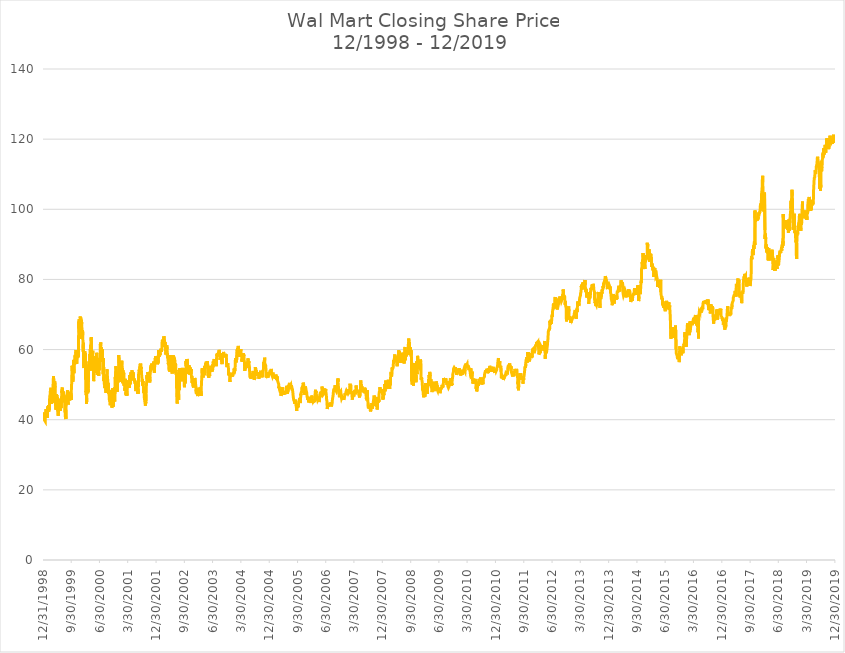
| Category | Close |
|---|---|
| 12/31/98 | 40.719 |
| 1/4/99 | 40.312 |
| 1/5/99 | 40.625 |
| 1/6/99 | 41.312 |
| 1/7/99 | 42.062 |
| 1/8/99 | 41.75 |
| 1/11/99 | 40.812 |
| 1/12/99 | 40.188 |
| 1/13/99 | 40.312 |
| 1/14/99 | 39.875 |
| 1/15/99 | 40.062 |
| 1/19/99 | 40.031 |
| 1/20/99 | 40.125 |
| 1/21/99 | 39.531 |
| 1/22/99 | 41 |
| 1/25/99 | 41 |
| 1/26/99 | 41.781 |
| 1/27/99 | 42.594 |
| 1/28/99 | 42.562 |
| 1/29/99 | 43 |
| 2/1/99 | 42.25 |
| 2/2/99 | 41.812 |
| 2/3/99 | 42.875 |
| 2/4/99 | 41.875 |
| 2/5/99 | 42.125 |
| 2/8/99 | 42.719 |
| 2/9/99 | 41.062 |
| 2/10/99 | 40.469 |
| 2/11/99 | 42.906 |
| 2/12/99 | 42.188 |
| 2/16/99 | 43.781 |
| 2/17/99 | 42.531 |
| 2/18/99 | 42.688 |
| 2/19/99 | 42.375 |
| 2/22/99 | 44.125 |
| 2/23/99 | 43.75 |
| 2/24/99 | 42.281 |
| 2/25/99 | 42.5 |
| 2/26/99 | 43.062 |
| 3/1/99 | 42.938 |
| 3/2/99 | 42.719 |
| 3/3/99 | 43.688 |
| 3/4/99 | 44.688 |
| 3/5/99 | 46.625 |
| 3/8/99 | 46.719 |
| 3/9/99 | 47 |
| 3/10/99 | 46.781 |
| 3/11/99 | 47.656 |
| 3/12/99 | 48.188 |
| 3/15/99 | 48.375 |
| 3/16/99 | 48 |
| 3/17/99 | 48.188 |
| 3/18/99 | 49.094 |
| 3/19/99 | 47.375 |
| 3/22/99 | 46.656 |
| 3/23/99 | 45.25 |
| 3/24/99 | 44.5 |
| 3/25/99 | 45.938 |
| 3/26/99 | 45.781 |
| 3/29/99 | 47.5 |
| 3/30/99 | 47.5 |
| 3/31/99 | 46.094 |
| 4/1/99 | 46.625 |
| 4/5/99 | 47.688 |
| 4/6/99 | 47.844 |
| 4/7/99 | 48.75 |
| 4/8/99 | 51.125 |
| 4/9/99 | 51.375 |
| 4/12/99 | 52.438 |
| 4/13/99 | 52.281 |
| 4/14/99 | 49.312 |
| 4/15/99 | 48.875 |
| 4/16/99 | 47.5 |
| 4/19/99 | 44.875 |
| 4/20/99 | 47.75 |
| 4/21/99 | 48.75 |
| 4/22/99 | 50.062 |
| 4/23/99 | 50.938 |
| 4/26/99 | 50.938 |
| 4/27/99 | 50.75 |
| 4/28/99 | 49.188 |
| 4/29/99 | 46.875 |
| 4/30/99 | 46 |
| 5/3/99 | 46.125 |
| 5/4/99 | 44 |
| 5/5/99 | 45.062 |
| 5/6/99 | 42.875 |
| 5/7/99 | 44.75 |
| 5/10/99 | 45.188 |
| 5/11/99 | 47.312 |
| 5/12/99 | 46.562 |
| 5/13/99 | 47 |
| 5/14/99 | 46.375 |
| 5/17/99 | 45.688 |
| 5/18/99 | 46.438 |
| 5/19/99 | 45.688 |
| 5/20/99 | 44.5 |
| 5/21/99 | 43.25 |
| 5/24/99 | 42.812 |
| 5/25/99 | 42.375 |
| 5/26/99 | 42.938 |
| 5/27/99 | 41.125 |
| 5/28/99 | 42.625 |
| 6/1/99 | 43.438 |
| 6/2/99 | 44.375 |
| 6/3/99 | 45.5 |
| 6/4/99 | 46 |
| 6/7/99 | 45.75 |
| 6/8/99 | 44.375 |
| 6/9/99 | 44.125 |
| 6/10/99 | 43.125 |
| 6/11/99 | 42.688 |
| 6/14/99 | 43.125 |
| 6/15/99 | 42.5 |
| 6/16/99 | 44.375 |
| 6/17/99 | 43.625 |
| 6/18/99 | 43.75 |
| 6/21/99 | 45.062 |
| 6/22/99 | 44.938 |
| 6/23/99 | 44.375 |
| 6/24/99 | 43.312 |
| 6/25/99 | 43.438 |
| 6/28/99 | 45.562 |
| 6/29/99 | 46.812 |
| 6/30/99 | 48.25 |
| 7/1/99 | 47.75 |
| 7/2/99 | 48.75 |
| 7/6/99 | 49.188 |
| 7/7/99 | 48 |
| 7/8/99 | 47 |
| 7/9/99 | 47.938 |
| 7/12/99 | 47.438 |
| 7/13/99 | 47.562 |
| 7/14/99 | 47.625 |
| 7/15/99 | 47.5 |
| 7/16/99 | 48 |
| 7/19/99 | 48.062 |
| 7/20/99 | 46.875 |
| 7/21/99 | 45.438 |
| 7/22/99 | 45.188 |
| 7/23/99 | 44.938 |
| 7/26/99 | 45.625 |
| 7/27/99 | 45.562 |
| 7/28/99 | 45.062 |
| 7/29/99 | 44 |
| 7/30/99 | 42.25 |
| 8/2/99 | 42.375 |
| 8/3/99 | 41.938 |
| 8/4/99 | 40.938 |
| 8/5/99 | 41.375 |
| 8/6/99 | 41.25 |
| 8/9/99 | 40.188 |
| 8/10/99 | 42.875 |
| 8/11/99 | 43.375 |
| 8/12/99 | 44.375 |
| 8/13/99 | 44.812 |
| 8/16/99 | 46 |
| 8/17/99 | 46.938 |
| 8/18/99 | 46.375 |
| 8/19/99 | 46.062 |
| 8/20/99 | 46.688 |
| 8/23/99 | 47.75 |
| 8/24/99 | 47.562 |
| 8/25/99 | 48.375 |
| 8/26/99 | 47.312 |
| 8/27/99 | 46.688 |
| 8/30/99 | 45.5 |
| 8/31/99 | 44.312 |
| 9/1/99 | 45 |
| 9/2/99 | 45.688 |
| 9/3/99 | 47.562 |
| 9/7/99 | 46.25 |
| 9/8/99 | 47.125 |
| 9/9/99 | 47.5 |
| 9/10/99 | 47.688 |
| 9/13/99 | 48 |
| 9/14/99 | 46.938 |
| 9/15/99 | 45.5 |
| 9/16/99 | 45.312 |
| 9/17/99 | 46.625 |
| 9/20/99 | 46.188 |
| 9/21/99 | 45.75 |
| 9/22/99 | 47.25 |
| 9/23/99 | 46.688 |
| 9/24/99 | 46.5 |
| 9/27/99 | 46.312 |
| 9/28/99 | 46.938 |
| 9/29/99 | 45.625 |
| 9/30/99 | 47.562 |
| 10/1/99 | 48.312 |
| 10/4/99 | 50.312 |
| 10/5/99 | 51.25 |
| 10/6/99 | 51.375 |
| 10/7/99 | 51.312 |
| 10/8/99 | 55.375 |
| 10/11/99 | 53.938 |
| 10/12/99 | 53.875 |
| 10/13/99 | 51.312 |
| 10/14/99 | 52.375 |
| 10/15/99 | 50.812 |
| 10/18/99 | 52.125 |
| 10/19/99 | 52.688 |
| 10/20/99 | 54.812 |
| 10/21/99 | 54.875 |
| 10/22/99 | 57.062 |
| 10/25/99 | 55.938 |
| 10/26/99 | 53.25 |
| 10/27/99 | 53 |
| 10/28/99 | 55.75 |
| 10/29/99 | 56.312 |
| 11/1/99 | 56.25 |
| 11/2/99 | 56.125 |
| 11/3/99 | 55.75 |
| 11/4/99 | 56 |
| 11/5/99 | 58.062 |
| 11/8/99 | 58.5 |
| 11/9/99 | 58 |
| 11/10/99 | 57.125 |
| 11/11/99 | 57.438 |
| 11/12/99 | 58.875 |
| 11/15/99 | 58.938 |
| 11/16/99 | 59.875 |
| 11/17/99 | 58.875 |
| 11/18/99 | 59.375 |
| 11/19/99 | 58.125 |
| 11/22/99 | 56.75 |
| 11/23/99 | 55.938 |
| 11/24/99 | 57.938 |
| 11/26/99 | 58.203 |
| 11/29/99 | 59 |
| 11/30/99 | 57.625 |
| 12/1/99 | 58.578 |
| 12/2/99 | 57.672 |
| 12/3/99 | 59.062 |
| 12/6/99 | 59.578 |
| 12/7/99 | 58 |
| 12/8/99 | 58.656 |
| 12/9/99 | 62.25 |
| 12/10/99 | 63.25 |
| 12/13/99 | 68 |
| 12/14/99 | 67.062 |
| 12/15/99 | 66.016 |
| 12/16/99 | 68.625 |
| 12/17/99 | 65 |
| 12/20/99 | 64.281 |
| 12/21/99 | 64.812 |
| 12/22/99 | 65.688 |
| 12/23/99 | 67.375 |
| 12/27/99 | 69.438 |
| 12/28/99 | 69.312 |
| 12/29/99 | 67.375 |
| 12/30/99 | 67.812 |
| 12/31/99 | 69.125 |
| 1/3/00 | 66.812 |
| 1/4/00 | 64.312 |
| 1/5/00 | 63 |
| 1/6/00 | 63.688 |
| 1/7/00 | 68.5 |
| 1/10/00 | 67.25 |
| 1/11/00 | 66.25 |
| 1/12/00 | 65.062 |
| 1/13/00 | 65.125 |
| 1/14/00 | 64.5 |
| 1/18/00 | 65.562 |
| 1/19/00 | 64.062 |
| 1/20/00 | 63.375 |
| 1/21/00 | 62.438 |
| 1/24/00 | 59.375 |
| 1/25/00 | 61.125 |
| 1/26/00 | 61.938 |
| 1/27/00 | 59.125 |
| 1/28/00 | 55.125 |
| 1/31/00 | 54.75 |
| 2/1/00 | 58.688 |
| 2/2/00 | 58.375 |
| 2/3/00 | 58.375 |
| 2/4/00 | 56.312 |
| 2/7/00 | 55.75 |
| 2/8/00 | 59.5 |
| 2/9/00 | 57.812 |
| 2/10/00 | 57 |
| 2/11/00 | 56.062 |
| 2/14/00 | 58.875 |
| 2/15/00 | 58 |
| 2/16/00 | 52.75 |
| 2/17/00 | 48.375 |
| 2/18/00 | 47.75 |
| 2/22/00 | 48.125 |
| 2/23/00 | 47 |
| 2/24/00 | 47.875 |
| 2/25/00 | 44.5 |
| 2/28/00 | 46.188 |
| 2/29/00 | 48.75 |
| 3/1/00 | 49 |
| 3/2/00 | 50.562 |
| 3/3/00 | 52.625 |
| 3/6/00 | 50.5 |
| 3/7/00 | 47.562 |
| 3/8/00 | 48.312 |
| 3/9/00 | 48.938 |
| 3/10/00 | 47.938 |
| 3/13/00 | 47.688 |
| 3/14/00 | 47.75 |
| 3/15/00 | 51.5 |
| 3/16/00 | 54.625 |
| 3/17/00 | 55.75 |
| 3/20/00 | 55.125 |
| 3/21/00 | 56.625 |
| 3/22/00 | 55.375 |
| 3/23/00 | 54 |
| 3/24/00 | 55.5 |
| 3/27/00 | 55.438 |
| 3/28/00 | 54.5 |
| 3/29/00 | 58.75 |
| 3/30/00 | 59 |
| 3/31/00 | 56.5 |
| 4/3/00 | 61.188 |
| 4/4/00 | 60 |
| 4/5/00 | 58.25 |
| 4/6/00 | 61.125 |
| 4/7/00 | 61.5 |
| 4/10/00 | 63.562 |
| 4/11/00 | 63.375 |
| 4/12/00 | 62.438 |
| 4/13/00 | 60.062 |
| 4/14/00 | 55 |
| 4/17/00 | 54 |
| 4/18/00 | 53.875 |
| 4/19/00 | 54.938 |
| 4/20/00 | 57.688 |
| 4/24/00 | 58.875 |
| 4/25/00 | 59.688 |
| 4/26/00 | 58.75 |
| 4/27/00 | 57.688 |
| 4/28/00 | 55.375 |
| 5/1/00 | 57.938 |
| 5/2/00 | 57.625 |
| 5/3/00 | 53.438 |
| 5/4/00 | 51 |
| 5/5/00 | 51.312 |
| 5/8/00 | 52.375 |
| 5/9/00 | 53 |
| 5/10/00 | 56.688 |
| 5/11/00 | 56 |
| 5/12/00 | 56.812 |
| 5/15/00 | 57 |
| 5/16/00 | 58 |
| 5/17/00 | 56.375 |
| 5/18/00 | 57.938 |
| 5/19/00 | 57.062 |
| 5/22/00 | 57.375 |
| 5/23/00 | 57.188 |
| 5/24/00 | 56.875 |
| 5/25/00 | 55 |
| 5/26/00 | 54 |
| 5/30/00 | 53.375 |
| 5/31/00 | 57.625 |
| 6/1/00 | 57 |
| 6/2/00 | 59.062 |
| 6/5/00 | 59.312 |
| 6/6/00 | 58.25 |
| 6/7/00 | 57.875 |
| 6/8/00 | 56.875 |
| 6/9/00 | 54 |
| 6/12/00 | 52.75 |
| 6/13/00 | 55 |
| 6/14/00 | 55.125 |
| 6/15/00 | 55.5 |
| 6/16/00 | 53.875 |
| 6/19/00 | 54.375 |
| 6/20/00 | 54.5 |
| 6/21/00 | 53.938 |
| 6/22/00 | 52.5 |
| 6/23/00 | 53.75 |
| 6/26/00 | 53.75 |
| 6/27/00 | 56.812 |
| 6/28/00 | 55.984 |
| 6/29/00 | 54.125 |
| 6/30/00 | 57.625 |
| 7/3/00 | 56.875 |
| 7/5/00 | 57 |
| 7/6/00 | 57.5 |
| 7/7/00 | 61.562 |
| 7/10/00 | 61.25 |
| 7/11/00 | 62 |
| 7/12/00 | 61 |
| 7/13/00 | 59.125 |
| 7/14/00 | 59.5 |
| 7/17/00 | 60.719 |
| 7/18/00 | 60.062 |
| 7/19/00 | 60 |
| 7/20/00 | 60 |
| 7/21/00 | 59.688 |
| 7/24/00 | 57.438 |
| 7/25/00 | 59.188 |
| 7/26/00 | 58.75 |
| 7/27/00 | 60.062 |
| 7/28/00 | 58.688 |
| 7/31/00 | 55.25 |
| 8/1/00 | 54.5 |
| 8/2/00 | 54.062 |
| 8/3/00 | 53.875 |
| 8/4/00 | 52.938 |
| 8/7/00 | 55.125 |
| 8/8/00 | 57.625 |
| 8/9/00 | 53.625 |
| 8/10/00 | 51 |
| 8/11/00 | 52.125 |
| 8/14/00 | 52.875 |
| 8/15/00 | 51.562 |
| 8/16/00 | 49.938 |
| 8/17/00 | 50 |
| 8/18/00 | 50.875 |
| 8/21/00 | 49 |
| 8/22/00 | 49.125 |
| 8/23/00 | 49.125 |
| 8/24/00 | 49.438 |
| 8/25/00 | 50.5 |
| 8/28/00 | 49.5 |
| 8/29/00 | 49.438 |
| 8/30/00 | 48.438 |
| 8/31/00 | 47.625 |
| 9/1/00 | 48.75 |
| 9/5/00 | 49.75 |
| 9/6/00 | 50 |
| 9/7/00 | 51 |
| 9/8/00 | 52.125 |
| 9/11/00 | 54.375 |
| 9/12/00 | 54 |
| 9/13/00 | 53.875 |
| 9/14/00 | 52.5 |
| 9/15/00 | 52 |
| 9/18/00 | 51.125 |
| 9/19/00 | 49.875 |
| 9/20/00 | 48.5 |
| 9/21/00 | 50 |
| 9/22/00 | 50.5 |
| 9/25/00 | 49 |
| 9/26/00 | 47.375 |
| 9/27/00 | 48.125 |
| 9/28/00 | 48.562 |
| 9/29/00 | 48.125 |
| 10/2/00 | 46.25 |
| 10/3/00 | 45.812 |
| 10/4/00 | 46.125 |
| 10/5/00 | 46.062 |
| 10/6/00 | 45.5 |
| 10/9/00 | 45.125 |
| 10/10/00 | 46.375 |
| 10/11/00 | 45.312 |
| 10/12/00 | 44.125 |
| 10/13/00 | 45 |
| 10/16/00 | 47.312 |
| 10/17/00 | 46 |
| 10/18/00 | 46.75 |
| 10/19/00 | 47.812 |
| 10/20/00 | 46.562 |
| 10/23/00 | 47.312 |
| 10/24/00 | 48.375 |
| 10/25/00 | 45.938 |
| 10/26/00 | 43.438 |
| 10/27/00 | 43.25 |
| 10/30/00 | 43.75 |
| 10/31/00 | 45.375 |
| 11/1/00 | 46.688 |
| 11/2/00 | 48.438 |
| 11/3/00 | 47.375 |
| 11/6/00 | 49 |
| 11/7/00 | 48.938 |
| 11/8/00 | 48.75 |
| 11/9/00 | 47.125 |
| 11/10/00 | 43.688 |
| 11/13/00 | 45.312 |
| 11/14/00 | 46.875 |
| 11/15/00 | 49 |
| 11/16/00 | 48.25 |
| 11/17/00 | 48.562 |
| 11/20/00 | 47.875 |
| 11/21/00 | 47.125 |
| 11/22/00 | 45.875 |
| 11/24/00 | 45.188 |
| 11/27/00 | 49.312 |
| 11/28/00 | 49 |
| 11/29/00 | 51.875 |
| 11/30/00 | 52.188 |
| 12/1/00 | 51.188 |
| 12/4/00 | 53.812 |
| 12/5/00 | 55.25 |
| 12/6/00 | 54.812 |
| 12/7/00 | 55 |
| 12/8/00 | 54.438 |
| 12/11/00 | 51.375 |
| 12/12/00 | 51.875 |
| 12/13/00 | 50.312 |
| 12/14/00 | 51.062 |
| 12/15/00 | 49.875 |
| 12/18/00 | 50.562 |
| 12/19/00 | 48 |
| 12/20/00 | 48.938 |
| 12/21/00 | 51.75 |
| 12/22/00 | 52.5 |
| 12/26/00 | 50.625 |
| 12/27/00 | 52.562 |
| 12/28/00 | 52.938 |
| 12/29/00 | 53.125 |
| 1/2/01 | 53.875 |
| 1/3/01 | 58.438 |
| 1/4/01 | 56.188 |
| 1/5/01 | 53.938 |
| 1/8/01 | 53.938 |
| 1/9/01 | 52.75 |
| 1/10/01 | 51.688 |
| 1/11/01 | 51.938 |
| 1/12/01 | 52.938 |
| 1/16/01 | 54.688 |
| 1/17/01 | 53.938 |
| 1/18/01 | 53.062 |
| 1/19/01 | 50.812 |
| 1/22/01 | 52.562 |
| 1/23/01 | 53.375 |
| 1/24/01 | 53.5 |
| 1/25/01 | 54 |
| 1/26/01 | 53.625 |
| 1/29/01 | 54.2 |
| 1/30/01 | 53.77 |
| 1/31/01 | 56.8 |
| 2/1/01 | 55.7 |
| 2/2/01 | 54.76 |
| 2/5/01 | 53.84 |
| 2/6/01 | 53.2 |
| 2/7/01 | 54.66 |
| 2/8/01 | 52.3 |
| 2/9/01 | 50.4 |
| 2/12/01 | 53.45 |
| 2/13/01 | 54.1 |
| 2/14/01 | 53 |
| 2/15/01 | 52 |
| 2/16/01 | 52.36 |
| 2/20/01 | 53.4 |
| 2/21/01 | 50.21 |
| 2/22/01 | 49.7 |
| 2/23/01 | 50.28 |
| 2/26/01 | 51.07 |
| 2/27/01 | 50.99 |
| 2/28/01 | 50.09 |
| 3/1/01 | 48.34 |
| 3/2/01 | 48.92 |
| 3/5/01 | 48.37 |
| 3/6/01 | 49.55 |
| 3/7/01 | 50.7 |
| 3/8/01 | 51.65 |
| 3/9/01 | 50.78 |
| 3/12/01 | 48.31 |
| 3/13/01 | 48.8 |
| 3/14/01 | 47.2 |
| 3/15/01 | 47.85 |
| 3/16/01 | 46.93 |
| 3/19/01 | 47.38 |
| 3/20/01 | 47.88 |
| 3/21/01 | 48.31 |
| 3/22/01 | 46.91 |
| 3/23/01 | 47.57 |
| 3/26/01 | 49.6 |
| 3/27/01 | 50.29 |
| 3/28/01 | 49.66 |
| 3/29/01 | 50.62 |
| 3/30/01 | 50.5 |
| 4/2/01 | 50.64 |
| 4/3/01 | 49.19 |
| 4/4/01 | 49.87 |
| 4/5/01 | 50.54 |
| 4/6/01 | 51.24 |
| 4/9/01 | 50.3 |
| 4/10/01 | 50.84 |
| 4/11/01 | 50.23 |
| 4/12/01 | 49.7 |
| 4/16/01 | 49.05 |
| 4/17/01 | 49.24 |
| 4/18/01 | 52.73 |
| 4/19/01 | 52.5 |
| 4/20/01 | 51.71 |
| 4/23/01 | 52.04 |
| 4/24/01 | 50.1 |
| 4/25/01 | 50.67 |
| 4/26/01 | 51.24 |
| 4/27/01 | 52.83 |
| 4/30/01 | 51.74 |
| 5/1/01 | 53.5 |
| 5/2/01 | 53.08 |
| 5/3/01 | 53.1 |
| 5/4/01 | 53.02 |
| 5/7/01 | 52.05 |
| 5/8/01 | 51.98 |
| 5/9/01 | 51.59 |
| 5/10/01 | 53.42 |
| 5/11/01 | 54.1 |
| 5/14/01 | 54.35 |
| 5/15/01 | 52 |
| 5/16/01 | 51.65 |
| 5/17/01 | 51.76 |
| 5/18/01 | 52.04 |
| 5/21/01 | 53.2 |
| 5/22/01 | 53.52 |
| 5/23/01 | 52.52 |
| 5/24/01 | 52.89 |
| 5/25/01 | 51.2 |
| 5/29/01 | 51.21 |
| 5/30/01 | 51.47 |
| 5/31/01 | 51.75 |
| 6/1/01 | 51.72 |
| 6/4/01 | 50.99 |
| 6/5/01 | 51.3 |
| 6/6/01 | 50.75 |
| 6/7/01 | 51.1 |
| 6/8/01 | 51.02 |
| 6/11/01 | 50.23 |
| 6/12/01 | 50.57 |
| 6/13/01 | 50.15 |
| 6/14/01 | 49.5 |
| 6/15/01 | 48.15 |
| 6/18/01 | 48.52 |
| 6/19/01 | 48.86 |
| 6/20/01 | 49.8 |
| 6/21/01 | 50.45 |
| 6/22/01 | 49.98 |
| 6/25/01 | 49 |
| 6/26/01 | 49.1 |
| 6/27/01 | 48.5 |
| 6/28/01 | 49.37 |
| 6/29/01 | 48.8 |
| 7/2/01 | 49.75 |
| 7/3/01 | 49.22 |
| 7/5/01 | 48.6 |
| 7/6/01 | 47.34 |
| 7/9/01 | 48.25 |
| 7/10/01 | 47.5 |
| 7/11/01 | 48.85 |
| 7/12/01 | 51.85 |
| 7/13/01 | 52.9 |
| 7/16/01 | 53.48 |
| 7/17/01 | 53.35 |
| 7/18/01 | 53.98 |
| 7/19/01 | 54.23 |
| 7/20/01 | 54.28 |
| 7/23/01 | 53.03 |
| 7/24/01 | 53.1 |
| 7/25/01 | 55.1 |
| 7/26/01 | 55.5 |
| 7/27/01 | 55.41 |
| 7/30/01 | 55.88 |
| 7/31/01 | 55.9 |
| 8/1/01 | 55.01 |
| 8/2/01 | 55.99 |
| 8/3/01 | 55.39 |
| 8/6/01 | 54.5 |
| 8/7/01 | 55.08 |
| 8/8/01 | 54.53 |
| 8/9/01 | 54.17 |
| 8/10/01 | 53.6 |
| 8/13/01 | 52.2 |
| 8/14/01 | 52.36 |
| 8/15/01 | 52 |
| 8/16/01 | 51.69 |
| 8/17/01 | 50.8 |
| 8/20/01 | 51.59 |
| 8/21/01 | 49.94 |
| 8/22/01 | 50.24 |
| 8/23/01 | 49.74 |
| 8/24/01 | 50.95 |
| 8/27/01 | 50.39 |
| 8/28/01 | 50.1 |
| 8/29/01 | 49.15 |
| 8/30/01 | 47.6 |
| 8/31/01 | 48.05 |
| 9/4/01 | 48.45 |
| 9/5/01 | 49.15 |
| 9/6/01 | 47.37 |
| 9/7/01 | 46.22 |
| 9/10/01 | 46.23 |
| 9/17/01 | 44 |
| 9/18/01 | 45.35 |
| 9/19/01 | 45.45 |
| 9/20/01 | 45.31 |
| 9/21/01 | 44.66 |
| 9/24/01 | 47.28 |
| 9/25/01 | 48.4 |
| 9/26/01 | 49.48 |
| 9/27/01 | 49.39 |
| 9/28/01 | 49.5 |
| 10/1/01 | 49.76 |
| 10/2/01 | 51.6 |
| 10/3/01 | 52.73 |
| 10/4/01 | 51.5 |
| 10/5/01 | 52.4 |
| 10/8/01 | 51.11 |
| 10/9/01 | 52.08 |
| 10/10/01 | 53.63 |
| 10/11/01 | 53.49 |
| 10/12/01 | 52.9 |
| 10/15/01 | 53.48 |
| 10/16/01 | 53.14 |
| 10/17/01 | 52.22 |
| 10/18/01 | 51.9 |
| 10/19/01 | 53.01 |
| 10/22/01 | 53.04 |
| 10/23/01 | 52.61 |
| 10/24/01 | 52.48 |
| 10/25/01 | 53.3 |
| 10/26/01 | 53.42 |
| 10/29/01 | 51.9 |
| 10/30/01 | 50.6 |
| 10/31/01 | 51.4 |
| 11/1/01 | 52.24 |
| 11/2/01 | 52.97 |
| 11/5/01 | 53.9 |
| 11/6/01 | 54.94 |
| 11/7/01 | 53.82 |
| 11/8/01 | 54.5 |
| 11/9/01 | 55.1 |
| 11/12/01 | 55.58 |
| 11/13/01 | 54.26 |
| 11/14/01 | 55.28 |
| 11/15/01 | 56 |
| 11/16/01 | 55.1 |
| 11/19/01 | 55.75 |
| 11/20/01 | 55.7 |
| 11/21/01 | 55.12 |
| 11/23/01 | 55.8 |
| 11/26/01 | 55.75 |
| 11/27/01 | 55.08 |
| 11/28/01 | 55 |
| 11/29/01 | 54.65 |
| 11/30/01 | 55.15 |
| 12/3/01 | 54.58 |
| 12/4/01 | 55.17 |
| 12/5/01 | 56.57 |
| 12/6/01 | 55.62 |
| 12/7/01 | 55.34 |
| 12/10/01 | 54.27 |
| 12/11/01 | 54.08 |
| 12/12/01 | 54.33 |
| 12/13/01 | 53.36 |
| 12/14/01 | 54.06 |
| 12/17/01 | 55.85 |
| 12/18/01 | 55.78 |
| 12/19/01 | 56.28 |
| 12/20/01 | 56.26 |
| 12/21/01 | 57.57 |
| 12/24/01 | 57.13 |
| 12/26/01 | 58.15 |
| 12/27/01 | 58.37 |
| 12/28/01 | 58.35 |
| 12/31/01 | 57.55 |
| 1/2/02 | 58.05 |
| 1/3/02 | 57.98 |
| 1/4/02 | 57.6 |
| 1/7/02 | 57.39 |
| 1/8/02 | 57.84 |
| 1/9/02 | 56.4 |
| 1/10/02 | 57 |
| 1/11/02 | 55.8 |
| 1/14/02 | 55.76 |
| 1/15/02 | 56.87 |
| 1/16/02 | 55.99 |
| 1/17/02 | 56.76 |
| 1/18/02 | 56.35 |
| 1/22/02 | 58.01 |
| 1/23/02 | 59.86 |
| 1/24/02 | 59.67 |
| 1/25/02 | 58.4 |
| 1/28/02 | 58.63 |
| 1/29/02 | 57.91 |
| 1/30/02 | 59.75 |
| 1/31/02 | 59.98 |
| 2/1/02 | 59.26 |
| 2/4/02 | 58.9 |
| 2/5/02 | 58.8 |
| 2/6/02 | 58.88 |
| 2/7/02 | 58.39 |
| 2/8/02 | 59.15 |
| 2/11/02 | 60.25 |
| 2/12/02 | 60.1 |
| 2/13/02 | 60.12 |
| 2/14/02 | 60.49 |
| 2/15/02 | 60.03 |
| 2/19/02 | 59.29 |
| 2/20/02 | 60.02 |
| 2/21/02 | 59.55 |
| 2/22/02 | 59.95 |
| 2/25/02 | 60.65 |
| 2/26/02 | 62.1 |
| 2/27/02 | 62.25 |
| 2/28/02 | 62.01 |
| 3/1/02 | 62.81 |
| 3/4/02 | 62.98 |
| 3/5/02 | 60.76 |
| 3/6/02 | 60.9 |
| 3/7/02 | 61.7 |
| 3/8/02 | 62.52 |
| 3/11/02 | 62.53 |
| 3/12/02 | 62.23 |
| 3/13/02 | 61.99 |
| 3/14/02 | 62.27 |
| 3/15/02 | 63.75 |
| 3/18/02 | 63.55 |
| 3/19/02 | 63.46 |
| 3/20/02 | 63.18 |
| 3/21/02 | 62.2 |
| 3/22/02 | 62.05 |
| 3/25/02 | 61.28 |
| 3/26/02 | 62.17 |
| 3/27/02 | 62 |
| 3/28/02 | 61.3 |
| 4/1/02 | 59.56 |
| 4/2/02 | 58.93 |
| 4/3/02 | 58.6 |
| 4/4/02 | 59.28 |
| 4/5/02 | 59.14 |
| 4/8/02 | 59.78 |
| 4/9/02 | 60.1 |
| 4/10/02 | 60.57 |
| 4/11/02 | 60.17 |
| 4/12/02 | 61.23 |
| 4/15/02 | 59.93 |
| 4/16/02 | 60 |
| 4/17/02 | 59.29 |
| 4/18/02 | 58.15 |
| 4/19/02 | 58.93 |
| 4/22/02 | 57.55 |
| 4/23/02 | 58.05 |
| 4/24/02 | 57.45 |
| 4/25/02 | 57 |
| 4/26/02 | 55.8 |
| 4/29/02 | 56.2 |
| 4/30/02 | 55.86 |
| 5/1/02 | 56.8 |
| 5/2/02 | 56.65 |
| 5/3/02 | 55.25 |
| 5/6/02 | 53.99 |
| 5/7/02 | 55.01 |
| 5/8/02 | 56.39 |
| 5/9/02 | 54.99 |
| 5/10/02 | 53.66 |
| 5/13/02 | 55.04 |
| 5/14/02 | 57.39 |
| 5/15/02 | 56.77 |
| 5/16/02 | 58.35 |
| 5/17/02 | 58.33 |
| 5/20/02 | 57.8 |
| 5/21/02 | 56.6 |
| 5/22/02 | 56.8 |
| 5/23/02 | 56.31 |
| 5/24/02 | 55.52 |
| 5/28/02 | 54.79 |
| 5/29/02 | 54.53 |
| 5/30/02 | 53.99 |
| 5/31/02 | 54.1 |
| 6/3/02 | 53.15 |
| 6/4/02 | 54 |
| 6/5/02 | 54.96 |
| 6/6/02 | 54.1 |
| 6/7/02 | 54.43 |
| 6/10/02 | 56.4 |
| 6/11/02 | 56.45 |
| 6/12/02 | 58.3 |
| 6/13/02 | 56.5 |
| 6/14/02 | 56.95 |
| 6/17/02 | 58.31 |
| 6/18/02 | 58.55 |
| 6/19/02 | 57.41 |
| 6/20/02 | 56.5 |
| 6/21/02 | 54.98 |
| 6/24/02 | 55.75 |
| 6/25/02 | 55.1 |
| 6/26/02 | 55.62 |
| 6/27/02 | 57.7 |
| 6/28/02 | 55.01 |
| 7/1/02 | 54.4 |
| 7/2/02 | 53.42 |
| 7/3/02 | 55.04 |
| 7/5/02 | 56 |
| 7/8/02 | 55.6 |
| 7/9/02 | 54.65 |
| 7/10/02 | 53.76 |
| 7/11/02 | 54.18 |
| 7/12/02 | 52.85 |
| 7/15/02 | 53.44 |
| 7/16/02 | 49.88 |
| 7/17/02 | 48.25 |
| 7/18/02 | 47.41 |
| 7/19/02 | 46.5 |
| 7/22/02 | 44.6 |
| 7/23/02 | 45.1 |
| 7/24/02 | 47.94 |
| 7/25/02 | 47 |
| 7/26/02 | 48.18 |
| 7/29/02 | 49.53 |
| 7/30/02 | 49.12 |
| 7/31/02 | 49.18 |
| 8/1/02 | 47.4 |
| 8/2/02 | 46.1 |
| 8/5/02 | 45.6 |
| 8/6/02 | 47.28 |
| 8/7/02 | 48.38 |
| 8/8/02 | 49.19 |
| 8/9/02 | 49.2 |
| 8/12/02 | 48.41 |
| 8/13/02 | 48.71 |
| 8/14/02 | 52.62 |
| 8/15/02 | 54.71 |
| 8/16/02 | 53.79 |
| 8/19/02 | 54.69 |
| 8/20/02 | 53.78 |
| 8/21/02 | 54.09 |
| 8/22/02 | 54.25 |
| 8/23/02 | 53.19 |
| 8/26/02 | 53.4 |
| 8/27/02 | 53.12 |
| 8/28/02 | 53.4 |
| 8/29/02 | 53.2 |
| 8/30/02 | 53.48 |
| 9/3/02 | 51.87 |
| 9/4/02 | 52.34 |
| 9/5/02 | 50.94 |
| 9/6/02 | 52.78 |
| 9/9/02 | 53.28 |
| 9/10/02 | 54.78 |
| 9/11/02 | 54.2 |
| 9/12/02 | 53.12 |
| 9/13/02 | 54.4 |
| 9/16/02 | 54.75 |
| 9/17/02 | 54.26 |
| 9/18/02 | 54.38 |
| 9/19/02 | 53.7 |
| 9/20/02 | 54.7 |
| 9/23/02 | 52.6 |
| 9/24/02 | 51.49 |
| 9/25/02 | 52.04 |
| 9/26/02 | 53.71 |
| 9/27/02 | 51.24 |
| 9/30/02 | 49.24 |
| 10/1/02 | 51.71 |
| 10/2/02 | 51.32 |
| 10/3/02 | 51.1 |
| 10/4/02 | 51.75 |
| 10/7/02 | 50.35 |
| 10/8/02 | 52.6 |
| 10/9/02 | 50.74 |
| 10/10/02 | 51.64 |
| 10/11/02 | 53.83 |
| 10/14/02 | 54.15 |
| 10/15/02 | 56.29 |
| 10/16/02 | 56.76 |
| 10/17/02 | 55.33 |
| 10/18/02 | 56.28 |
| 10/21/02 | 56.4 |
| 10/22/02 | 56.1 |
| 10/23/02 | 57.23 |
| 10/24/02 | 56.47 |
| 10/25/02 | 57.33 |
| 10/28/02 | 56.07 |
| 10/29/02 | 56.47 |
| 10/30/02 | 53.8 |
| 10/31/02 | 53.55 |
| 11/1/02 | 54.55 |
| 11/4/02 | 53.45 |
| 11/5/02 | 54.42 |
| 11/6/02 | 54.34 |
| 11/7/02 | 54 |
| 11/8/02 | 54.03 |
| 11/11/02 | 53 |
| 11/12/02 | 53.85 |
| 11/13/02 | 54.98 |
| 11/14/02 | 55.57 |
| 11/15/02 | 55.49 |
| 11/18/02 | 53.68 |
| 11/19/02 | 52.92 |
| 11/20/02 | 54.4 |
| 11/21/02 | 53.95 |
| 11/22/02 | 53.76 |
| 11/25/02 | 53.82 |
| 11/26/02 | 53.24 |
| 11/27/02 | 54.84 |
| 11/29/02 | 53.9 |
| 12/2/02 | 54.38 |
| 12/3/02 | 53.93 |
| 12/4/02 | 54.44 |
| 12/5/02 | 53.02 |
| 12/6/02 | 53.04 |
| 12/9/02 | 51.85 |
| 12/10/02 | 52.49 |
| 12/11/02 | 52 |
| 12/12/02 | 51.38 |
| 12/13/02 | 50.54 |
| 12/16/02 | 51.94 |
| 12/17/02 | 50.94 |
| 12/18/02 | 50.38 |
| 12/19/02 | 50.16 |
| 12/20/02 | 50.79 |
| 12/23/02 | 49.59 |
| 12/24/02 | 49.7 |
| 12/26/02 | 49.76 |
| 12/27/02 | 49.16 |
| 12/30/02 | 50.64 |
| 12/31/02 | 50.51 |
| 1/2/03 | 51.6 |
| 1/3/03 | 50 |
| 1/6/03 | 50.19 |
| 1/7/03 | 50.46 |
| 1/8/03 | 49.99 |
| 1/9/03 | 51.92 |
| 1/10/03 | 51.62 |
| 1/13/03 | 51.28 |
| 1/14/03 | 51.41 |
| 1/15/03 | 50.59 |
| 1/16/03 | 50.3 |
| 1/17/03 | 49.97 |
| 1/21/03 | 49.01 |
| 1/22/03 | 48.07 |
| 1/23/03 | 48.57 |
| 1/24/03 | 47.3 |
| 1/27/03 | 47.1 |
| 1/28/03 | 48.18 |
| 1/29/03 | 48.1 |
| 1/30/03 | 47.57 |
| 1/31/03 | 47.8 |
| 2/3/03 | 48.07 |
| 2/4/03 | 47.15 |
| 2/5/03 | 46.74 |
| 2/6/03 | 46.79 |
| 2/7/03 | 46.79 |
| 2/10/03 | 47.02 |
| 2/11/03 | 47.25 |
| 2/12/03 | 47.85 |
| 2/13/03 | 47.64 |
| 2/14/03 | 49.15 |
| 2/18/03 | 49.08 |
| 2/19/03 | 48.77 |
| 2/20/03 | 48.08 |
| 2/21/03 | 48.9 |
| 2/24/03 | 47.64 |
| 2/25/03 | 48.43 |
| 2/26/03 | 47.83 |
| 2/27/03 | 48.16 |
| 2/28/03 | 48.06 |
| 3/3/03 | 47.79 |
| 3/4/03 | 46.9 |
| 3/5/03 | 47.88 |
| 3/6/03 | 47.4 |
| 3/7/03 | 48.12 |
| 3/10/03 | 47.13 |
| 3/11/03 | 46.8 |
| 3/12/03 | 47.5 |
| 3/13/03 | 49.55 |
| 3/14/03 | 49.36 |
| 3/17/03 | 51.97 |
| 3/18/03 | 52.25 |
| 3/19/03 | 53.05 |
| 3/20/03 | 53.11 |
| 3/21/03 | 54.67 |
| 3/24/03 | 52.52 |
| 3/25/03 | 53.47 |
| 3/26/03 | 53.33 |
| 3/27/03 | 53.54 |
| 3/28/03 | 53.13 |
| 3/31/03 | 52.03 |
| 4/1/03 | 52.42 |
| 4/2/03 | 54.07 |
| 4/3/03 | 54.05 |
| 4/4/03 | 54.6 |
| 4/7/03 | 54.32 |
| 4/8/03 | 54.56 |
| 4/9/03 | 53.7 |
| 4/10/03 | 54.58 |
| 4/11/03 | 52.98 |
| 4/14/03 | 52.65 |
| 4/15/03 | 55.29 |
| 4/16/03 | 54.54 |
| 4/17/03 | 55.41 |
| 4/21/03 | 54.98 |
| 4/22/03 | 55.99 |
| 4/23/03 | 55.98 |
| 4/24/03 | 55.11 |
| 4/25/03 | 55 |
| 4/28/03 | 56.09 |
| 4/29/03 | 56.58 |
| 4/30/03 | 56.32 |
| 5/1/03 | 55.94 |
| 5/2/03 | 56.15 |
| 5/5/03 | 55.58 |
| 5/6/03 | 55.91 |
| 5/7/03 | 55.08 |
| 5/8/03 | 55.01 |
| 5/9/03 | 55.8 |
| 5/12/03 | 56.7 |
| 5/13/03 | 55.49 |
| 5/14/03 | 53.9 |
| 5/15/03 | 53.76 |
| 5/16/03 | 52.92 |
| 5/19/03 | 52.47 |
| 5/20/03 | 52.81 |
| 5/21/03 | 52.59 |
| 5/22/03 | 52.9 |
| 5/23/03 | 52 |
| 5/27/03 | 52.5 |
| 5/28/03 | 53.35 |
| 5/29/03 | 52.81 |
| 5/30/03 | 52.61 |
| 6/2/03 | 52.46 |
| 6/3/03 | 52.85 |
| 6/4/03 | 53.86 |
| 6/5/03 | 54.62 |
| 6/6/03 | 53.62 |
| 6/9/03 | 53.79 |
| 6/10/03 | 54.76 |
| 6/11/03 | 55.39 |
| 6/12/03 | 55.03 |
| 6/13/03 | 54.08 |
| 6/16/03 | 55.25 |
| 6/17/03 | 55.06 |
| 6/18/03 | 55.24 |
| 6/19/03 | 54.49 |
| 6/20/03 | 54.26 |
| 6/23/03 | 53.74 |
| 6/24/03 | 54.6 |
| 6/25/03 | 54.18 |
| 6/26/03 | 54.39 |
| 6/27/03 | 53.8 |
| 6/30/03 | 53.67 |
| 7/1/03 | 54.35 |
| 7/2/03 | 55.73 |
| 7/3/03 | 54.96 |
| 7/7/03 | 56.55 |
| 7/8/03 | 56.7 |
| 7/9/03 | 55.76 |
| 7/10/03 | 55.63 |
| 7/11/03 | 56.53 |
| 7/14/03 | 56.65 |
| 7/15/03 | 57.32 |
| 7/16/03 | 56.65 |
| 7/17/03 | 55.8 |
| 7/18/03 | 57 |
| 7/21/03 | 55.96 |
| 7/22/03 | 56.9 |
| 7/23/03 | 56.5 |
| 7/24/03 | 55.63 |
| 7/25/03 | 56.19 |
| 7/28/03 | 56.16 |
| 7/29/03 | 55.49 |
| 7/30/03 | 55.9 |
| 7/31/03 | 55.91 |
| 8/1/03 | 55.27 |
| 8/4/03 | 55.83 |
| 8/5/03 | 55.3 |
| 8/6/03 | 55.74 |
| 8/7/03 | 57 |
| 8/8/03 | 57.77 |
| 8/11/03 | 57.7 |
| 8/12/03 | 58.8 |
| 8/13/03 | 58.07 |
| 8/14/03 | 57.93 |
| 8/15/03 | 58.1 |
| 8/18/03 | 58.92 |
| 8/19/03 | 58.88 |
| 8/20/03 | 58.78 |
| 8/21/03 | 59.19 |
| 8/22/03 | 58.4 |
| 8/25/03 | 59.1 |
| 8/26/03 | 59.1 |
| 8/27/03 | 59.11 |
| 8/28/03 | 59.3 |
| 8/29/03 | 59.17 |
| 9/2/03 | 59.92 |
| 9/3/03 | 59.98 |
| 9/4/03 | 60.08 |
| 9/5/03 | 58.89 |
| 9/8/03 | 58.59 |
| 9/9/03 | 57.06 |
| 9/10/03 | 56.85 |
| 9/11/03 | 57.5 |
| 9/12/03 | 57.48 |
| 9/15/03 | 57.75 |
| 9/16/03 | 58.42 |
| 9/17/03 | 57.59 |
| 9/18/03 | 58.49 |
| 9/19/03 | 58.14 |
| 9/22/03 | 57.07 |
| 9/23/03 | 57.62 |
| 9/24/03 | 56.62 |
| 9/25/03 | 56.89 |
| 9/26/03 | 56.8 |
| 9/29/03 | 57.23 |
| 9/30/03 | 55.85 |
| 10/1/03 | 57.06 |
| 10/2/03 | 57.06 |
| 10/3/03 | 57.48 |
| 10/6/03 | 57.99 |
| 10/7/03 | 58.9 |
| 10/8/03 | 58.52 |
| 10/9/03 | 58.96 |
| 10/10/03 | 58.42 |
| 10/13/03 | 58.95 |
| 10/14/03 | 59.33 |
| 10/15/03 | 59.07 |
| 10/16/03 | 59.39 |
| 10/17/03 | 58.84 |
| 10/20/03 | 59 |
| 10/21/03 | 58.97 |
| 10/22/03 | 58.24 |
| 10/23/03 | 58.7 |
| 10/24/03 | 58.11 |
| 10/27/03 | 57.79 |
| 10/28/03 | 58.76 |
| 10/29/03 | 58.85 |
| 10/30/03 | 58.8 |
| 10/31/03 | 58.95 |
| 11/3/03 | 59.04 |
| 11/4/03 | 58.66 |
| 11/5/03 | 57.92 |
| 11/6/03 | 58.61 |
| 11/7/03 | 58.42 |
| 11/10/03 | 58.12 |
| 11/11/03 | 58.28 |
| 11/12/03 | 57.96 |
| 11/13/03 | 55.52 |
| 11/14/03 | 55 |
| 11/17/03 | 55 |
| 11/18/03 | 54.72 |
| 11/19/03 | 55.21 |
| 11/20/03 | 55.07 |
| 11/21/03 | 54.81 |
| 11/24/03 | 56.08 |
| 11/25/03 | 56.04 |
| 11/26/03 | 55.7 |
| 11/28/03 | 55.64 |
| 12/1/03 | 54.5 |
| 12/2/03 | 53.02 |
| 12/3/03 | 52.69 |
| 12/4/03 | 53.02 |
| 12/5/03 | 53.48 |
| 12/8/03 | 53.4 |
| 12/9/03 | 52.61 |
| 12/10/03 | 52.95 |
| 12/11/03 | 52.81 |
| 12/12/03 | 52.5 |
| 12/15/03 | 50.74 |
| 12/16/03 | 51.39 |
| 12/17/03 | 51.9 |
| 12/18/03 | 52.6 |
| 12/19/03 | 52.35 |
| 12/22/03 | 53.07 |
| 12/23/03 | 52.77 |
| 12/24/03 | 52.44 |
| 12/26/03 | 52.52 |
| 12/29/03 | 52.9 |
| 12/30/03 | 52.78 |
| 12/31/03 | 53.05 |
| 1/2/04 | 52.3 |
| 1/5/04 | 52.12 |
| 1/6/04 | 53.34 |
| 1/7/04 | 53.48 |
| 1/8/04 | 53.26 |
| 1/9/04 | 52.4 |
| 1/12/04 | 52.51 |
| 1/13/04 | 52.76 |
| 1/14/04 | 53.14 |
| 1/15/04 | 53.49 |
| 1/16/04 | 53.48 |
| 1/20/04 | 52.95 |
| 1/21/04 | 53.45 |
| 1/22/04 | 53.18 |
| 1/23/04 | 54.21 |
| 1/26/04 | 54.61 |
| 1/27/04 | 54.43 |
| 1/28/04 | 53.27 |
| 1/29/04 | 54.48 |
| 1/30/04 | 53.85 |
| 2/2/04 | 54.69 |
| 2/3/04 | 55.01 |
| 2/4/04 | 55.39 |
| 2/5/04 | 56.25 |
| 2/6/04 | 57.58 |
| 2/9/04 | 57.32 |
| 2/10/04 | 57.53 |
| 2/11/04 | 57.07 |
| 2/12/04 | 56.98 |
| 2/13/04 | 56.32 |
| 2/17/04 | 57.52 |
| 2/18/04 | 57.2 |
| 2/19/04 | 58.38 |
| 2/20/04 | 59.43 |
| 2/23/04 | 60.05 |
| 2/24/04 | 59.95 |
| 2/25/04 | 59.88 |
| 2/26/04 | 59.4 |
| 2/27/04 | 59.56 |
| 3/1/04 | 60.45 |
| 3/2/04 | 59.55 |
| 3/3/04 | 60.36 |
| 3/4/04 | 61.05 |
| 3/5/04 | 60.24 |
| 3/8/04 | 60.46 |
| 3/9/04 | 60.28 |
| 3/10/04 | 58.76 |
| 3/11/04 | 57.9 |
| 3/12/04 | 58.48 |
| 3/15/04 | 57.9 |
| 3/16/04 | 57.97 |
| 3/17/04 | 58.35 |
| 3/18/04 | 58.94 |
| 3/19/04 | 58.6 |
| 3/22/04 | 58.1 |
| 3/23/04 | 58.21 |
| 3/24/04 | 58.58 |
| 3/25/04 | 59.82 |
| 3/26/04 | 59.41 |
| 3/29/04 | 60.13 |
| 3/30/04 | 60 |
| 3/31/04 | 59.69 |
| 4/1/04 | 58.35 |
| 4/2/04 | 58.6 |
| 4/5/04 | 58.64 |
| 4/6/04 | 59.02 |
| 4/7/04 | 57.98 |
| 4/8/04 | 56.69 |
| 4/12/04 | 57.34 |
| 4/13/04 | 56.47 |
| 4/14/04 | 57.42 |
| 4/15/04 | 57.79 |
| 4/16/04 | 58.44 |
| 4/19/04 | 58.37 |
| 4/20/04 | 58.1 |
| 4/21/04 | 58.35 |
| 4/22/04 | 58.6 |
| 4/23/04 | 58.97 |
| 4/26/04 | 58.14 |
| 4/27/04 | 58.6 |
| 4/28/04 | 57.98 |
| 4/29/04 | 57.57 |
| 4/30/04 | 57 |
| 5/3/04 | 56.54 |
| 5/4/04 | 56 |
| 5/5/04 | 55.86 |
| 5/6/04 | 54.58 |
| 5/7/04 | 53.9 |
| 5/10/04 | 55.22 |
| 5/11/04 | 54.53 |
| 5/12/04 | 55.06 |
| 5/13/04 | 55.25 |
| 5/14/04 | 55.06 |
| 5/17/04 | 54.7 |
| 5/18/04 | 55.21 |
| 5/19/04 | 54.78 |
| 5/20/04 | 54.84 |
| 5/21/04 | 55.09 |
| 5/24/04 | 54.99 |
| 5/25/04 | 55.49 |
| 5/26/04 | 55.28 |
| 5/27/04 | 55.97 |
| 5/28/04 | 55.73 |
| 6/1/04 | 55.44 |
| 6/2/04 | 56.35 |
| 6/3/04 | 56.6 |
| 6/4/04 | 56.59 |
| 6/7/04 | 57.5 |
| 6/8/04 | 57.68 |
| 6/9/04 | 57.03 |
| 6/10/04 | 57.2 |
| 6/14/04 | 56.38 |
| 6/15/04 | 56.71 |
| 6/16/04 | 56.12 |
| 6/17/04 | 55.85 |
| 6/18/04 | 55.62 |
| 6/21/04 | 54.93 |
| 6/22/04 | 54.06 |
| 6/23/04 | 53.55 |
| 6/24/04 | 53.15 |
| 6/25/04 | 52.51 |
| 6/28/04 | 52.46 |
| 6/29/04 | 51.98 |
| 6/30/04 | 52.5 |
| 7/1/04 | 51.76 |
| 7/2/04 | 51.93 |
| 7/6/04 | 52.08 |
| 7/7/04 | 52.32 |
| 7/8/04 | 52.18 |
| 7/9/04 | 51.76 |
| 7/12/04 | 52.21 |
| 7/13/04 | 53.01 |
| 7/14/04 | 52.58 |
| 7/15/04 | 52.33 |
| 7/16/04 | 52.65 |
| 7/19/04 | 52.86 |
| 7/20/04 | 53.25 |
| 7/21/04 | 53.12 |
| 7/22/04 | 52.91 |
| 7/23/04 | 53.16 |
| 7/26/04 | 52.65 |
| 7/27/04 | 53.9 |
| 7/28/04 | 53.91 |
| 7/29/04 | 53.48 |
| 7/30/04 | 53.01 |
| 8/2/04 | 53.18 |
| 8/3/04 | 52.87 |
| 8/4/04 | 53.2 |
| 8/5/04 | 52.05 |
| 8/6/04 | 51.33 |
| 8/9/04 | 51.37 |
| 8/10/04 | 52.11 |
| 8/11/04 | 51.63 |
| 8/12/04 | 52.65 |
| 8/13/04 | 53.4 |
| 8/16/04 | 54.3 |
| 8/17/04 | 54.97 |
| 8/18/04 | 54.46 |
| 8/19/04 | 54.86 |
| 8/20/04 | 54.65 |
| 8/23/04 | 53.8 |
| 8/24/04 | 53.86 |
| 8/25/04 | 54.1 |
| 8/26/04 | 53.88 |
| 8/27/04 | 53.56 |
| 8/30/04 | 53.2 |
| 8/31/04 | 52.67 |
| 9/1/04 | 52.63 |
| 9/2/04 | 53.12 |
| 9/3/04 | 53.25 |
| 9/7/04 | 53.29 |
| 9/8/04 | 53.08 |
| 9/9/04 | 52.57 |
| 9/10/04 | 53.45 |
| 9/13/04 | 53.35 |
| 9/14/04 | 53.22 |
| 9/15/04 | 52.91 |
| 9/16/04 | 52.77 |
| 9/17/04 | 52.48 |
| 9/20/04 | 52.2 |
| 9/21/04 | 52.26 |
| 9/22/04 | 51.67 |
| 9/23/04 | 52.54 |
| 9/24/04 | 52.81 |
| 9/27/04 | 52.52 |
| 9/28/04 | 52.78 |
| 9/29/04 | 53 |
| 9/30/04 | 53.2 |
| 10/1/04 | 53.13 |
| 10/4/04 | 53.31 |
| 10/5/04 | 53.41 |
| 10/6/04 | 53.98 |
| 10/7/04 | 53.55 |
| 10/8/04 | 52.85 |
| 10/11/04 | 52.9 |
| 10/12/04 | 52.92 |
| 10/13/04 | 52.55 |
| 10/14/04 | 52.1 |
| 10/15/04 | 52.53 |
| 10/18/04 | 52.92 |
| 10/19/04 | 52.68 |
| 10/20/04 | 52.48 |
| 10/21/04 | 52.11 |
| 10/22/04 | 51.99 |
| 10/25/04 | 52.3 |
| 10/26/04 | 52.82 |
| 10/27/04 | 53.72 |
| 10/28/04 | 53.99 |
| 10/29/04 | 53.92 |
| 11/1/04 | 53.85 |
| 11/2/04 | 54.15 |
| 11/3/04 | 54.48 |
| 11/4/04 | 56.26 |
| 11/5/04 | 56.47 |
| 11/8/04 | 56.53 |
| 11/9/04 | 56.32 |
| 11/10/04 | 56.05 |
| 11/11/04 | 56.62 |
| 11/12/04 | 56.85 |
| 11/15/04 | 57.7 |
| 11/16/04 | 56.89 |
| 11/17/04 | 56.24 |
| 11/18/04 | 55.8 |
| 11/19/04 | 55.25 |
| 11/22/04 | 55.68 |
| 11/23/04 | 55.65 |
| 11/24/04 | 55.5 |
| 11/26/04 | 55.32 |
| 11/29/04 | 53.15 |
| 11/30/04 | 52.06 |
| 12/1/04 | 52.82 |
| 12/2/04 | 53 |
| 12/3/04 | 52.93 |
| 12/6/04 | 52.52 |
| 12/7/04 | 52.5 |
| 12/8/04 | 52.51 |
| 12/9/04 | 52.77 |
| 12/10/04 | 52.71 |
| 12/13/04 | 52.95 |
| 12/14/04 | 53.51 |
| 12/15/04 | 53.03 |
| 12/16/04 | 52.75 |
| 12/17/04 | 52.02 |
| 12/20/04 | 52.2 |
| 12/21/04 | 52.6 |
| 12/22/04 | 52.97 |
| 12/23/04 | 52.55 |
| 12/27/04 | 52.79 |
| 12/28/04 | 53.23 |
| 12/29/04 | 53.44 |
| 12/30/04 | 53.06 |
| 12/31/04 | 52.82 |
| 1/3/05 | 53.35 |
| 1/4/05 | 53.22 |
| 1/5/05 | 53.29 |
| 1/6/05 | 54.05 |
| 1/7/05 | 53.99 |
| 1/10/05 | 53.72 |
| 1/11/05 | 53.59 |
| 1/12/05 | 54.08 |
| 1/13/05 | 53.64 |
| 1/14/05 | 53.99 |
| 1/18/05 | 54.49 |
| 1/19/05 | 53.78 |
| 1/20/05 | 53.37 |
| 1/21/05 | 53.01 |
| 1/24/05 | 53.07 |
| 1/25/05 | 53.28 |
| 1/26/05 | 53.28 |
| 1/27/05 | 53.08 |
| 1/28/05 | 52.43 |
| 1/31/05 | 52.4 |
| 2/1/05 | 52.61 |
| 2/2/05 | 53.06 |
| 2/3/05 | 53.42 |
| 2/4/05 | 53.46 |
| 2/7/05 | 53.51 |
| 2/8/05 | 53.2 |
| 2/9/05 | 52.52 |
| 2/10/05 | 52.26 |
| 2/11/05 | 52.1 |
| 2/14/05 | 52.15 |
| 2/15/05 | 52.7 |
| 2/16/05 | 52.6 |
| 2/17/05 | 52.7 |
| 2/18/05 | 52.72 |
| 2/22/05 | 52 |
| 2/23/05 | 51.6 |
| 2/24/05 | 51.46 |
| 2/25/05 | 51.49 |
| 2/28/05 | 51.61 |
| 3/1/05 | 52.04 |
| 3/2/05 | 51.95 |
| 3/3/05 | 52.86 |
| 3/4/05 | 53.1 |
| 3/7/05 | 52.78 |
| 3/8/05 | 52.42 |
| 3/9/05 | 52.45 |
| 3/10/05 | 52.15 |
| 3/11/05 | 51.6 |
| 3/14/05 | 51.3 |
| 3/15/05 | 51.03 |
| 3/16/05 | 51.33 |
| 3/17/05 | 52.33 |
| 3/18/05 | 51.45 |
| 3/21/05 | 51.17 |
| 3/22/05 | 50.9 |
| 3/23/05 | 50.65 |
| 3/24/05 | 50.66 |
| 3/28/05 | 50.99 |
| 3/29/05 | 50.77 |
| 3/30/05 | 50.84 |
| 3/31/05 | 50.11 |
| 4/1/05 | 48.99 |
| 4/4/05 | 49.41 |
| 4/5/05 | 49.67 |
| 4/6/05 | 49.5 |
| 4/7/05 | 48.9 |
| 4/8/05 | 48.57 |
| 4/11/05 | 48.51 |
| 4/12/05 | 48.63 |
| 4/13/05 | 48.57 |
| 4/14/05 | 47.96 |
| 4/15/05 | 47.7 |
| 4/18/05 | 47.88 |
| 4/19/05 | 47.6 |
| 4/20/05 | 47.35 |
| 4/21/05 | 47.78 |
| 4/22/05 | 46.81 |
| 4/25/05 | 47.02 |
| 4/26/05 | 47 |
| 4/27/05 | 47.29 |
| 4/28/05 | 47.05 |
| 4/29/05 | 47.14 |
| 5/2/05 | 47.8 |
| 5/3/05 | 48.4 |
| 5/4/05 | 48.45 |
| 5/5/05 | 48.57 |
| 5/6/05 | 48.96 |
| 5/9/05 | 49.25 |
| 5/10/05 | 48.72 |
| 5/11/05 | 48.6 |
| 5/12/05 | 47.65 |
| 5/13/05 | 47.13 |
| 5/16/05 | 47.22 |
| 5/17/05 | 47 |
| 5/18/05 | 47.58 |
| 5/19/05 | 47.51 |
| 5/20/05 | 47.18 |
| 5/23/05 | 47.85 |
| 5/24/05 | 47.65 |
| 5/25/05 | 47.3 |
| 5/26/05 | 47.31 |
| 5/27/05 | 47.27 |
| 5/31/05 | 47.23 |
| 6/1/05 | 47.92 |
| 6/2/05 | 48.22 |
| 6/3/05 | 47.35 |
| 6/6/05 | 47.73 |
| 6/7/05 | 47.76 |
| 6/8/05 | 47.57 |
| 6/9/05 | 47.82 |
| 6/10/05 | 47.98 |
| 6/13/05 | 48.28 |
| 6/14/05 | 49.68 |
| 6/15/05 | 49.85 |
| 6/16/05 | 49.35 |
| 6/17/05 | 48.93 |
| 6/20/05 | 48.86 |
| 6/21/05 | 48.53 |
| 6/22/05 | 48.79 |
| 6/23/05 | 47.88 |
| 6/24/05 | 47.37 |
| 6/27/05 | 47.52 |
| 6/28/05 | 48.43 |
| 6/29/05 | 48.54 |
| 6/30/05 | 48.2 |
| 7/1/05 | 48.28 |
| 7/5/05 | 49.8 |
| 7/6/05 | 49.38 |
| 7/7/05 | 49.51 |
| 7/8/05 | 49.9 |
| 7/11/05 | 49.8 |
| 7/12/05 | 50.09 |
| 7/13/05 | 50.14 |
| 7/14/05 | 50.51 |
| 7/15/05 | 50.25 |
| 7/18/05 | 49.99 |
| 7/19/05 | 49.76 |
| 7/20/05 | 50 |
| 7/21/05 | 49.39 |
| 7/22/05 | 49.54 |
| 7/25/05 | 49.45 |
| 7/26/05 | 49.53 |
| 7/27/05 | 49.8 |
| 7/28/05 | 49.82 |
| 7/29/05 | 49.35 |
| 8/1/05 | 49.53 |
| 8/2/05 | 49.8 |
| 8/3/05 | 49.68 |
| 8/4/05 | 49.29 |
| 8/5/05 | 49.32 |
| 8/8/05 | 49.15 |
| 8/9/05 | 49.22 |
| 8/10/05 | 48.84 |
| 8/11/05 | 48.95 |
| 8/12/05 | 48.7 |
| 8/15/05 | 49.1 |
| 8/16/05 | 47.57 |
| 8/17/05 | 47.11 |
| 8/18/05 | 47.24 |
| 8/19/05 | 46.58 |
| 8/22/05 | 46.67 |
| 8/23/05 | 46.34 |
| 8/24/05 | 45.55 |
| 8/25/05 | 45.29 |
| 8/26/05 | 45.7 |
| 8/29/05 | 45.65 |
| 8/30/05 | 45.19 |
| 8/31/05 | 44.96 |
| 9/1/05 | 45 |
| 9/2/05 | 44.55 |
| 9/6/05 | 45.69 |
| 9/7/05 | 45.86 |
| 9/8/05 | 45.86 |
| 9/9/05 | 45.89 |
| 9/12/05 | 45.89 |
| 9/13/05 | 45.07 |
| 9/14/05 | 44.7 |
| 9/15/05 | 44.32 |
| 9/16/05 | 43.87 |
| 9/19/05 | 44.01 |
| 9/20/05 | 43.21 |
| 9/21/05 | 42.49 |
| 9/22/05 | 43.19 |
| 9/23/05 | 43.2 |
| 9/26/05 | 43.11 |
| 9/27/05 | 43.1 |
| 9/28/05 | 43.13 |
| 9/29/05 | 43.54 |
| 9/30/05 | 43.82 |
| 10/3/05 | 43.76 |
| 10/4/05 | 43.85 |
| 10/5/05 | 43.5 |
| 10/6/05 | 43.93 |
| 10/7/05 | 44.03 |
| 10/10/05 | 44.54 |
| 10/11/05 | 45.02 |
| 10/12/05 | 44.94 |
| 10/13/05 | 44.76 |
| 10/14/05 | 45.04 |
| 10/17/05 | 45.24 |
| 10/18/05 | 45.13 |
| 10/19/05 | 45.99 |
| 10/20/05 | 45.6 |
| 10/21/05 | 45.72 |
| 10/24/05 | 46.21 |
| 10/25/05 | 45.39 |
| 10/26/05 | 45.58 |
| 10/27/05 | 44.74 |
| 10/28/05 | 45.5 |
| 10/31/05 | 47.31 |
| 11/1/05 | 46.99 |
| 11/2/05 | 47.56 |
| 11/3/05 | 47.45 |
| 11/4/05 | 47.69 |
| 11/7/05 | 48.05 |
| 11/8/05 | 47.61 |
| 11/9/05 | 48.2 |
| 11/10/05 | 49.04 |
| 11/11/05 | 49 |
| 11/14/05 | 49.3 |
| 11/15/05 | 48.78 |
| 11/16/05 | 48.88 |
| 11/17/05 | 49.24 |
| 11/18/05 | 49.5 |
| 11/21/05 | 49.62 |
| 11/22/05 | 50.2 |
| 11/23/05 | 50.57 |
| 11/25/05 | 50.49 |
| 11/28/05 | 50 |
| 11/29/05 | 49.01 |
| 11/30/05 | 48.56 |
| 12/1/05 | 48.03 |
| 12/2/05 | 47.97 |
| 12/5/05 | 47.14 |
| 12/6/05 | 47.62 |
| 12/7/05 | 47.75 |
| 12/8/05 | 47.7 |
| 12/9/05 | 48.08 |
| 12/12/05 | 48.68 |
| 12/13/05 | 49.47 |
| 12/14/05 | 49.51 |
| 12/15/05 | 49.26 |
| 12/16/05 | 49.27 |
| 12/19/05 | 48.96 |
| 12/20/05 | 48.6 |
| 12/21/05 | 48.65 |
| 12/22/05 | 48.6 |
| 12/23/05 | 48.34 |
| 12/27/05 | 47.73 |
| 12/28/05 | 47.84 |
| 12/29/05 | 47.48 |
| 12/30/05 | 46.8 |
| 1/3/06 | 46.23 |
| 1/4/06 | 46.32 |
| 1/5/06 | 45.69 |
| 1/6/06 | 45.88 |
| 1/9/06 | 45.71 |
| 1/10/06 | 45.86 |
| 1/11/06 | 46.57 |
| 1/12/06 | 45.74 |
| 1/13/06 | 45.4 |
| 1/17/06 | 44.95 |
| 1/18/06 | 45.18 |
| 1/19/06 | 45.8 |
| 1/20/06 | 45 |
| 1/23/06 | 45.25 |
| 1/24/06 | 45.72 |
| 1/25/06 | 45.97 |
| 1/26/06 | 46.32 |
| 1/27/06 | 45.84 |
| 1/30/06 | 46.41 |
| 1/31/06 | 46.11 |
| 2/1/06 | 46.14 |
| 2/2/06 | 46.28 |
| 2/3/06 | 45.49 |
| 2/6/06 | 45.08 |
| 2/7/06 | 44.74 |
| 2/8/06 | 45.4 |
| 2/9/06 | 45.7 |
| 2/10/06 | 45.75 |
| 2/13/06 | 45.51 |
| 2/14/06 | 46.45 |
| 2/15/06 | 46.89 |
| 2/16/06 | 46.63 |
| 2/17/06 | 46.1 |
| 2/21/06 | 45.74 |
| 2/22/06 | 45.48 |
| 2/23/06 | 45.7 |
| 2/24/06 | 45.45 |
| 2/27/06 | 45.76 |
| 2/28/06 | 45.36 |
| 3/1/06 | 45.15 |
| 3/2/06 | 45.06 |
| 3/3/06 | 45.33 |
| 3/6/06 | 45.12 |
| 3/7/06 | 45.27 |
| 3/8/06 | 45.27 |
| 3/9/06 | 45.24 |
| 3/10/06 | 45.33 |
| 3/13/06 | 45.27 |
| 3/14/06 | 45.54 |
| 3/15/06 | 45.32 |
| 3/16/06 | 46.36 |
| 3/17/06 | 46.69 |
| 3/20/06 | 47.76 |
| 3/21/06 | 48.11 |
| 3/22/06 | 48.1 |
| 3/23/06 | 48.54 |
| 3/24/06 | 48.19 |
| 3/27/06 | 47.95 |
| 3/28/06 | 47.75 |
| 3/29/06 | 48.05 |
| 3/30/06 | 47.66 |
| 3/31/06 | 47.24 |
| 4/3/06 | 46.77 |
| 4/4/06 | 46.5 |
| 4/5/06 | 46.87 |
| 4/6/06 | 46.56 |
| 4/7/06 | 46.02 |
| 4/10/06 | 45.7 |
| 4/11/06 | 45.5 |
| 4/12/06 | 45.9 |
| 4/13/06 | 45.77 |
| 4/17/06 | 45.82 |
| 4/18/06 | 46.4 |
| 4/19/06 | 46.47 |
| 4/20/06 | 46.4 |
| 4/21/06 | 45.82 |
| 4/24/06 | 45.54 |
| 4/25/06 | 45.63 |
| 4/26/06 | 45.98 |
| 4/27/06 | 45.64 |
| 4/28/06 | 45.03 |
| 5/1/06 | 45.93 |
| 5/2/06 | 46.16 |
| 5/3/06 | 46.69 |
| 5/4/06 | 46.4 |
| 5/5/06 | 47.25 |
| 5/8/06 | 47.57 |
| 5/9/06 | 47.87 |
| 5/10/06 | 47.78 |
| 5/11/06 | 47.25 |
| 5/12/06 | 46.54 |
| 5/15/06 | 47.43 |
| 5/16/06 | 48.07 |
| 5/17/06 | 46.84 |
| 5/18/06 | 47.22 |
| 5/19/06 | 47.32 |
| 5/22/06 | 47.35 |
| 5/23/06 | 47.52 |
| 5/24/06 | 48.03 |
| 5/25/06 | 49.45 |
| 5/26/06 | 49.65 |
| 5/30/06 | 48.3 |
| 5/31/06 | 48.45 |
| 6/1/06 | 48.39 |
| 6/2/06 | 47.83 |
| 6/5/06 | 47.19 |
| 6/6/06 | 47.03 |
| 6/7/06 | 47.04 |
| 6/8/06 | 47.3 |
| 6/9/06 | 47.13 |
| 6/12/06 | 46.99 |
| 6/13/06 | 47.53 |
| 6/14/06 | 47.71 |
| 6/15/06 | 48.66 |
| 6/16/06 | 48.31 |
| 6/19/06 | 48.27 |
| 6/20/06 | 48.43 |
| 6/21/06 | 48.9 |
| 6/22/06 | 48.48 |
| 6/23/06 | 47.94 |
| 6/26/06 | 48.07 |
| 6/27/06 | 47.63 |
| 6/28/06 | 47.92 |
| 6/29/06 | 48.71 |
| 6/30/06 | 48.17 |
| 7/3/06 | 47.57 |
| 7/5/06 | 47.02 |
| 7/6/06 | 46.72 |
| 7/7/06 | 46 |
| 7/10/06 | 46.18 |
| 7/11/06 | 46.13 |
| 7/12/06 | 45.15 |
| 7/13/06 | 44.16 |
| 7/14/06 | 43.05 |
| 7/17/06 | 43.02 |
| 7/18/06 | 43.17 |
| 7/19/06 | 44.2 |
| 7/20/06 | 44.29 |
| 7/21/06 | 43.72 |
| 7/24/06 | 44.43 |
| 7/25/06 | 44.67 |
| 7/26/06 | 43.67 |
| 7/27/06 | 43.53 |
| 7/28/06 | 44.46 |
| 7/31/06 | 44.5 |
| 8/1/06 | 44.09 |
| 8/2/06 | 44.37 |
| 8/3/06 | 44.73 |
| 8/4/06 | 44.87 |
| 8/7/06 | 44.82 |
| 8/8/06 | 44.46 |
| 8/9/06 | 43.9 |
| 8/10/06 | 44.89 |
| 8/11/06 | 44.69 |
| 8/14/06 | 45.1 |
| 8/15/06 | 44.55 |
| 8/16/06 | 44.43 |
| 8/17/06 | 44.63 |
| 8/18/06 | 44.49 |
| 8/21/06 | 44.09 |
| 8/22/06 | 44.07 |
| 8/23/06 | 43.76 |
| 8/24/06 | 43.7 |
| 8/25/06 | 43.88 |
| 8/28/06 | 44.43 |
| 8/29/06 | 44.49 |
| 8/30/06 | 44.62 |
| 8/31/06 | 44.72 |
| 9/1/06 | 45.45 |
| 9/5/06 | 45.57 |
| 9/6/06 | 45.4 |
| 9/7/06 | 45.54 |
| 9/8/06 | 46.72 |
| 9/11/06 | 47.49 |
| 9/12/06 | 48.07 |
| 9/13/06 | 48.08 |
| 9/14/06 | 48.37 |
| 9/15/06 | 48.22 |
| 9/18/06 | 48.1 |
| 9/19/06 | 48.5 |
| 9/20/06 | 48.87 |
| 9/21/06 | 48.46 |
| 9/22/06 | 48.29 |
| 9/25/06 | 48.82 |
| 9/26/06 | 49.25 |
| 9/27/06 | 49.5 |
| 9/28/06 | 49.81 |
| 9/29/06 | 49.32 |
| 10/2/06 | 48.44 |
| 10/3/06 | 49.46 |
| 10/4/06 | 49.55 |
| 10/5/06 | 48.41 |
| 10/6/06 | 48.32 |
| 10/9/06 | 48.22 |
| 10/10/06 | 48.12 |
| 10/11/06 | 48.31 |
| 10/12/06 | 48.32 |
| 10/13/06 | 48.46 |
| 10/16/06 | 48.32 |
| 10/17/06 | 48.28 |
| 10/18/06 | 48.35 |
| 10/19/06 | 48.49 |
| 10/20/06 | 49.37 |
| 10/23/06 | 51.28 |
| 10/24/06 | 51.3 |
| 10/25/06 | 50.85 |
| 10/26/06 | 51.75 |
| 10/27/06 | 50.73 |
| 10/30/06 | 49.53 |
| 10/31/06 | 49.28 |
| 11/1/06 | 48.85 |
| 11/2/06 | 48.29 |
| 11/3/06 | 47.53 |
| 11/6/06 | 47.49 |
| 11/7/06 | 47.65 |
| 11/8/06 | 47.03 |
| 11/9/06 | 46.39 |
| 11/10/06 | 46.47 |
| 11/13/06 | 46.32 |
| 11/14/06 | 47.66 |
| 11/15/06 | 47.68 |
| 11/16/06 | 47.91 |
| 11/17/06 | 47.5 |
| 11/20/06 | 47.72 |
| 11/21/06 | 47.81 |
| 11/22/06 | 48.03 |
| 11/24/06 | 47.9 |
| 11/27/06 | 46.61 |
| 11/28/06 | 46.71 |
| 11/29/06 | 46.89 |
| 11/30/06 | 46.1 |
| 12/1/06 | 45.87 |
| 12/4/06 | 46.29 |
| 12/5/06 | 46.48 |
| 12/6/06 | 46.54 |
| 12/7/06 | 46.37 |
| 12/8/06 | 46.35 |
| 12/11/06 | 46 |
| 12/12/06 | 45.65 |
| 12/13/06 | 45.9 |
| 12/14/06 | 46.52 |
| 12/15/06 | 46.45 |
| 12/18/06 | 46.37 |
| 12/19/06 | 46.09 |
| 12/20/06 | 45.87 |
| 12/21/06 | 45.71 |
| 12/22/06 | 45.54 |
| 12/26/06 | 46.11 |
| 12/27/06 | 46.16 |
| 12/28/06 | 46.01 |
| 12/29/06 | 46.18 |
| 1/3/07 | 47.55 |
| 1/4/07 | 47.78 |
| 1/5/07 | 47.39 |
| 1/8/07 | 47 |
| 1/9/07 | 47.39 |
| 1/10/07 | 47.28 |
| 1/11/07 | 47.6 |
| 1/12/07 | 47.98 |
| 1/16/07 | 48.31 |
| 1/17/07 | 48.2 |
| 1/18/07 | 48.39 |
| 1/19/07 | 48.31 |
| 1/22/07 | 47.96 |
| 1/23/07 | 47.81 |
| 1/24/07 | 48.61 |
| 1/25/07 | 48.15 |
| 1/26/07 | 47.67 |
| 1/29/07 | 47.63 |
| 1/30/07 | 47.28 |
| 1/31/07 | 47.69 |
| 2/1/07 | 47.78 |
| 2/2/07 | 48.08 |
| 2/5/07 | 48.52 |
| 2/6/07 | 48.58 |
| 2/7/07 | 48.58 |
| 2/8/07 | 48.31 |
| 2/9/07 | 47.97 |
| 2/12/07 | 47.74 |
| 2/13/07 | 47.98 |
| 2/14/07 | 47.87 |
| 2/15/07 | 48.36 |
| 2/16/07 | 48.48 |
| 2/20/07 | 50.26 |
| 2/21/07 | 49.97 |
| 2/22/07 | 49.69 |
| 2/23/07 | 49.57 |
| 2/26/07 | 49.98 |
| 2/27/07 | 48.2 |
| 2/28/07 | 48.31 |
| 3/1/07 | 47.89 |
| 3/2/07 | 47.81 |
| 3/5/07 | 47.47 |
| 3/6/07 | 48.04 |
| 3/7/07 | 47.93 |
| 3/8/07 | 47.88 |
| 3/9/07 | 47.42 |
| 3/12/07 | 47.26 |
| 3/13/07 | 46.18 |
| 3/14/07 | 45.73 |
| 3/15/07 | 46 |
| 3/16/07 | 46.21 |
| 3/19/07 | 46.59 |
| 3/20/07 | 47.3 |
| 3/21/07 | 47.77 |
| 3/22/07 | 48.01 |
| 3/23/07 | 47.91 |
| 3/26/07 | 47.84 |
| 3/27/07 | 47.49 |
| 3/28/07 | 46.64 |
| 3/29/07 | 46.72 |
| 3/30/07 | 46.95 |
| 4/2/07 | 47.4 |
| 4/3/07 | 48.1 |
| 4/4/07 | 48.05 |
| 4/5/07 | 48.27 |
| 4/9/07 | 48.47 |
| 4/10/07 | 47.94 |
| 4/11/07 | 47.27 |
| 4/12/07 | 47.26 |
| 4/13/07 | 47.41 |
| 4/16/07 | 48.07 |
| 4/17/07 | 48.17 |
| 4/18/07 | 47.97 |
| 4/19/07 | 48.34 |
| 4/20/07 | 49.76 |
| 4/23/07 | 48.93 |
| 4/24/07 | 48.69 |
| 4/25/07 | 48.81 |
| 4/26/07 | 48.7 |
| 4/27/07 | 48.34 |
| 4/30/07 | 47.92 |
| 5/1/07 | 48.33 |
| 5/2/07 | 48.28 |
| 5/3/07 | 48.36 |
| 5/4/07 | 48.27 |
| 5/7/07 | 48.61 |
| 5/8/07 | 48.1 |
| 5/9/07 | 47.93 |
| 5/10/07 | 47.75 |
| 5/11/07 | 47.78 |
| 5/14/07 | 47.84 |
| 5/15/07 | 47.62 |
| 5/16/07 | 47.18 |
| 5/17/07 | 47.11 |
| 5/18/07 | 47.27 |
| 5/21/07 | 46.62 |
| 5/22/07 | 46.54 |
| 5/23/07 | 46.33 |
| 5/24/07 | 46.65 |
| 5/25/07 | 46.91 |
| 5/29/07 | 46.94 |
| 5/30/07 | 47.12 |
| 5/31/07 | 47.6 |
| 6/1/07 | 49.47 |
| 6/4/07 | 51.21 |
| 6/5/07 | 50.52 |
| 6/6/07 | 50.75 |
| 6/7/07 | 49.76 |
| 6/8/07 | 50.08 |
| 6/11/07 | 49.81 |
| 6/12/07 | 48.91 |
| 6/13/07 | 49.5 |
| 6/14/07 | 49.28 |
| 6/15/07 | 49.34 |
| 6/18/07 | 49.11 |
| 6/19/07 | 48.81 |
| 6/20/07 | 48.59 |
| 6/21/07 | 48.39 |
| 6/22/07 | 47.83 |
| 6/25/07 | 47.82 |
| 6/26/07 | 47.97 |
| 6/27/07 | 48.46 |
| 6/28/07 | 48.21 |
| 6/29/07 | 48.11 |
| 7/2/07 | 48.33 |
| 7/3/07 | 48.47 |
| 7/5/07 | 48.09 |
| 7/6/07 | 48.39 |
| 7/9/07 | 48.5 |
| 7/10/07 | 47.58 |
| 7/11/07 | 47.68 |
| 7/12/07 | 48.83 |
| 7/13/07 | 49.15 |
| 7/16/07 | 48.94 |
| 7/17/07 | 48.35 |
| 7/18/07 | 48.04 |
| 7/19/07 | 48.79 |
| 7/20/07 | 48.06 |
| 7/23/07 | 48.11 |
| 7/24/07 | 48.02 |
| 7/25/07 | 47.87 |
| 7/26/07 | 46.82 |
| 7/27/07 | 45.94 |
| 7/30/07 | 46.21 |
| 7/31/07 | 45.95 |
| 8/1/07 | 46.22 |
| 8/2/07 | 46.73 |
| 8/3/07 | 45.52 |
| 8/6/07 | 47.02 |
| 8/7/07 | 47.06 |
| 8/8/07 | 48.42 |
| 8/9/07 | 46.45 |
| 8/10/07 | 46.07 |
| 8/13/07 | 46.17 |
| 8/14/07 | 43.82 |
| 8/15/07 | 43.28 |
| 8/16/07 | 43.5 |
| 8/17/07 | 43.49 |
| 8/20/07 | 43.59 |
| 8/21/07 | 43.7 |
| 8/22/07 | 43.75 |
| 8/23/07 | 43.17 |
| 8/24/07 | 43.74 |
| 8/27/07 | 43.82 |
| 8/28/07 | 43.4 |
| 8/29/07 | 44.19 |
| 8/30/07 | 43.32 |
| 8/31/07 | 43.63 |
| 9/4/07 | 43.3 |
| 9/5/07 | 42.45 |
| 9/6/07 | 42.76 |
| 9/7/07 | 42.39 |
| 9/10/07 | 42.27 |
| 9/11/07 | 42.94 |
| 9/12/07 | 42.71 |
| 9/13/07 | 43.06 |
| 9/14/07 | 43.32 |
| 9/17/07 | 43.32 |
| 9/18/07 | 44.44 |
| 9/19/07 | 44.75 |
| 9/20/07 | 44.32 |
| 9/21/07 | 44.23 |
| 9/24/07 | 43.97 |
| 9/25/07 | 43.16 |
| 9/26/07 | 43.3 |
| 9/27/07 | 43.61 |
| 9/28/07 | 43.65 |
| 10/1/07 | 44.47 |
| 10/2/07 | 44.87 |
| 10/3/07 | 45.13 |
| 10/4/07 | 45 |
| 10/5/07 | 45.37 |
| 10/8/07 | 45.27 |
| 10/9/07 | 45.21 |
| 10/10/07 | 45.59 |
| 10/11/07 | 46.9 |
| 10/12/07 | 47.06 |
| 10/15/07 | 46.45 |
| 10/16/07 | 45.86 |
| 10/17/07 | 45.99 |
| 10/18/07 | 45.89 |
| 10/19/07 | 44.98 |
| 10/22/07 | 45.25 |
| 10/23/07 | 43.93 |
| 10/24/07 | 43.87 |
| 10/25/07 | 43.88 |
| 10/26/07 | 44.64 |
| 10/29/07 | 45.01 |
| 10/30/07 | 45.37 |
| 10/31/07 | 45.21 |
| 11/1/07 | 44.03 |
| 11/2/07 | 44.19 |
| 11/5/07 | 44.03 |
| 11/6/07 | 44.29 |
| 11/7/07 | 43.93 |
| 11/8/07 | 43.62 |
| 11/9/07 | 42.9 |
| 11/12/07 | 43.32 |
| 11/13/07 | 45.97 |
| 11/14/07 | 46.51 |
| 11/15/07 | 46.2 |
| 11/16/07 | 46.34 |
| 11/19/07 | 45.47 |
| 11/20/07 | 45.5 |
| 11/21/07 | 44.86 |
| 11/23/07 | 45.73 |
| 11/26/07 | 45.03 |
| 11/27/07 | 45.83 |
| 11/28/07 | 47.23 |
| 11/29/07 | 47.54 |
| 11/30/07 | 47.9 |
| 12/3/07 | 47.87 |
| 12/4/07 | 48.19 |
| 12/5/07 | 48.9 |
| 12/6/07 | 49.27 |
| 12/7/07 | 49.02 |
| 12/10/07 | 49.43 |
| 12/11/07 | 49.03 |
| 12/12/07 | 48.23 |
| 12/13/07 | 48.33 |
| 12/14/07 | 47.63 |
| 12/17/07 | 47.83 |
| 12/18/07 | 48.24 |
| 12/19/07 | 48.08 |
| 12/20/07 | 47.85 |
| 12/21/07 | 48.21 |
| 12/24/07 | 48.74 |
| 12/26/07 | 48.38 |
| 12/27/07 | 47.77 |
| 12/28/07 | 48.08 |
| 12/31/07 | 47.53 |
| 1/2/08 | 46.9 |
| 1/3/08 | 46.38 |
| 1/4/08 | 45.72 |
| 1/7/08 | 46.56 |
| 1/8/08 | 45.97 |
| 1/9/08 | 46.9 |
| 1/10/08 | 48.4 |
| 1/11/08 | 47.72 |
| 1/14/08 | 47.67 |
| 1/15/08 | 46.99 |
| 1/16/08 | 47.49 |
| 1/17/08 | 47.48 |
| 1/18/08 | 47.58 |
| 1/22/08 | 49.2 |
| 1/23/08 | 50.16 |
| 1/24/08 | 48.91 |
| 1/25/08 | 48.09 |
| 1/28/08 | 48.71 |
| 1/29/08 | 49.01 |
| 1/30/08 | 49.16 |
| 1/31/08 | 50.74 |
| 2/1/08 | 51.18 |
| 2/4/08 | 50.07 |
| 2/5/08 | 49.56 |
| 2/6/08 | 48.83 |
| 2/7/08 | 49.84 |
| 2/8/08 | 48.76 |
| 2/11/08 | 49.6 |
| 2/12/08 | 50.25 |
| 2/13/08 | 50.66 |
| 2/14/08 | 49.97 |
| 2/15/08 | 49.44 |
| 2/19/08 | 49.66 |
| 2/20/08 | 49.7 |
| 2/21/08 | 49.79 |
| 2/22/08 | 49.97 |
| 2/25/08 | 50.33 |
| 2/26/08 | 51.4 |
| 2/27/08 | 51.43 |
| 2/28/08 | 50.7 |
| 2/29/08 | 49.59 |
| 3/3/08 | 49.89 |
| 3/4/08 | 49.87 |
| 3/5/08 | 49.55 |
| 3/6/08 | 49.98 |
| 3/7/08 | 49.9 |
| 3/10/08 | 48.85 |
| 3/11/08 | 50.25 |
| 3/12/08 | 50.29 |
| 3/13/08 | 50.6 |
| 3/14/08 | 49.82 |
| 3/17/08 | 49.95 |
| 3/18/08 | 50.98 |
| 3/19/08 | 50.78 |
| 3/20/08 | 53.23 |
| 3/24/08 | 53.63 |
| 3/25/08 | 53.05 |
| 3/26/08 | 52.9 |
| 3/27/08 | 52.37 |
| 3/28/08 | 52.12 |
| 3/31/08 | 52.68 |
| 4/1/08 | 54.08 |
| 4/2/08 | 54.46 |
| 4/3/08 | 54.93 |
| 4/4/08 | 54.4 |
| 4/7/08 | 54.23 |
| 4/8/08 | 54.45 |
| 4/9/08 | 54.14 |
| 4/10/08 | 54.66 |
| 4/11/08 | 54.8 |
| 4/14/08 | 55.15 |
| 4/15/08 | 56.27 |
| 4/16/08 | 57.07 |
| 4/17/08 | 56.67 |
| 4/18/08 | 56.31 |
| 4/21/08 | 56.38 |
| 4/22/08 | 56.55 |
| 4/23/08 | 56.92 |
| 4/24/08 | 57.45 |
| 4/25/08 | 57.65 |
| 4/28/08 | 57.35 |
| 4/29/08 | 58.61 |
| 4/30/08 | 57.98 |
| 5/1/08 | 58.07 |
| 5/2/08 | 57.5 |
| 5/5/08 | 56.97 |
| 5/6/08 | 56.35 |
| 5/7/08 | 56.83 |
| 5/8/08 | 57.16 |
| 5/9/08 | 57.18 |
| 5/12/08 | 58.02 |
| 5/13/08 | 56.65 |
| 5/14/08 | 57.45 |
| 5/15/08 | 57.12 |
| 5/16/08 | 57.04 |
| 5/19/08 | 56.4 |
| 5/20/08 | 55.95 |
| 5/21/08 | 55.23 |
| 5/22/08 | 56.05 |
| 5/23/08 | 55.75 |
| 5/27/08 | 56.4 |
| 5/28/08 | 57.09 |
| 5/29/08 | 57.94 |
| 5/30/08 | 57.74 |
| 6/2/08 | 57.2 |
| 6/3/08 | 57.77 |
| 6/4/08 | 57.68 |
| 6/5/08 | 59.8 |
| 6/6/08 | 58.37 |
| 6/9/08 | 59.57 |
| 6/10/08 | 59.78 |
| 6/11/08 | 58.52 |
| 6/12/08 | 59.11 |
| 6/13/08 | 59.18 |
| 6/16/08 | 59.31 |
| 6/17/08 | 58.69 |
| 6/18/08 | 57.67 |
| 6/19/08 | 57.69 |
| 6/20/08 | 56.26 |
| 6/23/08 | 56.64 |
| 6/24/08 | 57.32 |
| 6/25/08 | 58.12 |
| 6/26/08 | 56.83 |
| 6/27/08 | 56.3 |
| 6/30/08 | 56.2 |
| 7/1/08 | 57.03 |
| 7/2/08 | 56.5 |
| 7/3/08 | 56.6 |
| 7/7/08 | 56.91 |
| 7/8/08 | 59.11 |
| 7/9/08 | 57.67 |
| 7/10/08 | 57.21 |
| 7/11/08 | 56.29 |
| 7/14/08 | 56.31 |
| 7/15/08 | 56.24 |
| 7/16/08 | 56.96 |
| 7/17/08 | 57.68 |
| 7/18/08 | 57.92 |
| 7/21/08 | 57.31 |
| 7/22/08 | 59.06 |
| 7/23/08 | 58.09 |
| 7/24/08 | 56.97 |
| 7/25/08 | 56.83 |
| 7/28/08 | 56.02 |
| 7/29/08 | 57.45 |
| 7/30/08 | 58.56 |
| 7/31/08 | 58.62 |
| 8/1/08 | 57.75 |
| 8/4/08 | 58.43 |
| 8/5/08 | 60.34 |
| 8/6/08 | 60.76 |
| 8/7/08 | 56.96 |
| 8/8/08 | 57.86 |
| 8/11/08 | 58.56 |
| 8/12/08 | 59.25 |
| 8/13/08 | 57.88 |
| 8/14/08 | 58.1 |
| 8/15/08 | 59.37 |
| 8/18/08 | 58.83 |
| 8/19/08 | 58.2 |
| 8/20/08 | 58.36 |
| 8/21/08 | 58.5 |
| 8/22/08 | 59.44 |
| 8/25/08 | 58.55 |
| 8/26/08 | 59 |
| 8/27/08 | 59.29 |
| 8/28/08 | 59.88 |
| 8/29/08 | 59.07 |
| 9/2/08 | 59.65 |
| 9/3/08 | 59.79 |
| 9/4/08 | 59.78 |
| 9/5/08 | 60.74 |
| 9/8/08 | 62 |
| 9/9/08 | 61.13 |
| 9/10/08 | 62.02 |
| 9/11/08 | 63.17 |
| 9/12/08 | 62.41 |
| 9/15/08 | 61.63 |
| 9/16/08 | 62.14 |
| 9/17/08 | 59.64 |
| 9/18/08 | 61.48 |
| 9/19/08 | 59.7 |
| 9/22/08 | 58.89 |
| 9/23/08 | 58.4 |
| 9/24/08 | 58.92 |
| 9/25/08 | 60.12 |
| 9/26/08 | 60.71 |
| 9/29/08 | 58.45 |
| 9/30/08 | 59.89 |
| 10/1/08 | 59.66 |
| 10/2/08 | 58.85 |
| 10/3/08 | 59.73 |
| 10/6/08 | 57.9 |
| 10/7/08 | 54.84 |
| 10/8/08 | 54.55 |
| 10/9/08 | 51.39 |
| 10/10/08 | 50.95 |
| 10/13/08 | 54.5 |
| 10/14/08 | 54.44 |
| 10/15/08 | 50.05 |
| 10/16/08 | 54.62 |
| 10/17/08 | 53.77 |
| 10/20/08 | 54.43 |
| 10/21/08 | 53.67 |
| 10/22/08 | 52.27 |
| 10/23/08 | 52.76 |
| 10/24/08 | 51.4 |
| 10/27/08 | 49.67 |
| 10/28/08 | 55.17 |
| 10/29/08 | 55.02 |
| 10/30/08 | 54.75 |
| 10/31/08 | 55.81 |
| 11/3/08 | 55.97 |
| 11/4/08 | 56.13 |
| 11/5/08 | 54.13 |
| 11/6/08 | 53.49 |
| 11/7/08 | 54.39 |
| 11/10/08 | 55.18 |
| 11/11/08 | 54.75 |
| 11/12/08 | 52.62 |
| 11/13/08 | 54.93 |
| 11/14/08 | 52.71 |
| 11/17/08 | 51.81 |
| 11/18/08 | 52.72 |
| 11/19/08 | 51 |
| 11/20/08 | 50.66 |
| 11/21/08 | 52.92 |
| 11/24/08 | 52.77 |
| 11/25/08 | 54.68 |
| 11/26/08 | 56.69 |
| 11/28/08 | 55.88 |
| 12/1/08 | 53.01 |
| 12/2/08 | 53.45 |
| 12/3/08 | 54.38 |
| 12/4/08 | 55.11 |
| 12/5/08 | 58.21 |
| 12/8/08 | 57.56 |
| 12/9/08 | 55.81 |
| 12/10/08 | 55.25 |
| 12/11/08 | 54.79 |
| 12/12/08 | 54.63 |
| 12/15/08 | 54.71 |
| 12/16/08 | 55.24 |
| 12/17/08 | 55.19 |
| 12/18/08 | 55.41 |
| 12/19/08 | 55.74 |
| 12/22/08 | 55.99 |
| 12/23/08 | 55.29 |
| 12/24/08 | 55.44 |
| 12/26/08 | 55.35 |
| 12/29/08 | 55.11 |
| 12/30/08 | 55.05 |
| 12/31/08 | 56.06 |
| 1/2/09 | 57.18 |
| 1/5/09 | 56.52 |
| 1/6/09 | 56.02 |
| 1/7/09 | 55.54 |
| 1/8/09 | 51.38 |
| 1/9/09 | 51.58 |
| 1/12/09 | 51.39 |
| 1/13/09 | 52.12 |
| 1/14/09 | 51.56 |
| 1/15/09 | 51.35 |
| 1/16/09 | 51.56 |
| 1/20/09 | 50.56 |
| 1/21/09 | 49.14 |
| 1/22/09 | 48.87 |
| 1/23/09 | 48.35 |
| 1/26/09 | 48.6 |
| 1/27/09 | 48.79 |
| 1/28/09 | 48.73 |
| 1/29/09 | 47.86 |
| 1/30/09 | 47.12 |
| 2/2/09 | 46.57 |
| 2/3/09 | 47.81 |
| 2/4/09 | 46.42 |
| 2/5/09 | 48.56 |
| 2/6/09 | 49.63 |
| 2/9/09 | 49.28 |
| 2/10/09 | 47.72 |
| 2/11/09 | 48.23 |
| 2/12/09 | 48.13 |
| 2/13/09 | 46.53 |
| 2/17/09 | 48.24 |
| 2/18/09 | 50 |
| 2/19/09 | 50.45 |
| 2/20/09 | 50.02 |
| 2/23/09 | 48.88 |
| 2/24/09 | 50.01 |
| 2/25/09 | 49.21 |
| 2/26/09 | 48.25 |
| 2/27/09 | 49.24 |
| 3/2/09 | 48.04 |
| 3/3/09 | 47.38 |
| 3/4/09 | 48.49 |
| 3/5/09 | 49.75 |
| 3/6/09 | 48.91 |
| 3/9/09 | 47.51 |
| 3/10/09 | 48.67 |
| 3/11/09 | 47.46 |
| 3/12/09 | 48.94 |
| 3/13/09 | 49.19 |
| 3/16/09 | 48.8 |
| 3/17/09 | 50 |
| 3/18/09 | 50.44 |
| 3/19/09 | 49.95 |
| 3/20/09 | 49.59 |
| 3/23/09 | 51.48 |
| 3/24/09 | 51.08 |
| 3/25/09 | 51.68 |
| 3/26/09 | 52.76 |
| 3/27/09 | 52.57 |
| 3/30/09 | 51.76 |
| 3/31/09 | 52.1 |
| 4/1/09 | 52.82 |
| 4/2/09 | 53.64 |
| 4/3/09 | 53.8 |
| 4/6/09 | 53.43 |
| 4/7/09 | 52.39 |
| 4/8/09 | 52.61 |
| 4/9/09 | 50.66 |
| 4/13/09 | 51.53 |
| 4/14/09 | 51.12 |
| 4/15/09 | 51.29 |
| 4/16/09 | 50.78 |
| 4/17/09 | 50.2 |
| 4/20/09 | 49.27 |
| 4/21/09 | 49.83 |
| 4/22/09 | 48.96 |
| 4/23/09 | 48.86 |
| 4/24/09 | 47.87 |
| 4/27/09 | 48.51 |
| 4/28/09 | 48.47 |
| 4/29/09 | 50.45 |
| 4/30/09 | 50.4 |
| 5/1/09 | 50.05 |
| 5/4/09 | 50.84 |
| 5/5/09 | 50.46 |
| 5/6/09 | 49.51 |
| 5/7/09 | 49.89 |
| 5/8/09 | 50.14 |
| 5/11/09 | 50.63 |
| 5/12/09 | 50.9 |
| 5/13/09 | 50.03 |
| 5/14/09 | 49.1 |
| 5/15/09 | 48.15 |
| 5/18/09 | 49.92 |
| 5/19/09 | 49.36 |
| 5/20/09 | 48.94 |
| 5/21/09 | 49.11 |
| 5/22/09 | 49.25 |
| 5/26/09 | 50 |
| 5/27/09 | 49.32 |
| 5/28/09 | 49.55 |
| 5/29/09 | 49.74 |
| 6/1/09 | 50.59 |
| 6/2/09 | 49.93 |
| 6/3/09 | 50.88 |
| 6/4/09 | 50.87 |
| 6/5/09 | 51.07 |
| 6/8/09 | 50.81 |
| 6/9/09 | 50.61 |
| 6/10/09 | 50.06 |
| 6/11/09 | 49.32 |
| 6/12/09 | 49.84 |
| 6/15/09 | 48.46 |
| 6/16/09 | 48.25 |
| 6/17/09 | 48.56 |
| 6/18/09 | 48.68 |
| 6/19/09 | 48.17 |
| 6/22/09 | 48.59 |
| 6/23/09 | 48.35 |
| 6/24/09 | 48.51 |
| 6/25/09 | 49.15 |
| 6/26/09 | 48.63 |
| 6/29/09 | 48.76 |
| 6/30/09 | 48.44 |
| 7/1/09 | 48.37 |
| 7/2/09 | 47.79 |
| 7/6/09 | 47.73 |
| 7/7/09 | 47.84 |
| 7/8/09 | 48.37 |
| 7/9/09 | 48.08 |
| 7/10/09 | 47.57 |
| 7/13/09 | 47.83 |
| 7/14/09 | 48.13 |
| 7/15/09 | 48.55 |
| 7/16/09 | 48.51 |
| 7/17/09 | 48.49 |
| 7/20/09 | 48.82 |
| 7/21/09 | 48.86 |
| 7/22/09 | 49.17 |
| 7/23/09 | 48.76 |
| 7/24/09 | 48.94 |
| 7/27/09 | 48.97 |
| 7/28/09 | 48.92 |
| 7/29/09 | 49.37 |
| 7/30/09 | 49.98 |
| 7/31/09 | 49.88 |
| 8/3/09 | 49.84 |
| 8/4/09 | 49.85 |
| 8/5/09 | 49.2 |
| 8/6/09 | 48.98 |
| 8/7/09 | 49.29 |
| 8/10/09 | 49.72 |
| 8/11/09 | 50.04 |
| 8/12/09 | 50.51 |
| 8/13/09 | 51.88 |
| 8/14/09 | 51.79 |
| 8/17/09 | 51.57 |
| 8/18/09 | 51.36 |
| 8/19/09 | 51.67 |
| 8/20/09 | 51.71 |
| 8/21/09 | 51.36 |
| 8/24/09 | 51.55 |
| 8/25/09 | 51.67 |
| 8/26/09 | 51.8 |
| 8/27/09 | 51.24 |
| 8/28/09 | 51.13 |
| 8/31/09 | 50.87 |
| 9/1/09 | 50.97 |
| 9/2/09 | 50.92 |
| 9/3/09 | 51.74 |
| 9/4/09 | 51.68 |
| 9/8/09 | 51.4 |
| 9/9/09 | 51.11 |
| 9/10/09 | 51.03 |
| 9/11/09 | 50.72 |
| 9/14/09 | 50.38 |
| 9/15/09 | 49.93 |
| 9/16/09 | 50.04 |
| 9/17/09 | 49.96 |
| 9/18/09 | 50.11 |
| 9/21/09 | 50.91 |
| 9/22/09 | 50.99 |
| 9/23/09 | 50.4 |
| 9/24/09 | 50.7 |
| 9/25/09 | 49.47 |
| 9/28/09 | 49.5 |
| 9/29/09 | 49.23 |
| 9/30/09 | 49.09 |
| 10/1/09 | 49 |
| 10/2/09 | 49.08 |
| 10/5/09 | 49.06 |
| 10/6/09 | 49.48 |
| 10/7/09 | 49.49 |
| 10/8/09 | 49.74 |
| 10/9/09 | 49.97 |
| 10/12/09 | 49.61 |
| 10/13/09 | 50.34 |
| 10/14/09 | 50.19 |
| 10/15/09 | 50.95 |
| 10/16/09 | 51.22 |
| 10/19/09 | 51.89 |
| 10/20/09 | 51.7 |
| 10/21/09 | 50.63 |
| 10/22/09 | 50.48 |
| 10/23/09 | 50.44 |
| 10/26/09 | 49.84 |
| 10/27/09 | 49.87 |
| 10/28/09 | 49.9 |
| 10/29/09 | 50.4 |
| 10/30/09 | 49.68 |
| 11/2/09 | 50.28 |
| 11/3/09 | 49.9 |
| 11/4/09 | 50.38 |
| 11/5/09 | 51.28 |
| 11/6/09 | 51.25 |
| 11/9/09 | 52 |
| 11/10/09 | 52.31 |
| 11/11/09 | 52.97 |
| 11/12/09 | 53.24 |
| 11/13/09 | 53.2 |
| 11/16/09 | 53.16 |
| 11/17/09 | 53.66 |
| 11/18/09 | 54.15 |
| 11/19/09 | 54.54 |
| 11/20/09 | 54.28 |
| 11/23/09 | 54.68 |
| 11/24/09 | 54.85 |
| 11/25/09 | 54.96 |
| 11/27/09 | 54.63 |
| 11/30/09 | 54.55 |
| 12/1/09 | 54.75 |
| 12/2/09 | 54.57 |
| 12/3/09 | 54.44 |
| 12/4/09 | 54.24 |
| 12/7/09 | 54.93 |
| 12/8/09 | 54.41 |
| 12/9/09 | 54.07 |
| 12/10/09 | 54.69 |
| 12/11/09 | 54.65 |
| 12/14/09 | 54.07 |
| 12/15/09 | 53.98 |
| 12/16/09 | 53.32 |
| 12/17/09 | 52.76 |
| 12/18/09 | 52.85 |
| 12/21/09 | 53.4 |
| 12/22/09 | 53.34 |
| 12/23/09 | 53.32 |
| 12/24/09 | 53.6 |
| 12/28/09 | 53.98 |
| 12/29/09 | 54.11 |
| 12/30/09 | 54.3 |
| 12/31/09 | 53.45 |
| 1/4/10 | 54.23 |
| 1/5/10 | 53.69 |
| 1/6/10 | 53.57 |
| 1/7/10 | 53.6 |
| 1/8/10 | 53.33 |
| 1/11/10 | 54.21 |
| 1/12/10 | 54.73 |
| 1/13/10 | 55.01 |
| 1/14/10 | 54.21 |
| 1/15/10 | 53.68 |
| 1/19/10 | 54.03 |
| 1/20/10 | 53.86 |
| 1/21/10 | 52.92 |
| 1/22/10 | 52.94 |
| 1/25/10 | 52.88 |
| 1/26/10 | 53.61 |
| 1/27/10 | 53.4 |
| 1/28/10 | 52.61 |
| 1/29/10 | 53.43 |
| 2/1/10 | 53.48 |
| 2/2/10 | 53.49 |
| 2/3/10 | 54.27 |
| 2/4/10 | 52.97 |
| 2/5/10 | 53.45 |
| 2/8/10 | 52.93 |
| 2/9/10 | 53.25 |
| 2/10/10 | 53.24 |
| 2/11/10 | 53.08 |
| 2/12/10 | 52.9 |
| 2/16/10 | 53.56 |
| 2/17/10 | 54.06 |
| 2/18/10 | 53.47 |
| 2/19/10 | 53.49 |
| 2/22/10 | 53.83 |
| 2/23/10 | 53.62 |
| 2/24/10 | 53.92 |
| 2/25/10 | 54.15 |
| 2/26/10 | 54.07 |
| 3/1/10 | 53.9 |
| 3/2/10 | 53.59 |
| 3/3/10 | 53.66 |
| 3/4/10 | 53.96 |
| 3/5/10 | 54.14 |
| 3/8/10 | 54.15 |
| 3/9/10 | 54.06 |
| 3/10/10 | 53.63 |
| 3/11/10 | 53.97 |
| 3/12/10 | 53.9 |
| 3/15/10 | 55.42 |
| 3/16/10 | 55.99 |
| 3/17/10 | 55.92 |
| 3/18/10 | 55.94 |
| 3/19/10 | 55.34 |
| 3/22/10 | 55.62 |
| 3/23/10 | 55.89 |
| 3/24/10 | 55.58 |
| 3/25/10 | 55.61 |
| 3/26/10 | 55.51 |
| 3/29/10 | 55.74 |
| 3/30/10 | 55.91 |
| 3/31/10 | 55.6 |
| 4/1/10 | 55.49 |
| 4/5/10 | 55.49 |
| 4/6/10 | 55.53 |
| 4/7/10 | 55.28 |
| 4/8/10 | 55.38 |
| 4/9/10 | 55.07 |
| 4/12/10 | 55.02 |
| 4/13/10 | 54.72 |
| 4/14/10 | 54.64 |
| 4/15/10 | 54.13 |
| 4/16/10 | 54.11 |
| 4/19/10 | 54.39 |
| 4/20/10 | 54.52 |
| 4/21/10 | 54.47 |
| 4/22/10 | 54.49 |
| 4/23/10 | 54.53 |
| 4/26/10 | 54.04 |
| 4/27/10 | 54.04 |
| 4/28/10 | 53.61 |
| 4/29/10 | 53.7 |
| 4/30/10 | 53.64 |
| 5/3/10 | 53.74 |
| 5/4/10 | 54.02 |
| 5/5/10 | 54.77 |
| 5/6/10 | 53.23 |
| 5/7/10 | 52.4 |
| 5/10/10 | 52.58 |
| 5/11/10 | 52.46 |
| 5/12/10 | 52.48 |
| 5/13/10 | 52.4 |
| 5/14/10 | 52.12 |
| 5/17/10 | 52.73 |
| 5/18/10 | 53.71 |
| 5/19/10 | 53.04 |
| 5/20/10 | 51.3 |
| 5/21/10 | 51.37 |
| 5/24/10 | 51 |
| 5/25/10 | 50.28 |
| 5/26/10 | 50.02 |
| 5/27/10 | 50.7 |
| 5/28/10 | 50.56 |
| 6/1/10 | 50.92 |
| 6/2/10 | 51.72 |
| 6/3/10 | 51.72 |
| 6/4/10 | 50.4 |
| 6/7/10 | 50.74 |
| 6/8/10 | 50.78 |
| 6/9/10 | 50.99 |
| 6/10/10 | 51.22 |
| 6/11/10 | 50.86 |
| 6/14/10 | 51.24 |
| 6/15/10 | 51.64 |
| 6/16/10 | 50.98 |
| 6/17/10 | 51.41 |
| 6/18/10 | 51.55 |
| 6/21/10 | 51.02 |
| 6/22/10 | 50.68 |
| 6/23/10 | 50.81 |
| 6/24/10 | 50.03 |
| 6/25/10 | 48.8 |
| 6/28/10 | 49.57 |
| 6/29/10 | 48.9 |
| 6/30/10 | 48.07 |
| 7/1/10 | 48.34 |
| 7/2/10 | 48 |
| 7/6/10 | 48.57 |
| 7/7/10 | 48.92 |
| 7/8/10 | 49.18 |
| 7/9/10 | 49.43 |
| 7/12/10 | 50.12 |
| 7/13/10 | 50.54 |
| 7/14/10 | 50.35 |
| 7/15/10 | 50.41 |
| 7/16/10 | 49.67 |
| 7/19/10 | 49.52 |
| 7/20/10 | 50.88 |
| 7/21/10 | 50.35 |
| 7/22/10 | 50.86 |
| 7/23/10 | 51.67 |
| 7/26/10 | 51.13 |
| 7/27/10 | 50.96 |
| 7/28/10 | 51.13 |
| 7/29/10 | 51.06 |
| 7/30/10 | 51.19 |
| 8/2/10 | 51.41 |
| 8/3/10 | 51.29 |
| 8/4/10 | 51.6 |
| 8/5/10 | 51.62 |
| 8/6/10 | 51.79 |
| 8/9/10 | 52.06 |
| 8/10/10 | 52.22 |
| 8/11/10 | 51.02 |
| 8/12/10 | 50.43 |
| 8/13/10 | 50.4 |
| 8/16/10 | 50.41 |
| 8/17/10 | 51.02 |
| 8/18/10 | 50.86 |
| 8/19/10 | 50.06 |
| 8/20/10 | 50.22 |
| 8/23/10 | 51.14 |
| 8/24/10 | 51.3 |
| 8/25/10 | 51.55 |
| 8/26/10 | 50.97 |
| 8/27/10 | 51 |
| 8/30/10 | 50.55 |
| 8/31/10 | 50.14 |
| 9/1/10 | 51.2 |
| 9/2/10 | 51.76 |
| 9/3/10 | 52.04 |
| 9/7/10 | 51.86 |
| 9/8/10 | 51.83 |
| 9/9/10 | 51.91 |
| 9/10/10 | 51.97 |
| 9/13/10 | 52.21 |
| 9/14/10 | 52.66 |
| 9/15/10 | 52.86 |
| 9/16/10 | 53.15 |
| 9/17/10 | 53.01 |
| 9/20/10 | 53.54 |
| 9/21/10 | 53.57 |
| 9/22/10 | 53.82 |
| 9/23/10 | 53.65 |
| 9/24/10 | 54.08 |
| 9/27/10 | 53.48 |
| 9/28/10 | 53.82 |
| 9/29/10 | 53.35 |
| 9/30/10 | 53.52 |
| 10/1/10 | 53.36 |
| 10/4/10 | 53.57 |
| 10/5/10 | 54 |
| 10/6/10 | 54.56 |
| 10/7/10 | 54.36 |
| 10/8/10 | 54.41 |
| 10/11/10 | 54.61 |
| 10/12/10 | 53.92 |
| 10/13/10 | 53.82 |
| 10/14/10 | 53.25 |
| 10/15/10 | 53.35 |
| 10/18/10 | 53.76 |
| 10/19/10 | 53.32 |
| 10/20/10 | 53.47 |
| 10/21/10 | 54.03 |
| 10/22/10 | 54.06 |
| 10/25/10 | 53.95 |
| 10/26/10 | 54.56 |
| 10/27/10 | 53.87 |
| 10/28/10 | 54.08 |
| 10/29/10 | 54.17 |
| 11/1/10 | 54.31 |
| 11/2/10 | 54.79 |
| 11/3/10 | 54.91 |
| 11/4/10 | 55.36 |
| 11/5/10 | 55.2 |
| 11/8/10 | 54.91 |
| 11/9/10 | 55.05 |
| 11/10/10 | 54.51 |
| 11/11/10 | 54.34 |
| 11/12/10 | 54.13 |
| 11/15/10 | 53.95 |
| 11/16/10 | 54.26 |
| 11/17/10 | 53.77 |
| 11/18/10 | 53.98 |
| 11/19/10 | 54.39 |
| 11/22/10 | 54.38 |
| 11/23/10 | 53.67 |
| 11/24/10 | 54.01 |
| 11/26/10 | 53.74 |
| 11/29/10 | 53.85 |
| 11/30/10 | 54.09 |
| 12/1/10 | 54.7 |
| 12/2/10 | 54.75 |
| 12/3/10 | 54.62 |
| 12/6/10 | 54.49 |
| 12/7/10 | 55.09 |
| 12/8/10 | 54.49 |
| 12/9/10 | 54.34 |
| 12/10/10 | 54.28 |
| 12/13/10 | 54.21 |
| 12/14/10 | 54.45 |
| 12/15/10 | 54.23 |
| 12/16/10 | 54.63 |
| 12/17/10 | 54.41 |
| 12/20/10 | 53.77 |
| 12/21/10 | 53.65 |
| 12/22/10 | 53.31 |
| 12/23/10 | 53.6 |
| 12/27/10 | 53.57 |
| 12/28/10 | 53.74 |
| 12/29/10 | 54.08 |
| 12/30/10 | 54.07 |
| 12/31/10 | 53.93 |
| 1/3/11 | 54.56 |
| 1/4/11 | 54.77 |
| 1/5/11 | 54.41 |
| 1/6/11 | 53.96 |
| 1/7/11 | 54.08 |
| 1/10/11 | 53.73 |
| 1/11/11 | 54.29 |
| 1/12/11 | 54.85 |
| 1/13/11 | 54.79 |
| 1/14/11 | 54.81 |
| 1/18/11 | 55.14 |
| 1/19/11 | 55.03 |
| 1/20/11 | 55.99 |
| 1/21/11 | 55.73 |
| 1/24/11 | 56.05 |
| 1/25/11 | 57.26 |
| 1/26/11 | 57.32 |
| 1/27/11 | 57.57 |
| 1/28/11 | 56.7 |
| 1/31/11 | 56.07 |
| 2/1/11 | 56.33 |
| 2/2/11 | 55.86 |
| 2/3/11 | 55.92 |
| 2/4/11 | 56.03 |
| 2/7/11 | 56.07 |
| 2/8/11 | 56.38 |
| 2/9/11 | 56.73 |
| 2/10/11 | 55.59 |
| 2/11/11 | 55.69 |
| 2/14/11 | 54.8 |
| 2/15/11 | 54.95 |
| 2/16/11 | 54.55 |
| 2/17/11 | 54.75 |
| 2/18/11 | 55.38 |
| 2/22/11 | 53.67 |
| 2/23/11 | 53.03 |
| 2/24/11 | 52.09 |
| 2/25/11 | 51.75 |
| 2/28/11 | 51.98 |
| 3/1/11 | 52.07 |
| 3/2/11 | 51.97 |
| 3/3/11 | 52.01 |
| 3/4/11 | 52.07 |
| 3/7/11 | 52.02 |
| 3/8/11 | 52.44 |
| 3/9/11 | 52.67 |
| 3/10/11 | 52.65 |
| 3/11/11 | 52.59 |
| 3/14/11 | 52.32 |
| 3/15/11 | 52.06 |
| 3/16/11 | 51.38 |
| 3/17/11 | 51.37 |
| 3/18/11 | 51.52 |
| 3/21/11 | 51.92 |
| 3/22/11 | 52 |
| 3/23/11 | 51.64 |
| 3/24/11 | 52.59 |
| 3/25/11 | 52.35 |
| 3/28/11 | 52.19 |
| 3/29/11 | 52.26 |
| 3/30/11 | 52.36 |
| 3/31/11 | 52.05 |
| 4/1/11 | 52.13 |
| 4/4/11 | 52.65 |
| 4/5/11 | 52.74 |
| 4/6/11 | 52.98 |
| 4/7/11 | 53 |
| 4/8/11 | 52.54 |
| 4/11/11 | 52.82 |
| 4/12/11 | 53.52 |
| 4/13/11 | 53.63 |
| 4/14/11 | 53.5 |
| 4/15/11 | 53.55 |
| 4/18/11 | 53.31 |
| 4/19/11 | 53.35 |
| 4/20/11 | 53.69 |
| 4/21/11 | 53.58 |
| 4/25/11 | 53.37 |
| 4/26/11 | 53.91 |
| 4/27/11 | 54.42 |
| 4/28/11 | 54.69 |
| 4/29/11 | 54.98 |
| 5/2/11 | 55.04 |
| 5/3/11 | 55.46 |
| 5/4/11 | 55.37 |
| 5/5/11 | 55.07 |
| 5/6/11 | 55.02 |
| 5/9/11 | 55.1 |
| 5/10/11 | 55.53 |
| 5/11/11 | 55.17 |
| 5/12/11 | 55.72 |
| 5/13/11 | 55.72 |
| 5/16/11 | 56.06 |
| 5/17/11 | 55.54 |
| 5/18/11 | 55.18 |
| 5/19/11 | 55.48 |
| 5/20/11 | 55.29 |
| 5/23/11 | 55.22 |
| 5/24/11 | 54.78 |
| 5/25/11 | 54.56 |
| 5/26/11 | 54.62 |
| 5/27/11 | 54.7 |
| 5/31/11 | 55.22 |
| 6/1/11 | 54.3 |
| 6/2/11 | 53.55 |
| 6/3/11 | 53.66 |
| 6/6/11 | 53.76 |
| 6/7/11 | 53.83 |
| 6/8/11 | 53.69 |
| 6/9/11 | 53.62 |
| 6/10/11 | 52.72 |
| 6/13/11 | 52.62 |
| 6/14/11 | 52.91 |
| 6/15/11 | 52.32 |
| 6/16/11 | 52.83 |
| 6/17/11 | 52.82 |
| 6/20/11 | 53.04 |
| 6/21/11 | 53.29 |
| 6/22/11 | 53.01 |
| 6/23/11 | 53.29 |
| 6/24/11 | 52.41 |
| 6/27/11 | 52.29 |
| 6/28/11 | 52.53 |
| 6/29/11 | 52.64 |
| 6/30/11 | 53.14 |
| 7/1/11 | 53.51 |
| 7/5/11 | 53.39 |
| 7/6/11 | 53.72 |
| 7/7/11 | 54.49 |
| 7/8/11 | 54.08 |
| 7/11/11 | 53.87 |
| 7/12/11 | 53.94 |
| 7/13/11 | 54.02 |
| 7/14/11 | 53.63 |
| 7/15/11 | 53.63 |
| 7/18/11 | 53.32 |
| 7/19/11 | 53.97 |
| 7/20/11 | 53.89 |
| 7/21/11 | 54.47 |
| 7/22/11 | 54.52 |
| 7/25/11 | 53.97 |
| 7/26/11 | 53.59 |
| 7/27/11 | 53.25 |
| 7/28/11 | 52.99 |
| 7/29/11 | 52.71 |
| 8/1/11 | 52.62 |
| 8/2/11 | 51.68 |
| 8/3/11 | 51.28 |
| 8/4/11 | 50.1 |
| 8/5/11 | 50.85 |
| 8/8/11 | 48.92 |
| 8/9/11 | 50.82 |
| 8/10/11 | 48.41 |
| 8/11/11 | 49.73 |
| 8/12/11 | 49.75 |
| 8/15/11 | 49.98 |
| 8/16/11 | 51.92 |
| 8/17/11 | 51.55 |
| 8/18/11 | 51.79 |
| 8/19/11 | 52.3 |
| 8/22/11 | 52.19 |
| 8/23/11 | 53.21 |
| 8/24/11 | 53.37 |
| 8/25/11 | 52.7 |
| 8/26/11 | 52.9 |
| 8/29/11 | 53.19 |
| 8/30/11 | 52.82 |
| 8/31/11 | 53.19 |
| 9/1/11 | 52.65 |
| 9/2/11 | 52.03 |
| 9/6/11 | 51.68 |
| 9/7/11 | 52.42 |
| 9/8/11 | 52.21 |
| 9/9/11 | 51.36 |
| 9/12/11 | 51.82 |
| 9/13/11 | 51.59 |
| 9/14/11 | 52.2 |
| 9/15/11 | 52.51 |
| 9/16/11 | 52.65 |
| 9/19/11 | 52.45 |
| 9/20/11 | 52.29 |
| 9/21/11 | 51.32 |
| 9/22/11 | 50.28 |
| 9/23/11 | 50.8 |
| 9/26/11 | 51.83 |
| 9/27/11 | 52.03 |
| 9/28/11 | 51.31 |
| 9/29/11 | 51.93 |
| 9/30/11 | 51.9 |
| 10/3/11 | 51.96 |
| 10/4/11 | 52.88 |
| 10/5/11 | 52.65 |
| 10/6/11 | 52.75 |
| 10/7/11 | 53.7 |
| 10/10/11 | 54.81 |
| 10/11/11 | 54.72 |
| 10/12/11 | 55.2 |
| 10/13/11 | 55.02 |
| 10/14/11 | 55.46 |
| 10/17/11 | 54.78 |
| 10/18/11 | 55.89 |
| 10/19/11 | 56.25 |
| 10/20/11 | 56.37 |
| 10/21/11 | 56.92 |
| 10/24/11 | 56.78 |
| 10/25/11 | 56.71 |
| 10/26/11 | 57.37 |
| 10/27/11 | 57.81 |
| 10/28/11 | 57.15 |
| 10/31/11 | 56.72 |
| 11/1/11 | 56.23 |
| 11/2/11 | 56.86 |
| 11/3/11 | 57.42 |
| 11/4/11 | 57.5 |
| 11/7/11 | 57.94 |
| 11/8/11 | 59.32 |
| 11/9/11 | 58.05 |
| 11/10/11 | 58.13 |
| 11/11/11 | 59.2 |
| 11/14/11 | 58.89 |
| 11/15/11 | 57.46 |
| 11/16/11 | 56.68 |
| 11/17/11 | 56.73 |
| 11/18/11 | 57.23 |
| 11/21/11 | 56.66 |
| 11/22/11 | 56.85 |
| 11/23/11 | 56.64 |
| 11/25/11 | 56.89 |
| 11/28/11 | 57.25 |
| 11/29/11 | 58.17 |
| 11/30/11 | 58.9 |
| 12/1/11 | 58.61 |
| 12/2/11 | 58.09 |
| 12/5/11 | 58.34 |
| 12/6/11 | 58.78 |
| 12/7/11 | 58.51 |
| 12/8/11 | 57.98 |
| 12/9/11 | 58.32 |
| 12/12/11 | 58.09 |
| 12/13/11 | 57.6 |
| 12/14/11 | 57.65 |
| 12/15/11 | 57.95 |
| 12/16/11 | 58.27 |
| 12/19/11 | 57.78 |
| 12/20/11 | 59.19 |
| 12/21/11 | 59.39 |
| 12/22/11 | 59.19 |
| 12/23/11 | 59.99 |
| 12/27/11 | 59.83 |
| 12/28/11 | 59.73 |
| 12/29/11 | 59.99 |
| 12/30/11 | 59.76 |
| 1/3/12 | 60.33 |
| 1/4/12 | 59.71 |
| 1/5/12 | 59.42 |
| 1/6/12 | 59 |
| 1/9/12 | 59.18 |
| 1/10/12 | 59.04 |
| 1/11/12 | 59.4 |
| 1/12/12 | 59.5 |
| 1/13/12 | 59.54 |
| 1/17/12 | 59.85 |
| 1/18/12 | 60.01 |
| 1/19/12 | 60.61 |
| 1/20/12 | 61.01 |
| 1/23/12 | 60.91 |
| 1/24/12 | 61.39 |
| 1/25/12 | 61.47 |
| 1/26/12 | 60.97 |
| 1/27/12 | 60.71 |
| 1/30/12 | 61.3 |
| 1/31/12 | 61.36 |
| 2/1/12 | 62.18 |
| 2/2/12 | 61.94 |
| 2/3/12 | 62.03 |
| 2/6/12 | 61.88 |
| 2/7/12 | 61.69 |
| 2/8/12 | 61.62 |
| 2/9/12 | 61.96 |
| 2/10/12 | 61.9 |
| 2/13/12 | 61.79 |
| 2/14/12 | 62.22 |
| 2/15/12 | 61.76 |
| 2/16/12 | 62.04 |
| 2/17/12 | 62.48 |
| 2/21/12 | 60.07 |
| 2/22/12 | 58.6 |
| 2/23/12 | 58.54 |
| 2/24/12 | 58.79 |
| 2/27/12 | 58.46 |
| 2/28/12 | 58.93 |
| 2/29/12 | 59.08 |
| 3/1/12 | 58.82 |
| 3/2/12 | 59.01 |
| 3/5/12 | 59.4 |
| 3/6/12 | 58.97 |
| 3/7/12 | 59.86 |
| 3/8/12 | 59.77 |
| 3/9/12 | 60.08 |
| 3/12/12 | 60.68 |
| 3/13/12 | 61 |
| 3/14/12 | 61.08 |
| 3/15/12 | 61.23 |
| 3/16/12 | 60.84 |
| 3/19/12 | 60.74 |
| 3/20/12 | 60.6 |
| 3/21/12 | 60.56 |
| 3/22/12 | 60.65 |
| 3/23/12 | 60.75 |
| 3/26/12 | 61.2 |
| 3/27/12 | 61.09 |
| 3/28/12 | 61.19 |
| 3/29/12 | 60.82 |
| 3/30/12 | 61.2 |
| 4/2/12 | 61.36 |
| 4/3/12 | 60.65 |
| 4/4/12 | 60.26 |
| 4/5/12 | 60.67 |
| 4/9/12 | 60.13 |
| 4/10/12 | 59.93 |
| 4/11/12 | 59.8 |
| 4/12/12 | 60.14 |
| 4/13/12 | 59.77 |
| 4/16/12 | 60.58 |
| 4/17/12 | 61.87 |
| 4/18/12 | 62.06 |
| 4/19/12 | 61.75 |
| 4/20/12 | 62.45 |
| 4/23/12 | 59.54 |
| 4/24/12 | 57.77 |
| 4/25/12 | 57.36 |
| 4/26/12 | 58.95 |
| 4/27/12 | 59.03 |
| 4/30/12 | 58.91 |
| 5/1/12 | 59.07 |
| 5/2/12 | 59.01 |
| 5/3/12 | 58.99 |
| 5/4/12 | 58.7 |
| 5/7/12 | 59.19 |
| 5/8/12 | 59.05 |
| 5/9/12 | 59.03 |
| 5/10/12 | 59.19 |
| 5/11/12 | 59.42 |
| 5/14/12 | 59.07 |
| 5/15/12 | 59.35 |
| 5/16/12 | 59.19 |
| 5/17/12 | 61.68 |
| 5/18/12 | 62.43 |
| 5/21/12 | 63.04 |
| 5/22/12 | 63.73 |
| 5/23/12 | 64.58 |
| 5/24/12 | 65.07 |
| 5/25/12 | 65.31 |
| 5/29/12 | 65.68 |
| 5/30/12 | 65.44 |
| 5/31/12 | 65.82 |
| 6/1/12 | 65.55 |
| 6/4/12 | 65.99 |
| 6/5/12 | 65.5 |
| 6/6/12 | 65.93 |
| 6/7/12 | 65.87 |
| 6/8/12 | 68.22 |
| 6/11/12 | 67.53 |
| 6/12/12 | 67.72 |
| 6/13/12 | 67.07 |
| 6/14/12 | 67.63 |
| 6/15/12 | 67.75 |
| 6/18/12 | 68.12 |
| 6/19/12 | 67.81 |
| 6/20/12 | 68.52 |
| 6/21/12 | 67.7 |
| 6/22/12 | 67.3 |
| 6/25/12 | 68.18 |
| 6/26/12 | 68.58 |
| 6/27/12 | 68.59 |
| 6/28/12 | 68.3 |
| 6/29/12 | 69.72 |
| 7/2/12 | 69.35 |
| 7/3/12 | 70.75 |
| 7/5/12 | 71.08 |
| 7/6/12 | 71.36 |
| 7/9/12 | 71.76 |
| 7/10/12 | 72.11 |
| 7/11/12 | 72.26 |
| 7/12/12 | 72.31 |
| 7/13/12 | 73.18 |
| 7/16/12 | 72.98 |
| 7/17/12 | 73.1 |
| 7/18/12 | 72.85 |
| 7/19/12 | 71.53 |
| 7/20/12 | 72.25 |
| 7/23/12 | 71.85 |
| 7/24/12 | 72.14 |
| 7/25/12 | 72.08 |
| 7/26/12 | 73.67 |
| 7/27/12 | 74.52 |
| 7/30/12 | 74.98 |
| 7/31/12 | 74.43 |
| 8/1/12 | 73.62 |
| 8/2/12 | 74.05 |
| 8/3/12 | 74.55 |
| 8/6/12 | 74.28 |
| 8/7/12 | 73.99 |
| 8/8/12 | 74.31 |
| 8/9/12 | 73.85 |
| 8/10/12 | 73.68 |
| 8/13/12 | 73.4 |
| 8/14/12 | 74.01 |
| 8/15/12 | 74.45 |
| 8/16/12 | 72.15 |
| 8/17/12 | 71.99 |
| 8/20/12 | 72.3 |
| 8/21/12 | 71.43 |
| 8/22/12 | 71.77 |
| 8/23/12 | 71.56 |
| 8/24/12 | 72.11 |
| 8/27/12 | 72.5 |
| 8/28/12 | 72.41 |
| 8/29/12 | 72.77 |
| 8/30/12 | 72.25 |
| 8/31/12 | 72.6 |
| 9/4/12 | 73.51 |
| 9/5/12 | 73.55 |
| 9/6/12 | 74.81 |
| 9/7/12 | 73.82 |
| 9/10/12 | 73.51 |
| 9/11/12 | 74.06 |
| 9/12/12 | 74.07 |
| 9/13/12 | 75.14 |
| 9/14/12 | 74.5 |
| 9/17/12 | 73.99 |
| 9/18/12 | 73.95 |
| 9/19/12 | 74.37 |
| 9/20/12 | 74.75 |
| 9/21/12 | 74.45 |
| 9/24/12 | 74.74 |
| 9/25/12 | 74.26 |
| 9/26/12 | 74.19 |
| 9/27/12 | 73.98 |
| 9/28/12 | 73.8 |
| 10/1/12 | 74.05 |
| 10/2/12 | 73.75 |
| 10/3/12 | 74.2 |
| 10/4/12 | 74.72 |
| 10/5/12 | 75.13 |
| 10/8/12 | 75.25 |
| 10/9/12 | 74.14 |
| 10/10/12 | 75.42 |
| 10/11/12 | 75.01 |
| 10/12/12 | 75.81 |
| 10/15/12 | 77.15 |
| 10/16/12 | 76.91 |
| 10/17/12 | 77.03 |
| 10/18/12 | 76.56 |
| 10/19/12 | 75.62 |
| 10/22/12 | 75.65 |
| 10/23/12 | 74.76 |
| 10/24/12 | 74.82 |
| 10/25/12 | 75.32 |
| 10/26/12 | 75.11 |
| 10/31/12 | 75.02 |
| 11/1/12 | 73.45 |
| 11/2/12 | 72.77 |
| 11/5/12 | 73.14 |
| 11/6/12 | 73.76 |
| 11/7/12 | 73.11 |
| 11/8/12 | 72.48 |
| 11/9/12 | 72.31 |
| 11/12/12 | 72.48 |
| 11/13/12 | 71.81 |
| 11/14/12 | 71.31 |
| 11/15/12 | 68.72 |
| 11/16/12 | 68.03 |
| 11/19/12 | 69.02 |
| 11/20/12 | 69 |
| 11/21/12 | 68.89 |
| 11/23/12 | 70.2 |
| 11/26/12 | 69.91 |
| 11/27/12 | 69.5 |
| 11/28/12 | 70.56 |
| 11/29/12 | 70.83 |
| 11/30/12 | 72.02 |
| 12/3/12 | 71.34 |
| 12/4/12 | 72.12 |
| 12/5/12 | 71.65 |
| 12/6/12 | 71.59 |
| 12/7/12 | 72.29 |
| 12/10/12 | 72.15 |
| 12/11/12 | 70.89 |
| 12/12/12 | 68.94 |
| 12/13/12 | 69.04 |
| 12/14/12 | 68.75 |
| 12/17/12 | 69.2 |
| 12/18/12 | 69.5 |
| 12/19/12 | 68.52 |
| 12/20/12 | 69 |
| 12/21/12 | 68.65 |
| 12/24/12 | 68.57 |
| 12/26/12 | 67.99 |
| 12/27/12 | 68.19 |
| 12/28/12 | 67.61 |
| 12/31/12 | 68.23 |
| 1/2/13 | 69.24 |
| 1/3/13 | 68.8 |
| 1/4/13 | 69.06 |
| 1/7/13 | 68.4 |
| 1/8/13 | 68.59 |
| 1/9/13 | 68.57 |
| 1/10/13 | 68.36 |
| 1/11/13 | 68.63 |
| 1/14/13 | 68.3 |
| 1/15/13 | 68.98 |
| 1/16/13 | 69.21 |
| 1/17/13 | 68.85 |
| 1/18/13 | 69.2 |
| 1/22/13 | 69.58 |
| 1/23/13 | 69.49 |
| 1/24/13 | 69.79 |
| 1/25/13 | 69 |
| 1/28/13 | 69.35 |
| 1/29/13 | 69.89 |
| 1/30/13 | 69.75 |
| 1/31/13 | 69.95 |
| 2/1/13 | 70.49 |
| 2/4/13 | 69.63 |
| 2/5/13 | 70.77 |
| 2/6/13 | 71.31 |
| 2/7/13 | 71.23 |
| 2/8/13 | 71.48 |
| 2/11/13 | 71.4 |
| 2/12/13 | 71.4 |
| 2/13/13 | 71.39 |
| 2/14/13 | 70.82 |
| 2/15/13 | 69.3 |
| 2/19/13 | 68.76 |
| 2/20/13 | 69.21 |
| 2/21/13 | 70.26 |
| 2/22/13 | 70.4 |
| 2/25/13 | 70.44 |
| 2/26/13 | 71.11 |
| 2/27/13 | 71.66 |
| 2/28/13 | 70.78 |
| 3/1/13 | 71.74 |
| 3/4/13 | 73.26 |
| 3/5/13 | 73.72 |
| 3/6/13 | 73.38 |
| 3/7/13 | 73.32 |
| 3/8/13 | 73.03 |
| 3/11/13 | 72.98 |
| 3/12/13 | 73.6 |
| 3/13/13 | 73.65 |
| 3/14/13 | 73.22 |
| 3/15/13 | 72.5 |
| 3/18/13 | 72.25 |
| 3/19/13 | 72.45 |
| 3/20/13 | 72.99 |
| 3/21/13 | 73.13 |
| 3/22/13 | 74.28 |
| 3/25/13 | 74.85 |
| 3/26/13 | 74.77 |
| 3/27/13 | 74.78 |
| 3/28/13 | 74.83 |
| 4/1/13 | 75.43 |
| 4/2/13 | 76.02 |
| 4/3/13 | 76 |
| 4/4/13 | 76.2 |
| 4/5/13 | 76.39 |
| 4/8/13 | 77.29 |
| 4/9/13 | 78.12 |
| 4/10/13 | 77.37 |
| 4/11/13 | 77.79 |
| 4/12/13 | 78.56 |
| 4/15/13 | 78.47 |
| 4/16/13 | 78.68 |
| 4/17/13 | 78.51 |
| 4/18/13 | 77.16 |
| 4/19/13 | 78.29 |
| 4/22/13 | 77.97 |
| 4/23/13 | 79.09 |
| 4/24/13 | 78.03 |
| 4/25/13 | 78.65 |
| 4/26/13 | 79.04 |
| 4/29/13 | 78.39 |
| 4/30/13 | 77.72 |
| 5/1/13 | 78.06 |
| 5/2/13 | 78.46 |
| 5/3/13 | 79.25 |
| 5/6/13 | 78.83 |
| 5/7/13 | 78.83 |
| 5/8/13 | 78.25 |
| 5/9/13 | 78.4 |
| 5/10/13 | 78.89 |
| 5/13/13 | 78.5 |
| 5/14/13 | 78.78 |
| 5/15/13 | 79.86 |
| 5/16/13 | 78.5 |
| 5/17/13 | 77.87 |
| 5/20/13 | 77.4 |
| 5/21/13 | 77.39 |
| 5/22/13 | 77.03 |
| 5/23/13 | 76.33 |
| 5/24/13 | 77.31 |
| 5/28/13 | 77.32 |
| 5/29/13 | 76.23 |
| 5/30/13 | 75.63 |
| 5/31/13 | 74.84 |
| 6/3/13 | 75.69 |
| 6/4/13 | 75.94 |
| 6/5/13 | 75.25 |
| 6/6/13 | 75.63 |
| 6/7/13 | 76.33 |
| 6/10/13 | 75.75 |
| 6/11/13 | 75.25 |
| 6/12/13 | 74.84 |
| 6/13/13 | 75 |
| 6/14/13 | 74.87 |
| 6/17/13 | 74.95 |
| 6/18/13 | 75.73 |
| 6/19/13 | 74.46 |
| 6/20/13 | 73.03 |
| 6/21/13 | 73.51 |
| 6/24/13 | 74.2 |
| 6/25/13 | 74.37 |
| 6/26/13 | 75.01 |
| 6/27/13 | 75.26 |
| 6/28/13 | 74.49 |
| 7/1/13 | 74.59 |
| 7/2/13 | 74.71 |
| 7/3/13 | 74.76 |
| 7/5/13 | 75.21 |
| 7/8/13 | 76.71 |
| 7/9/13 | 77.03 |
| 7/10/13 | 76.77 |
| 7/11/13 | 77.63 |
| 7/12/13 | 77.63 |
| 7/15/13 | 77.03 |
| 7/16/13 | 77.37 |
| 7/17/13 | 77.2 |
| 7/18/13 | 77.34 |
| 7/19/13 | 78.08 |
| 7/22/13 | 77.87 |
| 7/23/13 | 78.55 |
| 7/24/13 | 78.23 |
| 7/25/13 | 78.01 |
| 7/26/13 | 78 |
| 7/29/13 | 77.99 |
| 7/30/13 | 77.89 |
| 7/31/13 | 77.94 |
| 8/1/13 | 78.22 |
| 8/2/13 | 78.75 |
| 8/5/13 | 78.77 |
| 8/6/13 | 77.87 |
| 8/7/13 | 77.37 |
| 8/8/13 | 77.25 |
| 8/9/13 | 76.9 |
| 8/12/13 | 77.08 |
| 8/13/13 | 76.86 |
| 8/14/13 | 76.4 |
| 8/15/13 | 74.41 |
| 8/16/13 | 74.11 |
| 8/19/13 | 73.58 |
| 8/20/13 | 73.23 |
| 8/21/13 | 73.55 |
| 8/22/13 | 73.46 |
| 8/23/13 | 73.44 |
| 8/26/13 | 73.03 |
| 8/27/13 | 72.86 |
| 8/28/13 | 72.38 |
| 8/29/13 | 72.43 |
| 8/30/13 | 72.98 |
| 9/3/13 | 72.68 |
| 9/4/13 | 72.91 |
| 9/5/13 | 72.67 |
| 9/6/13 | 72.59 |
| 9/9/13 | 73.51 |
| 9/10/13 | 73.96 |
| 9/11/13 | 74.05 |
| 9/12/13 | 73.91 |
| 9/13/13 | 74.36 |
| 9/16/13 | 74.78 |
| 9/17/13 | 75.15 |
| 9/18/13 | 76.42 |
| 9/19/13 | 76.21 |
| 9/20/13 | 75.83 |
| 9/23/13 | 76.42 |
| 9/24/13 | 75.75 |
| 9/25/13 | 74.65 |
| 9/26/13 | 74.62 |
| 9/27/13 | 74.36 |
| 9/30/13 | 73.96 |
| 10/1/13 | 73.59 |
| 10/2/13 | 73.72 |
| 10/3/13 | 73.16 |
| 10/4/13 | 72.8 |
| 10/7/13 | 71.87 |
| 10/8/13 | 72.9 |
| 10/9/13 | 73 |
| 10/10/13 | 74.79 |
| 10/11/13 | 74.82 |
| 10/14/13 | 74.68 |
| 10/15/13 | 74.37 |
| 10/16/13 | 75.6 |
| 10/17/13 | 75.78 |
| 10/18/13 | 75.71 |
| 10/21/13 | 75.15 |
| 10/22/13 | 76.32 |
| 10/23/13 | 75.9 |
| 10/24/13 | 76.42 |
| 10/25/13 | 76.08 |
| 10/28/13 | 77.14 |
| 10/29/13 | 77.06 |
| 10/30/13 | 76.91 |
| 10/31/13 | 76.75 |
| 11/1/13 | 77.07 |
| 11/4/13 | 77.33 |
| 11/5/13 | 77.42 |
| 11/6/13 | 78.16 |
| 11/7/13 | 77.51 |
| 11/8/13 | 77.96 |
| 11/11/13 | 79.01 |
| 11/12/13 | 78.71 |
| 11/13/13 | 78.9 |
| 11/14/13 | 79.08 |
| 11/15/13 | 79.22 |
| 11/18/13 | 79.22 |
| 11/19/13 | 79.25 |
| 11/20/13 | 78.9 |
| 11/21/13 | 78.86 |
| 11/22/13 | 79.81 |
| 11/25/13 | 80.43 |
| 11/26/13 | 80.68 |
| 11/27/13 | 80.93 |
| 11/29/13 | 81.01 |
| 12/2/13 | 81.11 |
| 12/3/13 | 81.21 |
| 12/4/13 | 80.22 |
| 12/5/13 | 79.44 |
| 12/6/13 | 79.94 |
| 12/9/13 | 79.95 |
| 12/10/13 | 79.08 |
| 12/11/13 | 79.09 |
| 12/12/13 | 78.5 |
| 12/13/13 | 78.08 |
| 12/16/13 | 77.74 |
| 12/17/13 | 77.25 |
| 12/18/13 | 77.94 |
| 12/19/13 | 77.24 |
| 12/20/13 | 77.43 |
| 12/23/13 | 77.87 |
| 12/24/13 | 78.01 |
| 12/26/13 | 78.39 |
| 12/27/13 | 78.47 |
| 12/30/13 | 78.63 |
| 12/31/13 | 78.69 |
| 1/2/14 | 78.91 |
| 1/3/14 | 78.65 |
| 1/6/14 | 78.21 |
| 1/7/14 | 78.45 |
| 1/8/14 | 77.83 |
| 1/9/14 | 78.09 |
| 1/10/14 | 78.04 |
| 1/13/14 | 77.49 |
| 1/14/14 | 77.96 |
| 1/15/14 | 77.66 |
| 1/16/14 | 76.76 |
| 1/17/14 | 76.19 |
| 1/21/14 | 75.84 |
| 1/22/14 | 75.35 |
| 1/23/14 | 74.96 |
| 1/24/14 | 74.42 |
| 1/27/14 | 74.15 |
| 1/28/14 | 74.67 |
| 1/29/14 | 74.1 |
| 1/30/14 | 74.75 |
| 1/31/14 | 74.68 |
| 2/3/14 | 72.66 |
| 2/4/14 | 72.73 |
| 2/5/14 | 72.87 |
| 2/6/14 | 72.82 |
| 2/7/14 | 73.75 |
| 2/10/14 | 73.76 |
| 2/11/14 | 74.8 |
| 2/12/14 | 74.96 |
| 2/13/14 | 75.36 |
| 2/14/14 | 75.79 |
| 2/18/14 | 75.33 |
| 2/19/14 | 74.85 |
| 2/20/14 | 73.52 |
| 2/21/14 | 73.12 |
| 2/24/14 | 73.35 |
| 2/25/14 | 73.35 |
| 2/26/14 | 74.78 |
| 2/27/14 | 74.56 |
| 2/28/14 | 74.7 |
| 3/3/14 | 74.12 |
| 3/4/14 | 75.13 |
| 3/5/14 | 74.8 |
| 3/6/14 | 74.88 |
| 3/7/14 | 74.58 |
| 3/10/14 | 74.43 |
| 3/11/14 | 74.92 |
| 3/12/14 | 75.53 |
| 3/13/14 | 74.93 |
| 3/14/14 | 74.28 |
| 3/17/14 | 74.68 |
| 3/18/14 | 74.77 |
| 3/19/14 | 74.38 |
| 3/20/14 | 75.38 |
| 3/21/14 | 76.1 |
| 3/24/14 | 76.76 |
| 3/25/14 | 76.87 |
| 3/26/14 | 76.23 |
| 3/27/14 | 76.14 |
| 3/28/14 | 76.01 |
| 3/31/14 | 76.43 |
| 4/1/14 | 76.77 |
| 4/2/14 | 77.18 |
| 4/3/14 | 77.46 |
| 4/4/14 | 77.31 |
| 4/7/14 | 77.31 |
| 4/8/14 | 78.18 |
| 4/9/14 | 77.97 |
| 4/10/14 | 76.89 |
| 4/11/14 | 76.5 |
| 4/14/14 | 77.38 |
| 4/15/14 | 76.88 |
| 4/16/14 | 77.22 |
| 4/17/14 | 77.66 |
| 4/21/14 | 77.6 |
| 4/22/14 | 77.56 |
| 4/23/14 | 78.04 |
| 4/24/14 | 78.31 |
| 4/25/14 | 78.62 |
| 4/28/14 | 79.76 |
| 4/29/14 | 79.67 |
| 4/30/14 | 79.71 |
| 5/1/14 | 79.7 |
| 5/2/14 | 79.12 |
| 5/5/14 | 78.62 |
| 5/6/14 | 78.01 |
| 5/7/14 | 77.96 |
| 5/8/14 | 78.69 |
| 5/9/14 | 79.2 |
| 5/12/14 | 79.15 |
| 5/13/14 | 79.14 |
| 5/14/14 | 78.74 |
| 5/15/14 | 76.83 |
| 5/16/14 | 77.01 |
| 5/19/14 | 76.61 |
| 5/20/14 | 75.69 |
| 5/21/14 | 75.66 |
| 5/22/14 | 75.39 |
| 5/23/14 | 75.61 |
| 5/27/14 | 75.59 |
| 5/28/14 | 75.53 |
| 5/29/14 | 75.98 |
| 5/30/14 | 76.77 |
| 6/2/14 | 76.76 |
| 6/3/14 | 76.71 |
| 6/4/14 | 77.13 |
| 6/5/14 | 77.32 |
| 6/6/14 | 77.21 |
| 6/9/14 | 77.01 |
| 6/10/14 | 76.62 |
| 6/11/14 | 76.16 |
| 6/12/14 | 75.73 |
| 6/13/14 | 75.28 |
| 6/16/14 | 75.34 |
| 6/17/14 | 74.99 |
| 6/18/14 | 75.7 |
| 6/19/14 | 75.87 |
| 6/20/14 | 75.68 |
| 6/23/14 | 75.79 |
| 6/24/14 | 75.97 |
| 6/25/14 | 75.62 |
| 6/26/14 | 74.91 |
| 6/27/14 | 75.34 |
| 6/30/14 | 75.07 |
| 7/1/14 | 75.28 |
| 7/2/14 | 75.62 |
| 7/3/14 | 75.75 |
| 7/7/14 | 76.07 |
| 7/8/14 | 76.65 |
| 7/9/14 | 77.21 |
| 7/10/14 | 77.06 |
| 7/11/14 | 76.82 |
| 7/14/14 | 76.55 |
| 7/15/14 | 76.84 |
| 7/16/14 | 76.86 |
| 7/17/14 | 76.61 |
| 7/18/14 | 77.09 |
| 7/21/14 | 76.77 |
| 7/22/14 | 76.64 |
| 7/23/14 | 76.99 |
| 7/24/14 | 76.35 |
| 7/25/14 | 75.97 |
| 7/28/14 | 75.71 |
| 7/29/14 | 75.44 |
| 7/30/14 | 74.78 |
| 7/31/14 | 73.58 |
| 8/1/14 | 73.54 |
| 8/4/14 | 73.54 |
| 8/5/14 | 73.34 |
| 8/6/14 | 74.2 |
| 8/7/14 | 73.95 |
| 8/8/14 | 74.67 |
| 8/11/14 | 74.36 |
| 8/12/14 | 74.22 |
| 8/13/14 | 74.03 |
| 8/14/14 | 74.39 |
| 8/15/14 | 73.9 |
| 8/18/14 | 74.49 |
| 8/19/14 | 74.88 |
| 8/20/14 | 74.96 |
| 8/21/14 | 75.55 |
| 8/22/14 | 75.73 |
| 8/25/14 | 75.69 |
| 8/26/14 | 75.52 |
| 8/27/14 | 75.85 |
| 8/28/14 | 75.9 |
| 8/29/14 | 75.5 |
| 9/2/14 | 75.75 |
| 9/3/14 | 76.01 |
| 9/4/14 | 76.56 |
| 9/5/14 | 77.51 |
| 9/8/14 | 76.53 |
| 9/9/14 | 76.74 |
| 9/10/14 | 76.51 |
| 9/11/14 | 76.1 |
| 9/12/14 | 75.77 |
| 9/15/14 | 75.81 |
| 9/16/14 | 76.32 |
| 9/17/14 | 76.24 |
| 9/18/14 | 76.22 |
| 9/19/14 | 76.84 |
| 9/22/14 | 76.31 |
| 9/23/14 | 75.6 |
| 9/24/14 | 77.08 |
| 9/25/14 | 76.12 |
| 9/26/14 | 76.49 |
| 9/29/14 | 76.08 |
| 9/30/14 | 76.47 |
| 10/1/14 | 76.12 |
| 10/2/14 | 76.23 |
| 10/3/14 | 77.32 |
| 10/6/14 | 77.35 |
| 10/7/14 | 77.3 |
| 10/8/14 | 78.24 |
| 10/9/14 | 77.86 |
| 10/10/14 | 78.29 |
| 10/13/14 | 77.56 |
| 10/14/14 | 77.98 |
| 10/15/14 | 75.2 |
| 10/16/14 | 73.82 |
| 10/17/14 | 74.1 |
| 10/20/14 | 75.14 |
| 10/21/14 | 76.02 |
| 10/22/14 | 76.03 |
| 10/23/14 | 76.25 |
| 10/24/14 | 76.38 |
| 10/27/14 | 76.59 |
| 10/28/14 | 76.35 |
| 10/29/14 | 76.39 |
| 10/30/14 | 76.45 |
| 10/31/14 | 76.27 |
| 11/3/14 | 76.28 |
| 11/4/14 | 77.26 |
| 11/5/14 | 77.7 |
| 11/6/14 | 77.81 |
| 11/7/14 | 78.77 |
| 11/10/14 | 79.44 |
| 11/11/14 | 79.01 |
| 11/12/14 | 79.2 |
| 11/13/14 | 82.94 |
| 11/14/14 | 82.96 |
| 11/17/14 | 83.57 |
| 11/18/14 | 83.79 |
| 11/19/14 | 84.99 |
| 11/20/14 | 84.58 |
| 11/21/14 | 84.65 |
| 11/24/14 | 85.4 |
| 11/25/14 | 84.95 |
| 11/26/14 | 84.98 |
| 11/28/14 | 87.54 |
| 12/1/14 | 86.22 |
| 12/2/14 | 86.4 |
| 12/3/14 | 84.94 |
| 12/4/14 | 84.76 |
| 12/5/14 | 84.12 |
| 12/8/14 | 84.23 |
| 12/9/14 | 83.56 |
| 12/10/14 | 82.98 |
| 12/11/14 | 83.83 |
| 12/12/14 | 83.81 |
| 12/15/14 | 83.94 |
| 12/16/14 | 82.96 |
| 12/17/14 | 84.23 |
| 12/18/14 | 85.94 |
| 12/19/14 | 85.16 |
| 12/22/14 | 86.38 |
| 12/23/14 | 86.66 |
| 12/24/14 | 86.43 |
| 12/26/14 | 86.91 |
| 12/29/14 | 86.64 |
| 12/30/14 | 86.79 |
| 12/31/14 | 85.88 |
| 1/2/15 | 85.9 |
| 1/5/15 | 85.65 |
| 1/6/15 | 86.31 |
| 1/7/15 | 88.6 |
| 1/8/15 | 90.47 |
| 1/9/15 | 89.35 |
| 1/12/15 | 90.02 |
| 1/13/15 | 89.31 |
| 1/14/15 | 86.61 |
| 1/15/15 | 87.38 |
| 1/16/15 | 86.77 |
| 1/20/15 | 86.69 |
| 1/21/15 | 86.64 |
| 1/22/15 | 88.3 |
| 1/23/15 | 88.51 |
| 1/26/15 | 88.63 |
| 1/27/15 | 87.53 |
| 1/28/15 | 86.82 |
| 1/29/15 | 87.72 |
| 1/30/15 | 84.98 |
| 2/2/15 | 85.71 |
| 2/3/15 | 86.19 |
| 2/4/15 | 86.65 |
| 2/5/15 | 87.28 |
| 2/6/15 | 87.33 |
| 2/9/15 | 85.91 |
| 2/10/15 | 87.29 |
| 2/11/15 | 86.34 |
| 2/12/15 | 85.89 |
| 2/13/15 | 85.81 |
| 2/17/15 | 85.96 |
| 2/18/15 | 86.29 |
| 2/19/15 | 83.52 |
| 2/20/15 | 84.3 |
| 2/23/15 | 84.6 |
| 2/24/15 | 84.57 |
| 2/25/15 | 83.57 |
| 2/26/15 | 83.8 |
| 2/27/15 | 83.93 |
| 3/2/15 | 83.96 |
| 3/3/15 | 83.37 |
| 3/4/15 | 82.58 |
| 3/5/15 | 83.57 |
| 3/6/15 | 82.59 |
| 3/9/15 | 82.88 |
| 3/10/15 | 82.07 |
| 3/11/15 | 80.69 |
| 3/12/15 | 81.9 |
| 3/13/15 | 81.9 |
| 3/16/15 | 83.29 |
| 3/17/15 | 82.62 |
| 3/18/15 | 82.53 |
| 3/19/15 | 81.52 |
| 3/20/15 | 83.24 |
| 3/23/15 | 83.31 |
| 3/24/15 | 83.05 |
| 3/25/15 | 81.32 |
| 3/26/15 | 81.89 |
| 3/27/15 | 81.35 |
| 3/30/15 | 82.53 |
| 3/31/15 | 82.25 |
| 4/1/15 | 80.71 |
| 4/2/15 | 80.73 |
| 4/6/15 | 80.99 |
| 4/7/15 | 80.5 |
| 4/8/15 | 81.03 |
| 4/9/15 | 80.84 |
| 4/10/15 | 80.65 |
| 4/13/15 | 80.29 |
| 4/14/15 | 80.15 |
| 4/15/15 | 79.74 |
| 4/16/15 | 79.24 |
| 4/17/15 | 77.88 |
| 4/20/15 | 78.14 |
| 4/21/15 | 78.03 |
| 4/22/15 | 78.43 |
| 4/23/15 | 79.18 |
| 4/24/15 | 79.84 |
| 4/27/15 | 79.37 |
| 4/28/15 | 79.1 |
| 4/29/15 | 77.88 |
| 4/30/15 | 78.05 |
| 5/1/15 | 78.6 |
| 5/4/15 | 79.18 |
| 5/5/15 | 78.13 |
| 5/6/15 | 77.65 |
| 5/7/15 | 78.03 |
| 5/8/15 | 78.53 |
| 5/11/15 | 78.1 |
| 5/12/15 | 78.96 |
| 5/13/15 | 78.16 |
| 5/14/15 | 78.72 |
| 5/15/15 | 79.24 |
| 5/18/15 | 79.92 |
| 5/19/15 | 76.43 |
| 5/20/15 | 75.9 |
| 5/21/15 | 76.11 |
| 5/22/15 | 75.86 |
| 5/26/15 | 74.9 |
| 5/27/15 | 75.19 |
| 5/28/15 | 74.84 |
| 5/29/15 | 74.27 |
| 6/1/15 | 74.73 |
| 6/2/15 | 74.53 |
| 6/3/15 | 74.89 |
| 6/4/15 | 74.15 |
| 6/5/15 | 73.06 |
| 6/8/15 | 72.61 |
| 6/9/15 | 72.47 |
| 6/10/15 | 72.93 |
| 6/11/15 | 72.94 |
| 6/12/15 | 72.43 |
| 6/15/15 | 71.93 |
| 6/16/15 | 72.35 |
| 6/17/15 | 72.73 |
| 6/18/15 | 72.98 |
| 6/19/15 | 72.74 |
| 6/22/15 | 72.79 |
| 6/23/15 | 72.57 |
| 6/24/15 | 72.38 |
| 6/25/15 | 71.86 |
| 6/26/15 | 72.12 |
| 6/29/15 | 71.42 |
| 6/30/15 | 70.93 |
| 7/1/15 | 71.88 |
| 7/2/15 | 71.86 |
| 7/6/15 | 72.53 |
| 7/7/15 | 73.79 |
| 7/8/15 | 73.06 |
| 7/9/15 | 72.78 |
| 7/10/15 | 73.12 |
| 7/13/15 | 73.88 |
| 7/14/15 | 73.79 |
| 7/15/15 | 73.65 |
| 7/16/15 | 73.83 |
| 7/17/15 | 73.39 |
| 7/20/15 | 73.1 |
| 7/21/15 | 72.74 |
| 7/22/15 | 73.16 |
| 7/23/15 | 72.51 |
| 7/24/15 | 71.58 |
| 7/27/15 | 71.38 |
| 7/28/15 | 72.1 |
| 7/29/15 | 72.23 |
| 7/30/15 | 72.16 |
| 7/31/15 | 71.98 |
| 8/3/15 | 72.18 |
| 8/4/15 | 72.25 |
| 8/5/15 | 73.51 |
| 8/6/15 | 72.79 |
| 8/7/15 | 71.25 |
| 8/10/15 | 71.48 |
| 8/11/15 | 71.93 |
| 8/12/15 | 72.58 |
| 8/13/15 | 72.11 |
| 8/14/15 | 72.38 |
| 8/17/15 | 71.91 |
| 8/18/15 | 69.48 |
| 8/19/15 | 68.57 |
| 8/20/15 | 68.43 |
| 8/21/15 | 66.54 |
| 8/24/15 | 63.95 |
| 8/25/15 | 63.1 |
| 8/26/15 | 64.83 |
| 8/27/15 | 66.08 |
| 8/28/15 | 64.94 |
| 8/31/15 | 64.73 |
| 9/1/15 | 63.82 |
| 9/2/15 | 64.44 |
| 9/3/15 | 64.86 |
| 9/4/15 | 63.89 |
| 9/8/15 | 66.38 |
| 9/9/15 | 65.12 |
| 9/10/15 | 64.12 |
| 9/11/15 | 64.65 |
| 9/14/15 | 64.28 |
| 9/15/15 | 64.32 |
| 9/16/15 | 64.69 |
| 9/17/15 | 64.47 |
| 9/18/15 | 63.34 |
| 9/21/15 | 63.72 |
| 9/22/15 | 63.59 |
| 9/23/15 | 63.72 |
| 9/24/15 | 63.83 |
| 9/25/15 | 63.78 |
| 9/28/15 | 63.66 |
| 9/29/15 | 63.78 |
| 9/30/15 | 64.84 |
| 10/1/15 | 64.27 |
| 10/2/15 | 64.98 |
| 10/5/15 | 65.87 |
| 10/6/15 | 65.68 |
| 10/7/15 | 66.36 |
| 10/8/15 | 66.88 |
| 10/9/15 | 66.69 |
| 10/12/15 | 66.93 |
| 10/13/15 | 66.73 |
| 10/14/15 | 60.03 |
| 10/15/15 | 59.33 |
| 10/16/15 | 58.89 |
| 10/19/15 | 58.85 |
| 10/20/15 | 58.75 |
| 10/21/15 | 58.64 |
| 10/22/15 | 58.9 |
| 10/23/15 | 58.3 |
| 10/26/15 | 58.02 |
| 10/27/15 | 57.48 |
| 10/28/15 | 57.64 |
| 10/29/15 | 57.96 |
| 10/30/15 | 57.24 |
| 11/2/15 | 57.61 |
| 11/3/15 | 58.11 |
| 11/4/15 | 58.37 |
| 11/5/15 | 58.61 |
| 11/6/15 | 58.78 |
| 11/9/15 | 58.49 |
| 11/10/15 | 58.68 |
| 11/11/15 | 57.58 |
| 11/12/15 | 56.95 |
| 11/13/15 | 56.42 |
| 11/16/15 | 57.87 |
| 11/17/15 | 59.92 |
| 11/18/15 | 60.93 |
| 11/19/15 | 60.7 |
| 11/20/15 | 60.07 |
| 11/23/15 | 60.26 |
| 11/24/15 | 59.92 |
| 11/25/15 | 60.24 |
| 11/27/15 | 59.89 |
| 11/30/15 | 58.84 |
| 12/1/15 | 58.99 |
| 12/2/15 | 58.35 |
| 12/3/15 | 59.04 |
| 12/4/15 | 59.66 |
| 12/7/15 | 60.5 |
| 12/8/15 | 59.61 |
| 12/9/15 | 59.13 |
| 12/10/15 | 59.56 |
| 12/11/15 | 59.36 |
| 12/14/15 | 60.39 |
| 12/15/15 | 59.64 |
| 12/16/15 | 60.3 |
| 12/17/15 | 58.98 |
| 12/18/15 | 58.85 |
| 12/21/15 | 59.55 |
| 12/22/15 | 60.54 |
| 12/23/15 | 61.09 |
| 12/24/15 | 60.83 |
| 12/28/15 | 60.75 |
| 12/29/15 | 61.61 |
| 12/30/15 | 61.68 |
| 12/31/15 | 61.3 |
| 1/4/16 | 61.46 |
| 1/5/16 | 62.92 |
| 1/6/16 | 63.55 |
| 1/7/16 | 65.03 |
| 1/8/16 | 63.54 |
| 1/11/16 | 64.22 |
| 1/12/16 | 63.62 |
| 1/13/16 | 61.92 |
| 1/14/16 | 63.06 |
| 1/15/16 | 61.93 |
| 1/19/16 | 62.56 |
| 1/20/16 | 60.84 |
| 1/21/16 | 61.88 |
| 1/22/16 | 62.69 |
| 1/25/16 | 63.45 |
| 1/26/16 | 64 |
| 1/27/16 | 63.95 |
| 1/28/16 | 64.22 |
| 1/29/16 | 66.36 |
| 2/1/16 | 67.5 |
| 2/2/16 | 66.86 |
| 2/3/16 | 66.27 |
| 2/4/16 | 66.42 |
| 2/5/16 | 67 |
| 2/8/16 | 66.9 |
| 2/9/16 | 65.81 |
| 2/10/16 | 65.79 |
| 2/11/16 | 65.32 |
| 2/12/16 | 66.18 |
| 2/16/16 | 65.9 |
| 2/17/16 | 66.11 |
| 2/18/16 | 64.12 |
| 2/19/16 | 64.66 |
| 2/22/16 | 65.63 |
| 2/23/16 | 66.48 |
| 2/24/16 | 67.12 |
| 2/25/16 | 68.04 |
| 2/26/16 | 66.51 |
| 2/29/16 | 66.34 |
| 3/1/16 | 66.46 |
| 3/2/16 | 66.21 |
| 3/3/16 | 66.14 |
| 3/4/16 | 66.78 |
| 3/7/16 | 67.89 |
| 3/8/16 | 68.04 |
| 3/9/16 | 67.53 |
| 3/10/16 | 67.41 |
| 3/11/16 | 67.17 |
| 3/14/16 | 67.36 |
| 3/15/16 | 68.09 |
| 3/16/16 | 67.99 |
| 3/17/16 | 67.45 |
| 3/18/16 | 66.95 |
| 3/21/16 | 67.97 |
| 3/22/16 | 67.87 |
| 3/23/16 | 67.46 |
| 3/24/16 | 68 |
| 3/28/16 | 68.12 |
| 3/29/16 | 68.03 |
| 3/30/16 | 68.8 |
| 3/31/16 | 68.49 |
| 4/1/16 | 69.06 |
| 4/4/16 | 69.1 |
| 4/5/16 | 68.64 |
| 4/6/16 | 69.04 |
| 4/7/16 | 68.22 |
| 4/8/16 | 68.06 |
| 4/11/16 | 67.4 |
| 4/12/16 | 68.8 |
| 4/13/16 | 69.15 |
| 4/14/16 | 68.8 |
| 4/15/16 | 69.06 |
| 4/18/16 | 69.86 |
| 4/19/16 | 69.77 |
| 4/20/16 | 69.21 |
| 4/21/16 | 68.47 |
| 4/22/16 | 68.72 |
| 4/25/16 | 69.47 |
| 4/26/16 | 69.3 |
| 4/27/16 | 69.42 |
| 4/28/16 | 68.91 |
| 4/29/16 | 66.87 |
| 5/2/16 | 67.59 |
| 5/3/16 | 67 |
| 5/4/16 | 67.19 |
| 5/5/16 | 67.21 |
| 5/6/16 | 68.25 |
| 5/9/16 | 68.95 |
| 5/10/16 | 68.79 |
| 5/11/16 | 66.41 |
| 5/12/16 | 66.85 |
| 5/13/16 | 64.94 |
| 5/16/16 | 66.02 |
| 5/17/16 | 65.1 |
| 5/18/16 | 63.15 |
| 5/19/16 | 69.2 |
| 5/20/16 | 69.86 |
| 5/23/16 | 69.5 |
| 5/24/16 | 70.24 |
| 5/25/16 | 70.48 |
| 5/26/16 | 70.85 |
| 5/27/16 | 70.75 |
| 5/31/16 | 70.78 |
| 6/1/16 | 70.5 |
| 6/2/16 | 70.95 |
| 6/3/16 | 70.87 |
| 6/6/16 | 71.05 |
| 6/7/16 | 71.03 |
| 6/8/16 | 71.28 |
| 6/9/16 | 71.09 |
| 6/10/16 | 71.14 |
| 6/13/16 | 70.53 |
| 6/14/16 | 70.95 |
| 6/15/16 | 71.12 |
| 6/16/16 | 71.3 |
| 6/17/16 | 70.95 |
| 6/20/16 | 71.1 |
| 6/21/16 | 71.46 |
| 6/22/16 | 71.75 |
| 6/23/16 | 72.1 |
| 6/24/16 | 71.96 |
| 6/27/16 | 71.5 |
| 6/28/16 | 71.51 |
| 6/29/16 | 72.46 |
| 6/30/16 | 73.02 |
| 7/1/16 | 72.81 |
| 7/5/16 | 73.14 |
| 7/6/16 | 73.82 |
| 7/7/16 | 73.53 |
| 7/8/16 | 73.84 |
| 7/11/16 | 74.06 |
| 7/12/16 | 73.27 |
| 7/13/16 | 73.62 |
| 7/14/16 | 73.7 |
| 7/15/16 | 73.67 |
| 7/18/16 | 73.84 |
| 7/19/16 | 73.66 |
| 7/20/16 | 73.79 |
| 7/21/16 | 73.52 |
| 7/22/16 | 73.55 |
| 7/25/16 | 73.75 |
| 7/26/16 | 73.73 |
| 7/27/16 | 73.32 |
| 7/28/16 | 73.24 |
| 7/29/16 | 72.97 |
| 8/1/16 | 73.78 |
| 8/2/16 | 73.13 |
| 8/3/16 | 72.94 |
| 8/4/16 | 73.3 |
| 8/5/16 | 73.76 |
| 8/8/16 | 73.34 |
| 8/9/16 | 73.54 |
| 8/10/16 | 73.95 |
| 8/11/16 | 73.8 |
| 8/12/16 | 73.89 |
| 8/15/16 | 73.32 |
| 8/16/16 | 72.89 |
| 8/17/16 | 72.93 |
| 8/18/16 | 74.3 |
| 8/19/16 | 72.81 |
| 8/22/16 | 72.7 |
| 8/23/16 | 71.97 |
| 8/24/16 | 72.23 |
| 8/25/16 | 71.22 |
| 8/26/16 | 71.14 |
| 8/29/16 | 71.4 |
| 8/30/16 | 71.31 |
| 8/31/16 | 71.44 |
| 9/1/16 | 72.84 |
| 9/2/16 | 72.5 |
| 9/6/16 | 73 |
| 9/7/16 | 72.06 |
| 9/8/16 | 71.83 |
| 9/9/16 | 70.3 |
| 9/12/16 | 71.94 |
| 9/13/16 | 71.46 |
| 9/14/16 | 71.52 |
| 9/15/16 | 72.4 |
| 9/16/16 | 72.87 |
| 9/19/16 | 72.09 |
| 9/20/16 | 71.97 |
| 9/21/16 | 72.19 |
| 9/22/16 | 72.27 |
| 9/23/16 | 72.35 |
| 9/26/16 | 71.62 |
| 9/27/16 | 72.33 |
| 9/28/16 | 71.79 |
| 9/29/16 | 70.73 |
| 9/30/16 | 72.12 |
| 10/3/16 | 72.01 |
| 10/4/16 | 71.75 |
| 10/5/16 | 71.67 |
| 10/6/16 | 69.36 |
| 10/7/16 | 68.7 |
| 10/10/16 | 67.98 |
| 10/11/16 | 67.39 |
| 10/12/16 | 67.46 |
| 10/13/16 | 68.23 |
| 10/14/16 | 68.45 |
| 10/17/16 | 68.22 |
| 10/18/16 | 68.87 |
| 10/19/16 | 68.89 |
| 10/20/16 | 68.73 |
| 10/21/16 | 68.34 |
| 10/24/16 | 69.19 |
| 10/25/16 | 69.36 |
| 10/26/16 | 69.59 |
| 10/27/16 | 69.83 |
| 10/28/16 | 69.99 |
| 10/31/16 | 70.02 |
| 11/1/16 | 69.3 |
| 11/2/16 | 69.45 |
| 11/3/16 | 69.63 |
| 11/4/16 | 69.16 |
| 11/7/16 | 69.78 |
| 11/8/16 | 69.79 |
| 11/9/16 | 71.1 |
| 11/10/16 | 71.39 |
| 11/11/16 | 71.23 |
| 11/14/16 | 70.49 |
| 11/15/16 | 71.42 |
| 11/16/16 | 71.39 |
| 11/17/16 | 69.19 |
| 11/18/16 | 68.54 |
| 11/21/16 | 69.37 |
| 11/22/16 | 70.12 |
| 11/23/16 | 70.83 |
| 11/25/16 | 71.23 |
| 11/28/16 | 71.19 |
| 11/29/16 | 71.37 |
| 11/30/16 | 70.43 |
| 12/1/16 | 70.67 |
| 12/2/16 | 70.88 |
| 12/5/16 | 69.94 |
| 12/6/16 | 70.36 |
| 12/7/16 | 70.6 |
| 12/8/16 | 70.34 |
| 12/9/16 | 70.08 |
| 12/12/16 | 71.67 |
| 12/13/16 | 71.8 |
| 12/14/16 | 71.34 |
| 12/15/16 | 71.08 |
| 12/16/16 | 70.98 |
| 12/19/16 | 71.58 |
| 12/20/16 | 71.82 |
| 12/21/16 | 71.24 |
| 12/22/16 | 69.59 |
| 12/23/16 | 69.54 |
| 12/27/16 | 69.7 |
| 12/28/16 | 69.31 |
| 12/29/16 | 69.26 |
| 12/30/16 | 69.12 |
| 1/3/17 | 68.66 |
| 1/4/17 | 69.06 |
| 1/5/17 | 69.21 |
| 1/6/17 | 68.26 |
| 1/9/17 | 68.71 |
| 1/10/17 | 68.23 |
| 1/11/17 | 68.53 |
| 1/12/17 | 67.97 |
| 1/13/17 | 67.13 |
| 1/17/17 | 68.42 |
| 1/18/17 | 68.11 |
| 1/19/17 | 67.62 |
| 1/20/17 | 67.18 |
| 1/23/17 | 66.65 |
| 1/24/17 | 67.4 |
| 1/25/17 | 66.89 |
| 1/26/17 | 66.73 |
| 1/27/17 | 65.66 |
| 1/30/17 | 66.42 |
| 1/31/17 | 66.74 |
| 2/1/17 | 66.23 |
| 2/2/17 | 66.7 |
| 2/3/17 | 66.5 |
| 2/6/17 | 66.4 |
| 2/7/17 | 66.89 |
| 2/8/17 | 67.81 |
| 2/9/17 | 69.08 |
| 2/10/17 | 68.02 |
| 2/13/17 | 67.77 |
| 2/14/17 | 68.66 |
| 2/15/17 | 68.69 |
| 2/16/17 | 68.87 |
| 2/17/17 | 69.37 |
| 2/21/17 | 71.45 |
| 2/22/17 | 71.71 |
| 2/23/17 | 71.31 |
| 2/24/17 | 72.39 |
| 2/27/17 | 71.74 |
| 2/28/17 | 70.93 |
| 3/1/17 | 70.45 |
| 3/2/17 | 70.76 |
| 3/3/17 | 70.03 |
| 3/6/17 | 69.88 |
| 3/7/17 | 69.87 |
| 3/8/17 | 69.8 |
| 3/9/17 | 69.86 |
| 3/10/17 | 70.1 |
| 3/13/17 | 69.95 |
| 3/14/17 | 70.72 |
| 3/15/17 | 70.58 |
| 3/16/17 | 70.44 |
| 3/17/17 | 69.89 |
| 3/20/17 | 69.98 |
| 3/21/17 | 69.9 |
| 3/22/17 | 70.25 |
| 3/23/17 | 69.86 |
| 3/24/17 | 69.61 |
| 3/27/17 | 69.66 |
| 3/28/17 | 70.32 |
| 3/29/17 | 70.74 |
| 3/30/17 | 71.59 |
| 3/31/17 | 72.08 |
| 4/3/17 | 71.83 |
| 4/4/17 | 72.01 |
| 4/5/17 | 71.65 |
| 4/6/17 | 71.43 |
| 4/7/17 | 72.9 |
| 4/10/17 | 73.06 |
| 4/11/17 | 73.43 |
| 4/12/17 | 73.44 |
| 4/13/17 | 73.15 |
| 4/17/17 | 73.49 |
| 4/18/17 | 73.89 |
| 4/19/17 | 74.07 |
| 4/20/17 | 74.8 |
| 4/21/17 | 74.94 |
| 4/24/17 | 74.78 |
| 4/25/17 | 75.05 |
| 4/26/17 | 75.43 |
| 4/27/17 | 75.44 |
| 4/28/17 | 75.18 |
| 5/1/17 | 75.23 |
| 5/2/17 | 75.52 |
| 5/3/17 | 75.76 |
| 5/4/17 | 76.34 |
| 5/5/17 | 76.5 |
| 5/8/17 | 76.12 |
| 5/9/17 | 76.72 |
| 5/10/17 | 76.7 |
| 5/11/17 | 76.13 |
| 5/12/17 | 75.71 |
| 5/15/17 | 76.29 |
| 5/16/17 | 75.11 |
| 5/17/17 | 75.12 |
| 5/18/17 | 77.54 |
| 5/19/17 | 78.77 |
| 5/22/17 | 78.55 |
| 5/23/17 | 78.49 |
| 5/24/17 | 78.15 |
| 5/25/17 | 78.31 |
| 5/26/17 | 78.13 |
| 5/30/17 | 78.15 |
| 5/31/17 | 78.6 |
| 6/1/17 | 79.81 |
| 6/2/17 | 79.62 |
| 6/5/17 | 80.26 |
| 6/6/17 | 78.93 |
| 6/7/17 | 79.15 |
| 6/8/17 | 78.93 |
| 6/9/17 | 79.42 |
| 6/12/17 | 79.24 |
| 6/13/17 | 79.52 |
| 6/14/17 | 79.9 |
| 6/15/17 | 78.91 |
| 6/16/17 | 75.24 |
| 6/19/17 | 75.5 |
| 6/20/17 | 75.54 |
| 6/21/17 | 76.24 |
| 6/22/17 | 75.52 |
| 6/23/17 | 74.84 |
| 6/26/17 | 75.5 |
| 6/27/17 | 76.01 |
| 6/28/17 | 76.51 |
| 6/29/17 | 75.93 |
| 6/30/17 | 75.68 |
| 7/3/17 | 75.36 |
| 7/5/17 | 75.32 |
| 7/6/17 | 75.47 |
| 7/7/17 | 75.33 |
| 7/10/17 | 73.23 |
| 7/11/17 | 73.47 |
| 7/12/17 | 73.94 |
| 7/13/17 | 75.05 |
| 7/14/17 | 76.34 |
| 7/17/17 | 76.37 |
| 7/18/17 | 76.2 |
| 7/19/17 | 75.87 |
| 7/20/17 | 76.02 |
| 7/21/17 | 76.15 |
| 7/24/17 | 76.89 |
| 7/25/17 | 78.52 |
| 7/26/17 | 78.9 |
| 7/27/17 | 79.78 |
| 7/28/17 | 79.81 |
| 7/31/17 | 79.99 |
| 8/1/17 | 80.5 |
| 8/2/17 | 80.53 |
| 8/3/17 | 80.87 |
| 8/4/17 | 80.48 |
| 8/7/17 | 81.28 |
| 8/8/17 | 81.59 |
| 8/9/17 | 81.61 |
| 8/10/17 | 80.66 |
| 8/11/17 | 80.4 |
| 8/14/17 | 80.7 |
| 8/15/17 | 80.77 |
| 8/16/17 | 80.98 |
| 8/17/17 | 79.7 |
| 8/18/17 | 79.31 |
| 8/21/17 | 79.71 |
| 8/22/17 | 80.02 |
| 8/23/17 | 79.96 |
| 8/24/17 | 78.34 |
| 8/25/17 | 78.63 |
| 8/28/17 | 78.03 |
| 8/29/17 | 78.77 |
| 8/30/17 | 78.54 |
| 8/31/17 | 78.07 |
| 9/1/17 | 78.37 |
| 9/5/17 | 79.8 |
| 9/6/17 | 80.08 |
| 9/7/17 | 80.12 |
| 9/8/17 | 78.88 |
| 9/11/17 | 79.08 |
| 9/12/17 | 79.61 |
| 9/13/17 | 79.86 |
| 9/14/17 | 79.68 |
| 9/15/17 | 80.38 |
| 9/18/17 | 80 |
| 9/19/17 | 80.05 |
| 9/20/17 | 80.5 |
| 9/21/17 | 80.01 |
| 9/22/17 | 79.53 |
| 9/25/17 | 79.15 |
| 9/26/17 | 79.39 |
| 9/27/17 | 79.29 |
| 9/28/17 | 78.95 |
| 9/29/17 | 78.14 |
| 10/2/17 | 78.45 |
| 10/3/17 | 79.22 |
| 10/4/17 | 79.09 |
| 10/5/17 | 79.41 |
| 10/6/17 | 79 |
| 10/9/17 | 80.53 |
| 10/10/17 | 84.13 |
| 10/11/17 | 85.73 |
| 10/12/17 | 86.1 |
| 10/13/17 | 86.62 |
| 10/16/17 | 85.74 |
| 10/17/17 | 85.98 |
| 10/18/17 | 86.22 |
| 10/19/17 | 86.4 |
| 10/20/17 | 87.44 |
| 10/23/17 | 88.65 |
| 10/24/17 | 87.98 |
| 10/25/17 | 88.48 |
| 10/26/17 | 88.62 |
| 10/27/17 | 88.17 |
| 10/30/17 | 86.95 |
| 10/31/17 | 87.31 |
| 11/1/17 | 87.94 |
| 11/2/17 | 88.8 |
| 11/3/17 | 89.68 |
| 11/6/17 | 88.7 |
| 11/7/17 | 88.95 |
| 11/8/17 | 90.26 |
| 11/9/17 | 90.3 |
| 11/10/17 | 90.92 |
| 11/13/17 | 90.99 |
| 11/14/17 | 91.09 |
| 11/15/17 | 89.83 |
| 11/16/17 | 99.62 |
| 11/17/17 | 97.47 |
| 11/20/17 | 97.48 |
| 11/21/17 | 96.52 |
| 11/22/17 | 96.41 |
| 11/24/17 | 96.62 |
| 11/27/17 | 96.62 |
| 11/28/17 | 96.77 |
| 11/29/17 | 97.56 |
| 11/30/17 | 97.23 |
| 12/1/17 | 97.35 |
| 12/4/17 | 97.01 |
| 12/5/17 | 97.83 |
| 12/6/17 | 97.28 |
| 12/7/17 | 96.78 |
| 12/8/17 | 96.55 |
| 12/11/17 | 96.93 |
| 12/12/17 | 96.7 |
| 12/13/17 | 97.76 |
| 12/14/17 | 97.13 |
| 12/15/17 | 97.11 |
| 12/18/17 | 97.9 |
| 12/19/17 | 98.8 |
| 12/20/17 | 98.75 |
| 12/21/17 | 98.06 |
| 12/22/17 | 98.21 |
| 12/26/17 | 99.16 |
| 12/27/17 | 99.26 |
| 12/28/17 | 99.4 |
| 12/29/17 | 98.75 |
| 1/2/18 | 98.59 |
| 1/3/18 | 99.45 |
| 1/4/18 | 99.54 |
| 1/5/18 | 100.13 |
| 1/8/18 | 101.61 |
| 1/9/18 | 100.39 |
| 1/10/18 | 99.67 |
| 1/11/18 | 100.02 |
| 1/12/18 | 100.87 |
| 1/16/18 | 100.69 |
| 1/17/18 | 102.7 |
| 1/18/18 | 104.3 |
| 1/19/18 | 104.59 |
| 1/22/18 | 105.45 |
| 1/23/18 | 105.9 |
| 1/24/18 | 105.79 |
| 1/25/18 | 106.6 |
| 1/26/18 | 108.39 |
| 1/29/18 | 109.55 |
| 1/30/18 | 107.73 |
| 1/31/18 | 106.6 |
| 2/1/18 | 105.52 |
| 2/2/18 | 104.48 |
| 2/5/18 | 100.09 |
| 2/6/18 | 100.9 |
| 2/7/18 | 102.85 |
| 2/8/18 | 100.02 |
| 2/9/18 | 99.37 |
| 2/12/18 | 99.55 |
| 2/13/18 | 100.98 |
| 2/14/18 | 101.7 |
| 2/15/18 | 103.23 |
| 2/16/18 | 104.78 |
| 2/20/18 | 94.11 |
| 2/21/18 | 91.52 |
| 2/22/18 | 92.77 |
| 2/23/18 | 92.89 |
| 2/26/18 | 93.12 |
| 2/27/18 | 91.52 |
| 2/28/18 | 90.01 |
| 3/1/18 | 89.08 |
| 3/2/18 | 88.77 |
| 3/5/18 | 89.98 |
| 3/6/18 | 89.06 |
| 3/7/18 | 87.74 |
| 3/8/18 | 87.92 |
| 3/9/18 | 88.72 |
| 3/12/18 | 88.07 |
| 3/13/18 | 88.3 |
| 3/14/18 | 87.67 |
| 3/15/18 | 87.51 |
| 3/16/18 | 89.17 |
| 3/19/18 | 87.45 |
| 3/20/18 | 87.95 |
| 3/21/18 | 88.18 |
| 3/22/18 | 87.14 |
| 3/23/18 | 85.42 |
| 3/26/18 | 87.5 |
| 3/27/18 | 86.05 |
| 3/28/18 | 87.77 |
| 3/29/18 | 88.97 |
| 4/2/18 | 85.55 |
| 4/3/18 | 86.8 |
| 4/4/18 | 87.22 |
| 4/5/18 | 87.81 |
| 4/6/18 | 86.69 |
| 4/9/18 | 86.28 |
| 4/10/18 | 86.45 |
| 4/11/18 | 85.91 |
| 4/12/18 | 85.43 |
| 4/13/18 | 86.02 |
| 4/16/18 | 86.84 |
| 4/17/18 | 87.9 |
| 4/18/18 | 87.57 |
| 4/19/18 | 87.89 |
| 4/20/18 | 86.98 |
| 4/23/18 | 86.1 |
| 4/24/18 | 86.53 |
| 4/25/18 | 87.17 |
| 4/26/18 | 87.94 |
| 4/27/18 | 87.29 |
| 4/30/18 | 88.46 |
| 5/1/18 | 87.41 |
| 5/2/18 | 86.34 |
| 5/3/18 | 86.23 |
| 5/4/18 | 87.53 |
| 5/7/18 | 85.47 |
| 5/8/18 | 85.74 |
| 5/9/18 | 83.06 |
| 5/10/18 | 82.69 |
| 5/11/18 | 83.38 |
| 5/14/18 | 84.39 |
| 5/15/18 | 84.52 |
| 5/16/18 | 86.13 |
| 5/17/18 | 84.49 |
| 5/18/18 | 83.64 |
| 5/21/18 | 84.51 |
| 5/22/18 | 83.37 |
| 5/23/18 | 83.01 |
| 5/24/18 | 82.85 |
| 5/25/18 | 82.46 |
| 5/29/18 | 82.4 |
| 5/30/18 | 84.12 |
| 5/31/18 | 82.54 |
| 6/1/18 | 82.99 |
| 6/4/18 | 85.42 |
| 6/5/18 | 84.62 |
| 6/6/18 | 84.56 |
| 6/7/18 | 84.95 |
| 6/8/18 | 84.36 |
| 6/11/18 | 84.3 |
| 6/12/18 | 84.1 |
| 6/13/18 | 84.09 |
| 6/14/18 | 83.79 |
| 6/15/18 | 83.7 |
| 6/18/18 | 83 |
| 6/19/18 | 83.61 |
| 6/20/18 | 83.61 |
| 6/21/18 | 84.21 |
| 6/22/18 | 84.82 |
| 6/25/18 | 86.47 |
| 6/26/18 | 85.98 |
| 6/27/18 | 86.89 |
| 6/28/18 | 85.86 |
| 6/29/18 | 85.65 |
| 7/2/18 | 84 |
| 7/3/18 | 84.44 |
| 7/5/18 | 84.57 |
| 7/6/18 | 84.51 |
| 7/9/18 | 85.93 |
| 7/10/18 | 87.21 |
| 7/11/18 | 86.53 |
| 7/12/18 | 86.52 |
| 7/13/18 | 87.7 |
| 7/16/18 | 87.64 |
| 7/17/18 | 88.19 |
| 7/18/18 | 88.07 |
| 7/19/18 | 87.72 |
| 7/20/18 | 88.06 |
| 7/23/18 | 87.63 |
| 7/24/18 | 87.96 |
| 7/25/18 | 87.9 |
| 7/26/18 | 88.23 |
| 7/27/18 | 88.13 |
| 7/30/18 | 88.88 |
| 7/31/18 | 89.23 |
| 8/1/18 | 88.24 |
| 8/2/18 | 88.76 |
| 8/3/18 | 89.6 |
| 8/6/18 | 89.67 |
| 8/7/18 | 89.77 |
| 8/8/18 | 90.05 |
| 8/9/18 | 89.01 |
| 8/10/18 | 90.18 |
| 8/13/18 | 89.64 |
| 8/14/18 | 90.85 |
| 8/15/18 | 90.22 |
| 8/16/18 | 98.64 |
| 8/17/18 | 97.85 |
| 8/20/18 | 96 |
| 8/21/18 | 96.08 |
| 8/22/18 | 95.67 |
| 8/23/18 | 95.18 |
| 8/24/18 | 94.95 |
| 8/27/18 | 94.54 |
| 8/28/18 | 96.07 |
| 8/29/18 | 95.64 |
| 8/30/18 | 96.1 |
| 8/31/18 | 95.86 |
| 9/4/18 | 95.36 |
| 9/5/18 | 96.62 |
| 9/6/18 | 96.45 |
| 9/7/18 | 95.83 |
| 9/10/18 | 96.9 |
| 9/11/18 | 96.64 |
| 9/12/18 | 95.97 |
| 9/13/18 | 95.12 |
| 9/14/18 | 94.59 |
| 9/17/18 | 94.82 |
| 9/18/18 | 95.43 |
| 9/19/18 | 95.24 |
| 9/20/18 | 95.75 |
| 9/21/18 | 95.9 |
| 9/24/18 | 94.92 |
| 9/25/18 | 95.1 |
| 9/26/18 | 94.59 |
| 9/27/18 | 94.13 |
| 9/28/18 | 93.91 |
| 10/1/18 | 94.4 |
| 10/2/18 | 95.15 |
| 10/3/18 | 94.07 |
| 10/4/18 | 94.21 |
| 10/5/18 | 93.31 |
| 10/8/18 | 94.69 |
| 10/9/18 | 97.08 |
| 10/10/18 | 95.76 |
| 10/11/18 | 93.92 |
| 10/12/18 | 94.81 |
| 10/15/18 | 93.82 |
| 10/16/18 | 95.81 |
| 10/17/18 | 96.56 |
| 10/18/18 | 96.17 |
| 10/19/18 | 97.15 |
| 10/22/18 | 97.14 |
| 10/23/18 | 97.8 |
| 10/24/18 | 97.56 |
| 10/25/18 | 99.18 |
| 10/26/18 | 98.94 |
| 10/29/18 | 99.8 |
| 10/30/18 | 102.42 |
| 10/31/18 | 100.28 |
| 11/1/18 | 100.58 |
| 11/2/18 | 101.34 |
| 11/5/18 | 102.91 |
| 11/6/18 | 103.33 |
| 11/7/18 | 104.32 |
| 11/8/18 | 104.88 |
| 11/9/18 | 105.56 |
| 11/12/18 | 103.87 |
| 11/13/18 | 102.94 |
| 11/14/18 | 101.53 |
| 11/15/18 | 99.54 |
| 11/16/18 | 97.69 |
| 11/19/18 | 96.78 |
| 11/20/18 | 94.16 |
| 11/21/18 | 94.17 |
| 11/23/18 | 95.1 |
| 11/26/18 | 95.15 |
| 11/27/18 | 95.04 |
| 11/28/18 | 97.46 |
| 11/29/18 | 97.29 |
| 11/30/18 | 97.65 |
| 12/3/18 | 98.75 |
| 12/4/18 | 95.81 |
| 12/6/18 | 94.77 |
| 12/7/18 | 93.19 |
| 12/10/18 | 93.94 |
| 12/11/18 | 93.85 |
| 12/12/18 | 93.11 |
| 12/13/18 | 92.96 |
| 12/14/18 | 91.85 |
| 12/17/18 | 90.77 |
| 12/18/18 | 91.08 |
| 12/19/18 | 90.55 |
| 12/20/18 | 87.28 |
| 12/21/18 | 87.13 |
| 12/24/18 | 85.82 |
| 12/26/18 | 90.41 |
| 12/27/18 | 91.59 |
| 12/28/18 | 92.13 |
| 12/31/18 | 93.15 |
| 1/2/19 | 93.34 |
| 1/3/19 | 92.86 |
| 1/4/19 | 93.44 |
| 1/7/19 | 94.54 |
| 1/8/19 | 95.2 |
| 1/9/19 | 94.89 |
| 1/10/19 | 94.96 |
| 1/11/19 | 94.84 |
| 1/14/19 | 94.95 |
| 1/15/19 | 96.25 |
| 1/16/19 | 96.35 |
| 1/17/19 | 96.74 |
| 1/18/19 | 97.73 |
| 1/22/19 | 97.49 |
| 1/23/19 | 98.71 |
| 1/24/19 | 98.36 |
| 1/25/19 | 96.94 |
| 1/28/19 | 97.06 |
| 1/29/19 | 96.71 |
| 1/30/19 | 94.8 |
| 1/31/19 | 95.83 |
| 2/1/19 | 93.86 |
| 2/4/19 | 94.77 |
| 2/5/19 | 95.6 |
| 2/6/19 | 95.64 |
| 2/7/19 | 96.73 |
| 2/8/19 | 95.58 |
| 2/11/19 | 96.2 |
| 2/12/19 | 96.97 |
| 2/13/19 | 97.94 |
| 2/14/19 | 98.52 |
| 2/15/19 | 99.99 |
| 2/19/19 | 102.2 |
| 2/20/19 | 99.88 |
| 2/21/19 | 99.39 |
| 2/22/19 | 99.55 |
| 2/25/19 | 99.12 |
| 2/26/19 | 98.69 |
| 2/27/19 | 98.11 |
| 2/28/19 | 98.99 |
| 3/1/19 | 97.93 |
| 3/4/19 | 97.85 |
| 3/5/19 | 98.34 |
| 3/6/19 | 98.26 |
| 3/7/19 | 97.45 |
| 3/8/19 | 97.59 |
| 3/11/19 | 98.48 |
| 3/12/19 | 98.37 |
| 3/13/19 | 99.03 |
| 3/14/19 | 98.22 |
| 3/15/19 | 98.42 |
| 3/18/19 | 99.66 |
| 3/19/19 | 99.85 |
| 3/20/19 | 98.64 |
| 3/21/19 | 99.06 |
| 3/22/19 | 98.28 |
| 3/25/19 | 98.17 |
| 3/26/19 | 98.32 |
| 3/27/19 | 97.21 |
| 3/28/19 | 97.13 |
| 3/29/19 | 97.53 |
| 4/1/19 | 97.82 |
| 4/2/19 | 96.94 |
| 4/3/19 | 97.19 |
| 4/4/19 | 98.11 |
| 4/5/19 | 98.83 |
| 4/8/19 | 99.23 |
| 4/9/19 | 98.69 |
| 4/10/19 | 99.6 |
| 4/11/19 | 100.8 |
| 4/12/19 | 101.56 |
| 4/15/19 | 102.43 |
| 4/16/19 | 102.93 |
| 4/17/19 | 103.16 |
| 4/18/19 | 103.18 |
| 4/22/19 | 102.37 |
| 4/23/19 | 103.07 |
| 4/24/19 | 103.53 |
| 4/25/19 | 103.52 |
| 4/26/19 | 101.53 |
| 4/29/19 | 101.56 |
| 4/30/19 | 102.84 |
| 5/1/19 | 101.36 |
| 5/2/19 | 101.15 |
| 5/3/19 | 102.08 |
| 5/6/19 | 102.46 |
| 5/7/19 | 101.3 |
| 5/8/19 | 100.3 |
| 5/9/19 | 99.54 |
| 5/10/19 | 101.91 |
| 5/13/19 | 99.89 |
| 5/14/19 | 100.29 |
| 5/15/19 | 99.88 |
| 5/16/19 | 101.31 |
| 5/17/19 | 100.86 |
| 5/20/19 | 101.52 |
| 5/21/19 | 101.12 |
| 5/22/19 | 102.23 |
| 5/23/19 | 101.86 |
| 5/24/19 | 102.67 |
| 5/28/19 | 102.42 |
| 5/29/19 | 102.12 |
| 5/30/19 | 102.19 |
| 5/31/19 | 101.44 |
| 6/3/19 | 101.96 |
| 6/4/19 | 102.56 |
| 6/5/19 | 104.42 |
| 6/6/19 | 105.11 |
| 6/7/19 | 106.06 |
| 6/10/19 | 107.52 |
| 6/11/19 | 107.94 |
| 6/12/19 | 108.82 |
| 6/13/19 | 108.65 |
| 6/14/19 | 109.07 |
| 6/17/19 | 109.16 |
| 6/18/19 | 109.65 |
| 6/19/19 | 109.62 |
| 6/20/19 | 110.32 |
| 6/21/19 | 111.13 |
| 6/24/19 | 111.24 |
| 6/25/19 | 110.72 |
| 6/26/19 | 110.16 |
| 6/27/19 | 110.1 |
| 6/28/19 | 110.49 |
| 7/1/19 | 110.62 |
| 7/2/19 | 111.6 |
| 7/3/19 | 112.32 |
| 7/5/19 | 111.98 |
| 7/8/19 | 112.72 |
| 7/9/19 | 112.88 |
| 7/10/19 | 112.98 |
| 7/11/19 | 113.92 |
| 7/12/19 | 114.6 |
| 7/15/19 | 114.98 |
| 7/16/19 | 114.76 |
| 7/17/19 | 114.6 |
| 7/18/19 | 114.72 |
| 7/19/19 | 113.9 |
| 7/22/19 | 112.82 |
| 7/23/19 | 112.09 |
| 7/24/19 | 112 |
| 7/25/19 | 112.22 |
| 7/26/19 | 113.02 |
| 7/29/19 | 112.27 |
| 7/30/19 | 112.06 |
| 7/31/19 | 110.38 |
| 8/1/19 | 109.38 |
| 8/2/19 | 109.4 |
| 8/5/19 | 105.82 |
| 8/6/19 | 107.27 |
| 8/7/19 | 108.2 |
| 8/8/19 | 108.52 |
| 8/9/19 | 107.28 |
| 8/12/19 | 105.22 |
| 8/13/19 | 107.41 |
| 8/14/19 | 106.2 |
| 8/15/19 | 112.69 |
| 8/16/19 | 112.99 |
| 8/19/19 | 113.81 |
| 8/20/19 | 112.05 |
| 8/21/19 | 112.02 |
| 8/22/19 | 111.91 |
| 8/23/19 | 110.83 |
| 8/26/19 | 111.99 |
| 8/27/19 | 112.42 |
| 8/28/19 | 112.72 |
| 8/29/19 | 114.08 |
| 8/30/19 | 114.26 |
| 9/3/19 | 114.64 |
| 9/4/19 | 115.91 |
| 9/5/19 | 115.44 |
| 9/6/19 | 114.73 |
| 9/9/19 | 116.33 |
| 9/10/19 | 116.05 |
| 9/11/19 | 116.02 |
| 9/12/19 | 116.92 |
| 9/13/19 | 117.43 |
| 9/16/19 | 115.57 |
| 9/17/19 | 116.51 |
| 9/18/19 | 117.16 |
| 9/19/19 | 117.11 |
| 9/20/19 | 116.98 |
| 9/23/19 | 117.62 |
| 9/24/19 | 118.4 |
| 9/25/19 | 118.47 |
| 9/26/19 | 118.3 |
| 9/27/19 | 118.45 |
| 9/30/19 | 118.68 |
| 10/1/19 | 117.85 |
| 10/2/19 | 116.12 |
| 10/3/19 | 116.31 |
| 10/4/19 | 118.16 |
| 10/7/19 | 117.23 |
| 10/8/19 | 117.58 |
| 10/9/19 | 118.93 |
| 10/10/19 | 119.61 |
| 10/11/19 | 120.24 |
| 10/14/19 | 119.17 |
| 10/15/19 | 119.53 |
| 10/16/19 | 119.42 |
| 10/17/19 | 119.84 |
| 10/18/19 | 119.14 |
| 10/21/19 | 119.74 |
| 10/22/19 | 119.58 |
| 10/23/19 | 119.35 |
| 10/24/19 | 119.1 |
| 10/25/19 | 119.04 |
| 10/28/19 | 119.22 |
| 10/29/19 | 117.15 |
| 10/30/19 | 118.1 |
| 10/31/19 | 117.26 |
| 11/1/19 | 117.62 |
| 11/4/19 | 117.57 |
| 11/5/19 | 118.86 |
| 11/6/19 | 119.5 |
| 11/7/19 | 120.23 |
| 11/8/19 | 119.44 |
| 11/11/19 | 119.04 |
| 11/12/19 | 119.12 |
| 11/13/19 | 120.98 |
| 11/14/19 | 120.65 |
| 11/15/19 | 118.87 |
| 11/18/19 | 120.25 |
| 11/19/19 | 119.89 |
| 11/20/19 | 119.13 |
| 11/21/19 | 119.86 |
| 11/22/19 | 119.36 |
| 11/25/19 | 118.92 |
| 11/26/19 | 119.19 |
| 11/27/19 | 118.76 |
| 11/29/19 | 119.09 |
| 12/2/19 | 119.28 |
| 12/3/19 | 118.67 |
| 12/4/19 | 118.69 |
| 12/5/19 | 118.66 |
| 12/6/19 | 119.78 |
| 12/9/19 | 119.36 |
| 12/10/19 | 119.14 |
| 12/11/19 | 119 |
| 12/12/19 | 119.76 |
| 12/13/19 | 120.29 |
| 12/16/19 | 120.54 |
| 12/17/19 | 121.28 |
| 12/18/19 | 119.86 |
| 12/19/19 | 120.08 |
| 12/20/19 | 120.29 |
| 12/23/19 | 119.03 |
| 12/24/19 | 119.51 |
| 12/26/19 | 119.52 |
| 12/27/19 | 119.59 |
| 12/30/19 | 119.4 |